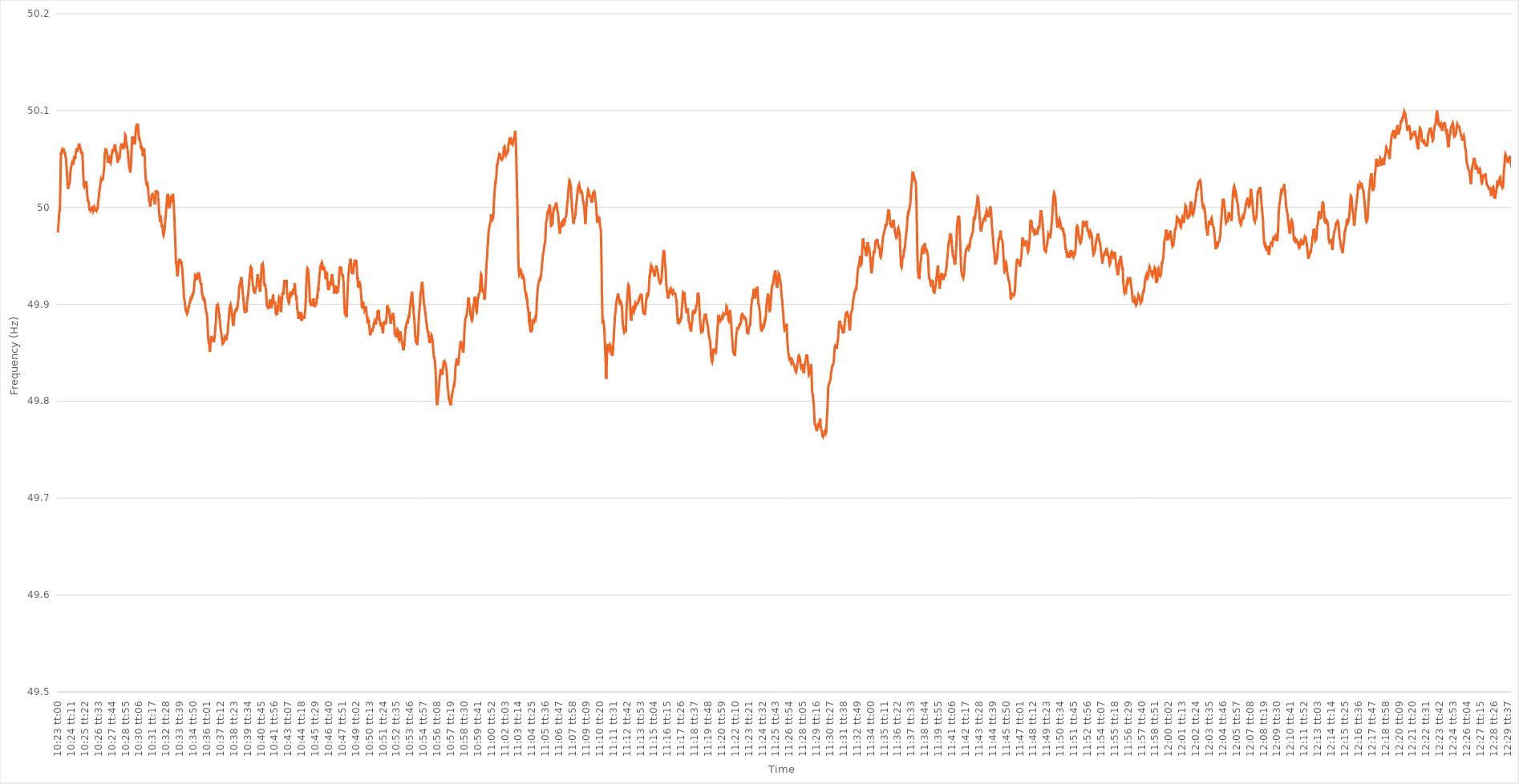
| Category | Series 0 |
|---|---|
| 0.43263888888888885 | 49.974 |
| 0.432650462962963 | 49.976 |
| 0.43266203703703704 | 49.979 |
| 0.43267361111111113 | 49.982 |
| 0.4326851851851852 | 49.984 |
| 0.43269675925925927 | 49.987 |
| 0.4327083333333333 | 49.99 |
| 0.43271990740740746 | 49.994 |
| 0.4327314814814815 | 49.995 |
| 0.4327430555555556 | 49.997 |
| 0.43275462962962963 | 49.996 |
| 0.43276620370370367 | 49.998 |
| 0.43277777777777776 | 50.008 |
| 0.4327893518518518 | 50.021 |
| 0.43280092592592595 | 50.033 |
| 0.4328125 | 50.045 |
| 0.4328240740740741 | 50.054 |
| 0.4328356481481481 | 50.057 |
| 0.4328472222222222 | 50.055 |
| 0.43285879629629626 | 50.056 |
| 0.4328703703703704 | 50.058 |
| 0.43288194444444444 | 50.058 |
| 0.43289351851851854 | 50.059 |
| 0.4329050925925926 | 50.058 |
| 0.43291666666666667 | 50.057 |
| 0.4329282407407407 | 50.058 |
| 0.43293981481481486 | 50.06 |
| 0.4329513888888889 | 50.059 |
| 0.432962962962963 | 50.06 |
| 0.43297453703703703 | 50.061 |
| 0.4329861111111111 | 50.061 |
| 0.43299768518518517 | 50.061 |
| 0.4330092592592593 | 50.058 |
| 0.43302083333333335 | 50.057 |
| 0.4330324074074074 | 50.058 |
| 0.4330439814814815 | 50.056 |
| 0.4330555555555555 | 50.055 |
| 0.4330671296296296 | 50.056 |
| 0.43307870370370366 | 50.055 |
| 0.4330902777777778 | 50.055 |
| 0.43310185185185185 | 50.053 |
| 0.43311342592592594 | 50.052 |
| 0.433125 | 50.051 |
| 0.4331365740740741 | 50.05 |
| 0.4331481481481481 | 50.047 |
| 0.43315972222222227 | 50.044 |
| 0.4331712962962963 | 50.041 |
| 0.4331828703703704 | 50.037 |
| 0.43319444444444444 | 50.034 |
| 0.43320601851851853 | 50.031 |
| 0.43321759259259257 | 50.028 |
| 0.4332291666666667 | 50.025 |
| 0.43324074074074076 | 50.022 |
| 0.4332523148148148 | 50.021 |
| 0.4332638888888889 | 50.019 |
| 0.43327546296296293 | 50.02 |
| 0.433287037037037 | 50.021 |
| 0.43329861111111106 | 50.022 |
| 0.4333101851851852 | 50.023 |
| 0.43332175925925925 | 50.024 |
| 0.43333333333333335 | 50.024 |
| 0.4333449074074074 | 50.025 |
| 0.4333564814814815 | 50.026 |
| 0.4333680555555555 | 50.028 |
| 0.43337962962962967 | 50.031 |
| 0.4333912037037037 | 50.035 |
| 0.4334027777777778 | 50.037 |
| 0.43341435185185184 | 50.037 |
| 0.43342592592592594 | 50.039 |
| 0.4334375 | 50.041 |
| 0.4334490740740741 | 50.041 |
| 0.43346064814814816 | 50.042 |
| 0.4334722222222222 | 50.043 |
| 0.4334837962962963 | 50.045 |
| 0.43349537037037034 | 50.045 |
| 0.43350694444444443 | 50.045 |
| 0.43351851851851847 | 50.047 |
| 0.4335300925925926 | 50.047 |
| 0.43354166666666666 | 50.046 |
| 0.43355324074074075 | 50.044 |
| 0.4335648148148148 | 50.045 |
| 0.4335763888888889 | 50.045 |
| 0.4335879629629629 | 50.045 |
| 0.4335995370370371 | 50.045 |
| 0.4336111111111111 | 50.048 |
| 0.4336226851851852 | 50.051 |
| 0.43363425925925925 | 50.053 |
| 0.43364583333333334 | 50.051 |
| 0.4336574074074074 | 50.052 |
| 0.43366898148148153 | 50.051 |
| 0.43368055555555557 | 50.051 |
| 0.43369212962962966 | 50.05 |
| 0.4337037037037037 | 50.052 |
| 0.4337152777777778 | 50.055 |
| 0.43372685185185184 | 50.056 |
| 0.4337384259259259 | 50.057 |
| 0.43375 | 50.059 |
| 0.43376157407407406 | 50.059 |
| 0.43377314814814816 | 50.061 |
| 0.4337847222222222 | 50.059 |
| 0.4337962962962963 | 50.057 |
| 0.43380787037037033 | 50.058 |
| 0.4338194444444445 | 50.059 |
| 0.4338310185185185 | 50.059 |
| 0.4338425925925926 | 50.06 |
| 0.43385416666666665 | 50.061 |
| 0.43386574074074075 | 50.06 |
| 0.4338773148148148 | 50.06 |
| 0.43388888888888894 | 50.062 |
| 0.433900462962963 | 50.064 |
| 0.43391203703703707 | 50.064 |
| 0.4339236111111111 | 50.065 |
| 0.4339351851851852 | 50.066 |
| 0.43394675925925924 | 50.065 |
| 0.4339583333333333 | 50.063 |
| 0.43396990740740743 | 50.063 |
| 0.43398148148148147 | 50.063 |
| 0.43399305555555556 | 50.062 |
| 0.4340046296296296 | 50.061 |
| 0.4340162037037037 | 50.061 |
| 0.43402777777777773 | 50.061 |
| 0.4340393518518519 | 50.059 |
| 0.4340509259259259 | 50.056 |
| 0.4340625 | 50.057 |
| 0.43407407407407406 | 50.058 |
| 0.43408564814814815 | 50.058 |
| 0.4340972222222222 | 50.055 |
| 0.43410879629629634 | 50.056 |
| 0.4341203703703704 | 50.057 |
| 0.4341319444444445 | 50.055 |
| 0.4341435185185185 | 50.05 |
| 0.4341550925925926 | 50.045 |
| 0.43416666666666665 | 50.04 |
| 0.4341782407407407 | 50.035 |
| 0.43418981481481483 | 50.031 |
| 0.4342013888888889 | 50.029 |
| 0.43421296296296297 | 50.025 |
| 0.434224537037037 | 50.022 |
| 0.4342361111111111 | 50.022 |
| 0.43424768518518514 | 50.021 |
| 0.4342592592592593 | 50.021 |
| 0.43427083333333333 | 50.022 |
| 0.4342824074074074 | 50.022 |
| 0.43429398148148146 | 50.022 |
| 0.43430555555555556 | 50.022 |
| 0.4343171296296296 | 50.023 |
| 0.43432870370370374 | 50.022 |
| 0.4343402777777778 | 50.024 |
| 0.4343518518518519 | 50.027 |
| 0.4343634259259259 | 50.026 |
| 0.434375 | 50.025 |
| 0.43438657407407405 | 50.025 |
| 0.4343981481481482 | 50.021 |
| 0.43440972222222224 | 50.017 |
| 0.43442129629629633 | 50.013 |
| 0.43443287037037037 | 50.011 |
| 0.4344444444444444 | 50.01 |
| 0.4344560185185185 | 50.006 |
| 0.43446759259259254 | 50.006 |
| 0.4344791666666667 | 50.007 |
| 0.43449074074074073 | 50.007 |
| 0.4345023148148148 | 50.006 |
| 0.43451388888888887 | 50.006 |
| 0.43452546296296296 | 50.004 |
| 0.434537037037037 | 50 |
| 0.43454861111111115 | 49.999 |
| 0.4345601851851852 | 49.997 |
| 0.4345717592592593 | 49.998 |
| 0.4345833333333333 | 49.997 |
| 0.4345949074074074 | 49.998 |
| 0.43460648148148145 | 49.998 |
| 0.4346180555555556 | 49.999 |
| 0.43462962962962964 | 49.997 |
| 0.43464120370370374 | 49.997 |
| 0.4346527777777778 | 49.997 |
| 0.4346643518518518 | 49.998 |
| 0.4346759259259259 | 49.998 |
| 0.43468749999999995 | 49.997 |
| 0.4346990740740741 | 49.999 |
| 0.43471064814814814 | 50 |
| 0.43472222222222223 | 50.001 |
| 0.43473379629629627 | 50.001 |
| 0.43474537037037037 | 49.999 |
| 0.4347569444444444 | 49.998 |
| 0.43476851851851855 | 49.997 |
| 0.4347800925925926 | 49.996 |
| 0.4347916666666667 | 49.996 |
| 0.4348032407407407 | 49.997 |
| 0.4348148148148148 | 49.999 |
| 0.43482638888888886 | 50 |
| 0.434837962962963 | 50 |
| 0.43484953703703705 | 50.001 |
| 0.43486111111111114 | 50.001 |
| 0.4348726851851852 | 50.001 |
| 0.4348842592592593 | 50 |
| 0.4348958333333333 | 49.997 |
| 0.43490740740740735 | 49.996 |
| 0.4349189814814815 | 49.998 |
| 0.43493055555555554 | 49.999 |
| 0.43494212962962964 | 49.998 |
| 0.4349537037037037 | 49.998 |
| 0.43496527777777777 | 49.998 |
| 0.4349768518518518 | 49.997 |
| 0.43498842592592596 | 49.999 |
| 0.435 | 49.997 |
| 0.4350115740740741 | 49.998 |
| 0.43502314814814813 | 49.998 |
| 0.4350347222222222 | 49.998 |
| 0.43504629629629626 | 49.999 |
| 0.4350578703703704 | 49.999 |
| 0.43506944444444445 | 50.001 |
| 0.43508101851851855 | 50.005 |
| 0.4350925925925926 | 50.007 |
| 0.4351041666666667 | 50.008 |
| 0.4351157407407407 | 50.008 |
| 0.43512731481481487 | 50.011 |
| 0.4351388888888889 | 50.014 |
| 0.43515046296296295 | 50.015 |
| 0.43516203703703704 | 50.017 |
| 0.4351736111111111 | 50.018 |
| 0.4351851851851852 | 50.019 |
| 0.4351967592592592 | 50.021 |
| 0.43520833333333336 | 50.023 |
| 0.4352199074074074 | 50.024 |
| 0.4352314814814815 | 50.026 |
| 0.43524305555555554 | 50.028 |
| 0.43525462962962963 | 50.029 |
| 0.43526620370370367 | 50.029 |
| 0.4352777777777778 | 50.028 |
| 0.43528935185185186 | 50.027 |
| 0.43530092592592595 | 50.028 |
| 0.4353125 | 50.028 |
| 0.4353240740740741 | 50.03 |
| 0.4353356481481481 | 50.028 |
| 0.4353472222222223 | 50.028 |
| 0.4353587962962963 | 50.029 |
| 0.43537037037037035 | 50.029 |
| 0.43538194444444445 | 50.03 |
| 0.4353935185185185 | 50.032 |
| 0.4354050925925926 | 50.034 |
| 0.4354166666666666 | 50.036 |
| 0.43542824074074077 | 50.038 |
| 0.4354398148148148 | 50.039 |
| 0.4354513888888889 | 50.041 |
| 0.43546296296296294 | 50.047 |
| 0.43547453703703703 | 50.051 |
| 0.4354861111111111 | 50.055 |
| 0.4354976851851852 | 50.056 |
| 0.43550925925925926 | 50.058 |
| 0.43552083333333336 | 50.059 |
| 0.4355324074074074 | 50.059 |
| 0.4355439814814815 | 50.059 |
| 0.43555555555555553 | 50.058 |
| 0.4355671296296297 | 50.059 |
| 0.4355787037037037 | 50.057 |
| 0.4355902777777778 | 50.057 |
| 0.43560185185185185 | 50.058 |
| 0.43561342592592595 | 50.057 |
| 0.435625 | 50.057 |
| 0.435636574074074 | 50.055 |
| 0.4356481481481482 | 50.055 |
| 0.4356597222222222 | 50.052 |
| 0.4356712962962963 | 50.051 |
| 0.43568287037037035 | 50.048 |
| 0.43569444444444444 | 50.046 |
| 0.4357060185185185 | 50.047 |
| 0.43571759259259263 | 50.047 |
| 0.43572916666666667 | 50.049 |
| 0.43574074074074076 | 50.049 |
| 0.4357523148148148 | 50.05 |
| 0.4357638888888889 | 50.049 |
| 0.43577546296296293 | 50.051 |
| 0.4357870370370371 | 50.053 |
| 0.4357986111111111 | 50.052 |
| 0.4358101851851852 | 50.05 |
| 0.43582175925925926 | 50.047 |
| 0.43583333333333335 | 50.047 |
| 0.4358449074074074 | 50.046 |
| 0.43585648148148143 | 50.046 |
| 0.4358680555555556 | 50.048 |
| 0.4358796296296296 | 50.05 |
| 0.4358912037037037 | 50.051 |
| 0.43590277777777775 | 50.051 |
| 0.43591435185185184 | 50.055 |
| 0.4359259259259259 | 50.056 |
| 0.43593750000000003 | 50.057 |
| 0.43594907407407407 | 50.059 |
| 0.43596064814814817 | 50.06 |
| 0.4359722222222222 | 50.059 |
| 0.4359837962962963 | 50.059 |
| 0.43599537037037034 | 50.058 |
| 0.4360069444444445 | 50.058 |
| 0.4360185185185185 | 50.058 |
| 0.4360300925925926 | 50.059 |
| 0.43604166666666666 | 50.061 |
| 0.43605324074074076 | 50.062 |
| 0.4360648148148148 | 50.061 |
| 0.43607638888888883 | 50.063 |
| 0.436087962962963 | 50.065 |
| 0.436099537037037 | 50.065 |
| 0.4361111111111111 | 50.065 |
| 0.43612268518518515 | 50.065 |
| 0.43613425925925925 | 50.063 |
| 0.4361458333333333 | 50.06 |
| 0.43615740740740744 | 50.059 |
| 0.4361689814814815 | 50.058 |
| 0.43618055555555557 | 50.057 |
| 0.4361921296296296 | 50.056 |
| 0.4362037037037037 | 50.057 |
| 0.43621527777777774 | 50.053 |
| 0.4362268518518519 | 50.052 |
| 0.43623842592592593 | 50.051 |
| 0.43625 | 50.048 |
| 0.43626157407407407 | 50.046 |
| 0.43627314814814816 | 50.047 |
| 0.4362847222222222 | 50.047 |
| 0.43629629629629635 | 50.049 |
| 0.4363078703703704 | 50.05 |
| 0.4363194444444445 | 50.049 |
| 0.4363310185185185 | 50.05 |
| 0.43634259259259256 | 50.051 |
| 0.43635416666666665 | 50.051 |
| 0.4363657407407407 | 50.05 |
| 0.43637731481481484 | 50.05 |
| 0.4363888888888889 | 50.053 |
| 0.436400462962963 | 50.054 |
| 0.436412037037037 | 50.056 |
| 0.4364236111111111 | 50.058 |
| 0.43643518518518515 | 50.061 |
| 0.4364467592592593 | 50.063 |
| 0.43645833333333334 | 50.062 |
| 0.43646990740740743 | 50.063 |
| 0.43648148148148147 | 50.065 |
| 0.43649305555555556 | 50.066 |
| 0.4365046296296296 | 50.066 |
| 0.43651620370370375 | 50.066 |
| 0.4365277777777778 | 50.064 |
| 0.4365393518518519 | 50.065 |
| 0.4365509259259259 | 50.064 |
| 0.43656249999999996 | 50.064 |
| 0.43657407407407406 | 50.063 |
| 0.4365856481481481 | 50.061 |
| 0.43659722222222225 | 50.06 |
| 0.4366087962962963 | 50.062 |
| 0.4366203703703704 | 50.061 |
| 0.4366319444444444 | 50.062 |
| 0.4366435185185185 | 50.063 |
| 0.43665509259259255 | 50.064 |
| 0.4366666666666667 | 50.064 |
| 0.43667824074074074 | 50.067 |
| 0.43668981481481484 | 50.068 |
| 0.4367013888888889 | 50.069 |
| 0.43671296296296297 | 50.071 |
| 0.436724537037037 | 50.075 |
| 0.43673611111111116 | 50.075 |
| 0.4367476851851852 | 50.075 |
| 0.4367592592592593 | 50.074 |
| 0.43677083333333333 | 50.069 |
| 0.43678240740740737 | 50.068 |
| 0.43679398148148146 | 50.068 |
| 0.4368055555555555 | 50.064 |
| 0.43681712962962965 | 50.061 |
| 0.4368287037037037 | 50.061 |
| 0.4368402777777778 | 50.062 |
| 0.4368518518518518 | 50.062 |
| 0.4368634259259259 | 50.06 |
| 0.43687499999999996 | 50.06 |
| 0.4368865740740741 | 50.057 |
| 0.43689814814814815 | 50.055 |
| 0.43690972222222224 | 50.052 |
| 0.4369212962962963 | 50.049 |
| 0.4369328703703704 | 50.047 |
| 0.4369444444444444 | 50.046 |
| 0.43695601851851856 | 50.044 |
| 0.4369675925925926 | 50.041 |
| 0.4369791666666667 | 50.041 |
| 0.43699074074074074 | 50.04 |
| 0.43700231481481483 | 50.039 |
| 0.43701388888888887 | 50.038 |
| 0.437025462962963 | 50.037 |
| 0.43703703703703706 | 50.036 |
| 0.4370486111111111 | 50.038 |
| 0.4370601851851852 | 50.04 |
| 0.43707175925925923 | 50.043 |
| 0.4370833333333333 | 50.049 |
| 0.43709490740740736 | 50.052 |
| 0.4371064814814815 | 50.056 |
| 0.43711805555555555 | 50.061 |
| 0.43712962962962965 | 50.065 |
| 0.4371412037037037 | 50.069 |
| 0.4371527777777778 | 50.072 |
| 0.4371643518518518 | 50.073 |
| 0.43717592592592597 | 50.071 |
| 0.4371875 | 50.07 |
| 0.4371990740740741 | 50.069 |
| 0.43721064814814814 | 50.069 |
| 0.43722222222222223 | 50.071 |
| 0.4372337962962963 | 50.073 |
| 0.4372453703703704 | 50.072 |
| 0.43725694444444446 | 50.07 |
| 0.4372685185185185 | 50.069 |
| 0.4372800925925926 | 50.066 |
| 0.43729166666666663 | 50.065 |
| 0.43730324074074073 | 50.065 |
| 0.43731481481481477 | 50.067 |
| 0.4373263888888889 | 50.068 |
| 0.43733796296296296 | 50.071 |
| 0.43734953703703705 | 50.074 |
| 0.4373611111111111 | 50.078 |
| 0.4373726851851852 | 50.08 |
| 0.4373842592592592 | 50.082 |
| 0.4373958333333334 | 50.084 |
| 0.4374074074074074 | 50.084 |
| 0.4374189814814815 | 50.083 |
| 0.43743055555555554 | 50.086 |
| 0.43744212962962964 | 50.085 |
| 0.4374537037037037 | 50.084 |
| 0.43746527777777783 | 50.084 |
| 0.43747685185185187 | 50.085 |
| 0.43748842592592596 | 50.086 |
| 0.4375 | 50.085 |
| 0.43751157407407404 | 50.082 |
| 0.43752314814814813 | 50.078 |
| 0.43753472222222217 | 50.076 |
| 0.4375462962962963 | 50.074 |
| 0.43755787037037036 | 50.073 |
| 0.43756944444444446 | 50.071 |
| 0.4375810185185185 | 50.069 |
| 0.4375925925925926 | 50.069 |
| 0.4376041666666666 | 50.07 |
| 0.4376157407407408 | 50.07 |
| 0.4376273148148148 | 50.069 |
| 0.4376388888888889 | 50.068 |
| 0.43765046296296295 | 50.066 |
| 0.43766203703703704 | 50.064 |
| 0.4376736111111111 | 50.062 |
| 0.43768518518518523 | 50.062 |
| 0.43769675925925927 | 50.061 |
| 0.43770833333333337 | 50.061 |
| 0.4377199074074074 | 50.061 |
| 0.4377314814814815 | 50.062 |
| 0.43774305555555554 | 50.062 |
| 0.4377546296296296 | 50.061 |
| 0.4377662037037037 | 50.06 |
| 0.43777777777777777 | 50.057 |
| 0.43778935185185186 | 50.054 |
| 0.4378009259259259 | 50.055 |
| 0.4378125 | 50.053 |
| 0.43782407407407403 | 50.053 |
| 0.4378356481481482 | 50.054 |
| 0.4378472222222222 | 50.058 |
| 0.4378587962962963 | 50.06 |
| 0.43787037037037035 | 50.061 |
| 0.43788194444444445 | 50.058 |
| 0.4378935185185185 | 50.058 |
| 0.43790509259259264 | 50.058 |
| 0.4379166666666667 | 50.051 |
| 0.43792824074074077 | 50.043 |
| 0.4379398148148148 | 50.039 |
| 0.4379513888888889 | 50.034 |
| 0.43796296296296294 | 50.031 |
| 0.437974537037037 | 50.029 |
| 0.43798611111111113 | 50.028 |
| 0.43799768518518517 | 50.026 |
| 0.43800925925925926 | 50.025 |
| 0.4380208333333333 | 50.025 |
| 0.4380324074074074 | 50.026 |
| 0.43804398148148144 | 50.026 |
| 0.4380555555555556 | 50.025 |
| 0.4380671296296296 | 50.026 |
| 0.4380787037037037 | 50.024 |
| 0.43809027777777776 | 50.022 |
| 0.43810185185185185 | 50.021 |
| 0.4381134259259259 | 50.02 |
| 0.43812500000000004 | 50.017 |
| 0.4381365740740741 | 50.014 |
| 0.4381481481481482 | 50.012 |
| 0.4381597222222222 | 50.011 |
| 0.4381712962962963 | 50.008 |
| 0.43818287037037035 | 50.006 |
| 0.4381944444444445 | 50.007 |
| 0.43820601851851854 | 50.006 |
| 0.43821759259259263 | 50.005 |
| 0.43822916666666667 | 50.002 |
| 0.4382407407407407 | 50.001 |
| 0.4382523148148148 | 50.001 |
| 0.43826388888888884 | 50.004 |
| 0.438275462962963 | 50.005 |
| 0.43828703703703703 | 50.007 |
| 0.4382986111111111 | 50.008 |
| 0.43831018518518516 | 50.008 |
| 0.43832175925925926 | 50.009 |
| 0.4383333333333333 | 50.012 |
| 0.43834490740740745 | 50.013 |
| 0.4383564814814815 | 50.014 |
| 0.4383680555555556 | 50.013 |
| 0.4383796296296296 | 50.014 |
| 0.4383912037037037 | 50.012 |
| 0.43840277777777775 | 50.011 |
| 0.4384143518518519 | 50.012 |
| 0.43842592592592594 | 50.012 |
| 0.43843750000000004 | 50.011 |
| 0.4384490740740741 | 50.012 |
| 0.4384606481481481 | 50.01 |
| 0.4384722222222222 | 50.01 |
| 0.43848379629629625 | 50.009 |
| 0.4384953703703704 | 50.007 |
| 0.43850694444444444 | 50.004 |
| 0.43851851851851853 | 50.003 |
| 0.43853009259259257 | 50.004 |
| 0.43854166666666666 | 50.006 |
| 0.4385532407407407 | 50.01 |
| 0.43856481481481485 | 50.014 |
| 0.4385763888888889 | 50.017 |
| 0.438587962962963 | 50.018 |
| 0.438599537037037 | 50.017 |
| 0.4386111111111111 | 50.017 |
| 0.43862268518518516 | 50.017 |
| 0.4386342592592593 | 50.016 |
| 0.43864583333333335 | 50.015 |
| 0.43865740740740744 | 50.013 |
| 0.4386689814814815 | 50.015 |
| 0.4386805555555555 | 50.016 |
| 0.4386921296296296 | 50.017 |
| 0.43870370370370365 | 50.013 |
| 0.4387152777777778 | 50.011 |
| 0.43872685185185184 | 50.01 |
| 0.43873842592592593 | 50.008 |
| 0.43875 | 50.005 |
| 0.43876157407407407 | 50.001 |
| 0.4387731481481481 | 49.998 |
| 0.43878472222222226 | 49.995 |
| 0.4387962962962963 | 49.992 |
| 0.4388078703703704 | 49.991 |
| 0.43881944444444443 | 49.989 |
| 0.4388310185185185 | 49.985 |
| 0.43884259259259256 | 49.987 |
| 0.4388541666666667 | 49.987 |
| 0.43886574074074075 | 49.988 |
| 0.43887731481481485 | 49.988 |
| 0.4388888888888889 | 49.989 |
| 0.438900462962963 | 49.988 |
| 0.438912037037037 | 49.986 |
| 0.43892361111111106 | 49.983 |
| 0.4389351851851852 | 49.982 |
| 0.43894675925925924 | 49.98 |
| 0.43895833333333334 | 49.981 |
| 0.4389699074074074 | 49.98 |
| 0.4389814814814815 | 49.98 |
| 0.4389930555555555 | 49.979 |
| 0.43900462962962966 | 49.978 |
| 0.4390162037037037 | 49.974 |
| 0.4390277777777778 | 49.972 |
| 0.43903935185185183 | 49.972 |
| 0.43905092592592593 | 49.971 |
| 0.43906249999999997 | 49.972 |
| 0.4390740740740741 | 49.973 |
| 0.43908564814814816 | 49.973 |
| 0.43909722222222225 | 49.973 |
| 0.4391087962962963 | 49.977 |
| 0.4391203703703704 | 49.979 |
| 0.4391319444444444 | 49.982 |
| 0.43914351851851857 | 49.983 |
| 0.4391550925925926 | 49.987 |
| 0.43916666666666665 | 49.989 |
| 0.43917824074074074 | 49.991 |
| 0.4391898148148148 | 49.992 |
| 0.4392013888888889 | 49.994 |
| 0.4392129629629629 | 49.999 |
| 0.43922453703703707 | 50.001 |
| 0.4392361111111111 | 50.003 |
| 0.4392476851851852 | 50.005 |
| 0.43925925925925924 | 50.007 |
| 0.43927083333333333 | 50.011 |
| 0.43928240740740737 | 50.012 |
| 0.4392939814814815 | 50.014 |
| 0.43930555555555556 | 50.014 |
| 0.43931712962962965 | 50.014 |
| 0.4393287037037037 | 50.012 |
| 0.4393402777777778 | 50.011 |
| 0.4393518518518518 | 50.007 |
| 0.439363425925926 | 50.003 |
| 0.439375 | 50.002 |
| 0.4393865740740741 | 50 |
| 0.43939814814814815 | 50 |
| 0.4394097222222222 | 49.999 |
| 0.4394212962962963 | 50.001 |
| 0.4394328703703703 | 50.001 |
| 0.43944444444444447 | 50.003 |
| 0.4394560185185185 | 50.004 |
| 0.4394675925925926 | 50.006 |
| 0.43947916666666664 | 50.009 |
| 0.43949074074074074 | 50.01 |
| 0.4395023148148148 | 50.012 |
| 0.4395138888888889 | 50.012 |
| 0.43952546296296297 | 50.01 |
| 0.43953703703703706 | 50.01 |
| 0.4395486111111111 | 50.009 |
| 0.4395601851851852 | 50.01 |
| 0.43957175925925923 | 50.01 |
| 0.4395833333333334 | 50.011 |
| 0.4395949074074074 | 50.011 |
| 0.4396064814814815 | 50.014 |
| 0.43961805555555555 | 50.014 |
| 0.43962962962962965 | 50.012 |
| 0.4396412037037037 | 50.01 |
| 0.4396527777777777 | 50.009 |
| 0.4396643518518519 | 50.005 |
| 0.4396759259259259 | 50.001 |
| 0.4396875 | 49.996 |
| 0.43969907407407405 | 49.992 |
| 0.43971064814814814 | 49.988 |
| 0.4397222222222222 | 49.983 |
| 0.43973379629629633 | 49.976 |
| 0.43974537037037037 | 49.972 |
| 0.43975694444444446 | 49.967 |
| 0.4397685185185185 | 49.962 |
| 0.4397800925925926 | 49.956 |
| 0.43979166666666664 | 49.949 |
| 0.4398032407407408 | 49.944 |
| 0.4398148148148148 | 49.942 |
| 0.4398263888888889 | 49.941 |
| 0.43983796296296296 | 49.941 |
| 0.43984953703703705 | 49.938 |
| 0.4398611111111111 | 49.935 |
| 0.43987268518518513 | 49.934 |
| 0.4398842592592593 | 49.929 |
| 0.4398958333333333 | 49.93 |
| 0.4399074074074074 | 49.931 |
| 0.43991898148148145 | 49.932 |
| 0.43993055555555555 | 49.933 |
| 0.4399421296296296 | 49.935 |
| 0.43995370370370374 | 49.94 |
| 0.4399652777777778 | 49.943 |
| 0.43997685185185187 | 49.945 |
| 0.4399884259259259 | 49.944 |
| 0.44 | 49.945 |
| 0.44001157407407404 | 49.946 |
| 0.4400231481481482 | 49.947 |
| 0.44003472222222223 | 49.947 |
| 0.4400462962962963 | 49.945 |
| 0.44005787037037036 | 49.945 |
| 0.44006944444444446 | 49.945 |
| 0.4400810185185185 | 49.944 |
| 0.44009259259259265 | 49.945 |
| 0.4401041666666667 | 49.943 |
| 0.4401157407407407 | 49.942 |
| 0.4401273148148148 | 49.944 |
| 0.44013888888888886 | 49.943 |
| 0.44015046296296295 | 49.943 |
| 0.440162037037037 | 49.94 |
| 0.44017361111111114 | 49.938 |
| 0.4401851851851852 | 49.937 |
| 0.4401967592592593 | 49.934 |
| 0.4402083333333333 | 49.931 |
| 0.4402199074074074 | 49.927 |
| 0.44023148148148145 | 49.925 |
| 0.4402430555555556 | 49.921 |
| 0.44025462962962963 | 49.919 |
| 0.44026620370370373 | 49.916 |
| 0.44027777777777777 | 49.911 |
| 0.44028935185185186 | 49.907 |
| 0.4403009259259259 | 49.906 |
| 0.44031250000000005 | 49.905 |
| 0.4403240740740741 | 49.904 |
| 0.4403356481481482 | 49.903 |
| 0.4403472222222222 | 49.9 |
| 0.44035879629629626 | 49.899 |
| 0.44037037037037036 | 49.897 |
| 0.4403819444444444 | 49.896 |
| 0.44039351851851855 | 49.895 |
| 0.4404050925925926 | 49.893 |
| 0.4404166666666667 | 49.893 |
| 0.4404282407407407 | 49.893 |
| 0.4404398148148148 | 49.893 |
| 0.44045138888888885 | 49.892 |
| 0.440462962962963 | 49.891 |
| 0.44047453703703704 | 49.89 |
| 0.44048611111111113 | 49.89 |
| 0.4404976851851852 | 49.89 |
| 0.44050925925925927 | 49.891 |
| 0.4405208333333333 | 49.892 |
| 0.44053240740740746 | 49.893 |
| 0.4405439814814815 | 49.893 |
| 0.4405555555555556 | 49.895 |
| 0.44056712962962963 | 49.897 |
| 0.44057870370370367 | 49.898 |
| 0.44059027777777776 | 49.897 |
| 0.4406018518518518 | 49.898 |
| 0.44061342592592595 | 49.898 |
| 0.440625 | 49.901 |
| 0.4406365740740741 | 49.901 |
| 0.4406481481481481 | 49.901 |
| 0.4406597222222222 | 49.903 |
| 0.44067129629629626 | 49.904 |
| 0.4406828703703704 | 49.905 |
| 0.44069444444444444 | 49.905 |
| 0.44070601851851854 | 49.904 |
| 0.4407175925925926 | 49.904 |
| 0.44072916666666667 | 49.904 |
| 0.4407407407407407 | 49.905 |
| 0.44075231481481486 | 49.906 |
| 0.4407638888888889 | 49.906 |
| 0.440775462962963 | 49.907 |
| 0.44078703703703703 | 49.908 |
| 0.4407986111111111 | 49.91 |
| 0.44081018518518517 | 49.909 |
| 0.4408217592592592 | 49.911 |
| 0.44083333333333335 | 49.912 |
| 0.4408449074074074 | 49.911 |
| 0.4408564814814815 | 49.911 |
| 0.4408680555555555 | 49.912 |
| 0.4408796296296296 | 49.913 |
| 0.44089120370370366 | 49.915 |
| 0.4409027777777778 | 49.917 |
| 0.44091435185185185 | 49.92 |
| 0.44092592592592594 | 49.923 |
| 0.4409375 | 49.925 |
| 0.4409490740740741 | 49.926 |
| 0.4409606481481481 | 49.928 |
| 0.44097222222222227 | 49.93 |
| 0.4409837962962963 | 49.93 |
| 0.4409953703703704 | 49.93 |
| 0.44100694444444444 | 49.93 |
| 0.44101851851851853 | 49.929 |
| 0.44103009259259257 | 49.927 |
| 0.4410416666666667 | 49.925 |
| 0.44105324074074076 | 49.925 |
| 0.4410648148148148 | 49.925 |
| 0.4410763888888889 | 49.927 |
| 0.44108796296296293 | 49.928 |
| 0.441099537037037 | 49.929 |
| 0.44111111111111106 | 49.93 |
| 0.4411226851851852 | 49.93 |
| 0.44113425925925925 | 49.93 |
| 0.44114583333333335 | 49.929 |
| 0.4411574074074074 | 49.931 |
| 0.4411689814814815 | 49.932 |
| 0.4411805555555555 | 49.933 |
| 0.44119212962962967 | 49.932 |
| 0.4412037037037037 | 49.932 |
| 0.4412152777777778 | 49.93 |
| 0.44122685185185184 | 49.93 |
| 0.44123842592592594 | 49.929 |
| 0.44125 | 49.928 |
| 0.4412615740740741 | 49.926 |
| 0.44127314814814816 | 49.923 |
| 0.44128472222222226 | 49.923 |
| 0.4412962962962963 | 49.923 |
| 0.44130787037037034 | 49.922 |
| 0.44131944444444443 | 49.921 |
| 0.44133101851851847 | 49.922 |
| 0.4413425925925926 | 49.92 |
| 0.44135416666666666 | 49.918 |
| 0.44136574074074075 | 49.914 |
| 0.4413773148148148 | 49.912 |
| 0.4413888888888889 | 49.912 |
| 0.4414004629629629 | 49.911 |
| 0.4414120370370371 | 49.909 |
| 0.4414236111111111 | 49.908 |
| 0.4414351851851852 | 49.907 |
| 0.44144675925925925 | 49.905 |
| 0.44145833333333334 | 49.906 |
| 0.4414699074074074 | 49.906 |
| 0.44148148148148153 | 49.905 |
| 0.44149305555555557 | 49.905 |
| 0.44150462962962966 | 49.905 |
| 0.4415162037037037 | 49.906 |
| 0.44152777777777774 | 49.906 |
| 0.44153935185185184 | 49.905 |
| 0.4415509259259259 | 49.904 |
| 0.4415625 | 49.902 |
| 0.44157407407407406 | 49.9 |
| 0.44158564814814816 | 49.898 |
| 0.4415972222222222 | 49.898 |
| 0.4416087962962963 | 49.895 |
| 0.44162037037037033 | 49.894 |
| 0.4416319444444445 | 49.894 |
| 0.4416435185185185 | 49.892 |
| 0.4416550925925926 | 49.892 |
| 0.44166666666666665 | 49.892 |
| 0.44167824074074075 | 49.89 |
| 0.4416898148148148 | 49.888 |
| 0.44170138888888894 | 49.885 |
| 0.441712962962963 | 49.882 |
| 0.44172453703703707 | 49.877 |
| 0.4417361111111111 | 49.872 |
| 0.4417476851851852 | 49.868 |
| 0.44175925925925924 | 49.865 |
| 0.4417708333333333 | 49.863 |
| 0.44178240740740743 | 49.862 |
| 0.44179398148148147 | 49.86 |
| 0.44180555555555556 | 49.861 |
| 0.4418171296296296 | 49.859 |
| 0.4418287037037037 | 49.858 |
| 0.44184027777777773 | 49.853 |
| 0.4418518518518519 | 49.852 |
| 0.4418634259259259 | 49.851 |
| 0.441875 | 49.854 |
| 0.44188657407407406 | 49.856 |
| 0.44189814814814815 | 49.859 |
| 0.4419097222222222 | 49.863 |
| 0.44192129629629634 | 49.865 |
| 0.4419328703703704 | 49.867 |
| 0.4419444444444445 | 49.867 |
| 0.4419560185185185 | 49.866 |
| 0.4419675925925926 | 49.865 |
| 0.44197916666666665 | 49.866 |
| 0.4419907407407408 | 49.865 |
| 0.44200231481481483 | 49.865 |
| 0.4420138888888889 | 49.864 |
| 0.44202546296296297 | 49.865 |
| 0.442037037037037 | 49.864 |
| 0.4420486111111111 | 49.865 |
| 0.44206018518518514 | 49.864 |
| 0.4420717592592593 | 49.863 |
| 0.44208333333333333 | 49.862 |
| 0.4420949074074074 | 49.862 |
| 0.44210648148148146 | 49.861 |
| 0.44211805555555556 | 49.863 |
| 0.4421296296296296 | 49.864 |
| 0.44214120370370374 | 49.865 |
| 0.4421527777777778 | 49.867 |
| 0.4421643518518519 | 49.869 |
| 0.4421759259259259 | 49.872 |
| 0.4421875 | 49.873 |
| 0.44219907407407405 | 49.877 |
| 0.4422106481481482 | 49.879 |
| 0.44222222222222224 | 49.882 |
| 0.44223379629629633 | 49.886 |
| 0.44224537037037037 | 49.89 |
| 0.4422569444444444 | 49.894 |
| 0.4422685185185185 | 49.896 |
| 0.44228009259259254 | 49.898 |
| 0.4422916666666667 | 49.9 |
| 0.44230324074074073 | 49.899 |
| 0.4423148148148148 | 49.897 |
| 0.44232638888888887 | 49.898 |
| 0.44233796296296296 | 49.898 |
| 0.442349537037037 | 49.899 |
| 0.44236111111111115 | 49.899 |
| 0.4423726851851852 | 49.897 |
| 0.4423842592592593 | 49.896 |
| 0.4423958333333333 | 49.893 |
| 0.4424074074074074 | 49.892 |
| 0.44241898148148145 | 49.89 |
| 0.4424305555555556 | 49.889 |
| 0.44244212962962964 | 49.886 |
| 0.44245370370370374 | 49.885 |
| 0.4424652777777778 | 49.884 |
| 0.4424768518518518 | 49.881 |
| 0.4424884259259259 | 49.88 |
| 0.44249999999999995 | 49.877 |
| 0.4425115740740741 | 49.875 |
| 0.44252314814814814 | 49.873 |
| 0.44253472222222223 | 49.873 |
| 0.44254629629629627 | 49.871 |
| 0.44255787037037037 | 49.87 |
| 0.4425694444444444 | 49.868 |
| 0.44258101851851855 | 49.868 |
| 0.4425925925925926 | 49.865 |
| 0.4426041666666667 | 49.864 |
| 0.4426157407407407 | 49.862 |
| 0.4426273148148148 | 49.86 |
| 0.44263888888888886 | 49.859 |
| 0.442650462962963 | 49.859 |
| 0.44266203703703705 | 49.859 |
| 0.44267361111111114 | 49.859 |
| 0.4426851851851852 | 49.86 |
| 0.4426967592592593 | 49.86 |
| 0.4427083333333333 | 49.861 |
| 0.44271990740740735 | 49.862 |
| 0.4427314814814815 | 49.864 |
| 0.44274305555555554 | 49.864 |
| 0.44275462962962964 | 49.866 |
| 0.4427662037037037 | 49.865 |
| 0.44277777777777777 | 49.866 |
| 0.4427893518518518 | 49.866 |
| 0.44280092592592596 | 49.866 |
| 0.4428125 | 49.866 |
| 0.4428240740740741 | 49.864 |
| 0.44283564814814813 | 49.864 |
| 0.4428472222222222 | 49.863 |
| 0.44285879629629626 | 49.865 |
| 0.4428703703703704 | 49.864 |
| 0.44288194444444445 | 49.865 |
| 0.44289351851851855 | 49.867 |
| 0.4429050925925926 | 49.868 |
| 0.4429166666666667 | 49.869 |
| 0.4429282407407407 | 49.869 |
| 0.44293981481481487 | 49.871 |
| 0.4429513888888889 | 49.874 |
| 0.44296296296296295 | 49.877 |
| 0.44297453703703704 | 49.879 |
| 0.4429861111111111 | 49.882 |
| 0.4429976851851852 | 49.883 |
| 0.4430092592592592 | 49.885 |
| 0.44302083333333336 | 49.887 |
| 0.4430324074074074 | 49.891 |
| 0.4430439814814815 | 49.894 |
| 0.44305555555555554 | 49.896 |
| 0.44306712962962963 | 49.897 |
| 0.44307870370370367 | 49.898 |
| 0.4430902777777778 | 49.899 |
| 0.44310185185185186 | 49.899 |
| 0.44311342592592595 | 49.9 |
| 0.443125 | 49.899 |
| 0.4431365740740741 | 49.898 |
| 0.4431481481481481 | 49.898 |
| 0.4431597222222223 | 49.896 |
| 0.4431712962962963 | 49.894 |
| 0.44318287037037035 | 49.893 |
| 0.44319444444444445 | 49.89 |
| 0.4432060185185185 | 49.889 |
| 0.4432175925925926 | 49.888 |
| 0.4432291666666666 | 49.886 |
| 0.44324074074074077 | 49.884 |
| 0.4432523148148148 | 49.881 |
| 0.4432638888888889 | 49.878 |
| 0.44327546296296294 | 49.879 |
| 0.44328703703703703 | 49.878 |
| 0.4432986111111111 | 49.88 |
| 0.4433101851851852 | 49.881 |
| 0.44332175925925926 | 49.883 |
| 0.44333333333333336 | 49.885 |
| 0.4433449074074074 | 49.887 |
| 0.4433564814814815 | 49.889 |
| 0.44336805555555553 | 49.891 |
| 0.4433796296296297 | 49.892 |
| 0.4433912037037037 | 49.892 |
| 0.4434027777777778 | 49.893 |
| 0.44341435185185185 | 49.893 |
| 0.4434259259259259 | 49.894 |
| 0.4434375 | 49.893 |
| 0.443449074074074 | 49.894 |
| 0.4434606481481482 | 49.894 |
| 0.4434722222222222 | 49.894 |
| 0.4434837962962963 | 49.894 |
| 0.44349537037037035 | 49.896 |
| 0.44350694444444444 | 49.895 |
| 0.4435185185185185 | 49.895 |
| 0.44353009259259263 | 49.896 |
| 0.44354166666666667 | 49.896 |
| 0.44355324074074076 | 49.899 |
| 0.4435648148148148 | 49.902 |
| 0.4435763888888889 | 49.904 |
| 0.44358796296296293 | 49.905 |
| 0.4435995370370371 | 49.907 |
| 0.4436111111111111 | 49.909 |
| 0.4436226851851852 | 49.912 |
| 0.44363425925925926 | 49.917 |
| 0.44364583333333335 | 49.919 |
| 0.4436574074074074 | 49.92 |
| 0.44366898148148143 | 49.919 |
| 0.4436805555555556 | 49.92 |
| 0.4436921296296296 | 49.92 |
| 0.4437037037037037 | 49.919 |
| 0.44371527777777775 | 49.919 |
| 0.44372685185185184 | 49.92 |
| 0.4437384259259259 | 49.924 |
| 0.44375000000000003 | 49.924 |
| 0.44376157407407407 | 49.928 |
| 0.44377314814814817 | 49.925 |
| 0.4437847222222222 | 49.926 |
| 0.4437962962962963 | 49.924 |
| 0.44380787037037034 | 49.921 |
| 0.4438194444444445 | 49.92 |
| 0.4438310185185185 | 49.918 |
| 0.4438425925925926 | 49.915 |
| 0.44385416666666666 | 49.913 |
| 0.44386574074074076 | 49.91 |
| 0.4438773148148148 | 49.909 |
| 0.44388888888888894 | 49.907 |
| 0.443900462962963 | 49.904 |
| 0.443912037037037 | 49.903 |
| 0.4439236111111111 | 49.899 |
| 0.44393518518518515 | 49.898 |
| 0.44394675925925925 | 49.895 |
| 0.4439583333333333 | 49.894 |
| 0.44396990740740744 | 49.893 |
| 0.4439814814814815 | 49.891 |
| 0.44399305555555557 | 49.893 |
| 0.4440046296296296 | 49.893 |
| 0.4440162037037037 | 49.893 |
| 0.44402777777777774 | 49.894 |
| 0.4440393518518519 | 49.893 |
| 0.44405092592592593 | 49.892 |
| 0.4440625 | 49.893 |
| 0.44407407407407407 | 49.892 |
| 0.44408564814814816 | 49.894 |
| 0.4440972222222222 | 49.897 |
| 0.44410879629629635 | 49.9 |
| 0.4441203703703704 | 49.9 |
| 0.4441319444444444 | 49.904 |
| 0.4441435185185185 | 49.906 |
| 0.44415509259259256 | 49.908 |
| 0.44416666666666665 | 49.909 |
| 0.4441782407407407 | 49.908 |
| 0.44418981481481484 | 49.913 |
| 0.4442013888888889 | 49.914 |
| 0.444212962962963 | 49.916 |
| 0.444224537037037 | 49.918 |
| 0.4442361111111111 | 49.92 |
| 0.44424768518518515 | 49.923 |
| 0.4442592592592593 | 49.927 |
| 0.44427083333333334 | 49.928 |
| 0.44428240740740743 | 49.929 |
| 0.44429398148148147 | 49.931 |
| 0.44430555555555556 | 49.932 |
| 0.4443171296296296 | 49.935 |
| 0.44432870370370375 | 49.939 |
| 0.4443402777777778 | 49.937 |
| 0.4443518518518519 | 49.938 |
| 0.4443634259259259 | 49.938 |
| 0.44437499999999996 | 49.937 |
| 0.44438657407407406 | 49.938 |
| 0.4443981481481481 | 49.935 |
| 0.44440972222222225 | 49.934 |
| 0.4444212962962963 | 49.929 |
| 0.4444328703703704 | 49.927 |
| 0.4444444444444444 | 49.927 |
| 0.4444560185185185 | 49.921 |
| 0.44446759259259255 | 49.92 |
| 0.4444791666666667 | 49.92 |
| 0.44449074074074074 | 49.918 |
| 0.44450231481481484 | 49.916 |
| 0.4445138888888889 | 49.916 |
| 0.44452546296296297 | 49.913 |
| 0.444537037037037 | 49.915 |
| 0.44454861111111116 | 49.913 |
| 0.4445601851851852 | 49.914 |
| 0.4445717592592593 | 49.912 |
| 0.44458333333333333 | 49.912 |
| 0.4445949074074074 | 49.911 |
| 0.44460648148148146 | 49.913 |
| 0.4446180555555555 | 49.914 |
| 0.44462962962962965 | 49.916 |
| 0.4446412037037037 | 49.917 |
| 0.4446527777777778 | 49.917 |
| 0.4446643518518518 | 49.917 |
| 0.4446759259259259 | 49.917 |
| 0.44468749999999996 | 49.917 |
| 0.4446990740740741 | 49.918 |
| 0.44471064814814815 | 49.92 |
| 0.44472222222222224 | 49.926 |
| 0.4447337962962963 | 49.926 |
| 0.4447453703703704 | 49.93 |
| 0.4447569444444444 | 49.931 |
| 0.44476851851851856 | 49.929 |
| 0.4447800925925926 | 49.929 |
| 0.4447916666666667 | 49.926 |
| 0.44480324074074074 | 49.926 |
| 0.44481481481481483 | 49.925 |
| 0.44482638888888887 | 49.925 |
| 0.444837962962963 | 49.924 |
| 0.44484953703703706 | 49.924 |
| 0.4448611111111111 | 49.922 |
| 0.4448726851851852 | 49.919 |
| 0.44488425925925923 | 49.915 |
| 0.4448958333333333 | 49.914 |
| 0.44490740740740736 | 49.913 |
| 0.4449189814814815 | 49.915 |
| 0.44493055555555555 | 49.915 |
| 0.44494212962962965 | 49.919 |
| 0.4449537037037037 | 49.925 |
| 0.4449652777777778 | 49.929 |
| 0.4449768518518518 | 49.932 |
| 0.44498842592592597 | 49.936 |
| 0.445 | 49.936 |
| 0.4450115740740741 | 49.94 |
| 0.44502314814814814 | 49.942 |
| 0.44503472222222223 | 49.941 |
| 0.4450462962962963 | 49.941 |
| 0.4450578703703704 | 49.941 |
| 0.44506944444444446 | 49.942 |
| 0.4450810185185185 | 49.941 |
| 0.4450925925925926 | 49.941 |
| 0.44510416666666663 | 49.937 |
| 0.44511574074074073 | 49.935 |
| 0.44512731481481477 | 49.931 |
| 0.4451388888888889 | 49.926 |
| 0.44515046296296296 | 49.923 |
| 0.44516203703703705 | 49.922 |
| 0.4451736111111111 | 49.92 |
| 0.4451851851851852 | 49.919 |
| 0.4451967592592592 | 49.92 |
| 0.4452083333333334 | 49.921 |
| 0.4452199074074074 | 49.919 |
| 0.4452314814814815 | 49.918 |
| 0.44524305555555554 | 49.917 |
| 0.44525462962962964 | 49.916 |
| 0.4452662037037037 | 49.913 |
| 0.44527777777777783 | 49.911 |
| 0.44528935185185187 | 49.907 |
| 0.44530092592592596 | 49.904 |
| 0.4453125 | 49.899 |
| 0.44532407407407404 | 49.898 |
| 0.44533564814814813 | 49.899 |
| 0.44534722222222217 | 49.898 |
| 0.4453587962962963 | 49.899 |
| 0.44537037037037036 | 49.899 |
| 0.44538194444444446 | 49.897 |
| 0.4453935185185185 | 49.896 |
| 0.4454050925925926 | 49.895 |
| 0.4454166666666666 | 49.896 |
| 0.4454282407407408 | 49.898 |
| 0.4454398148148148 | 49.897 |
| 0.4454513888888889 | 49.898 |
| 0.44546296296296295 | 49.897 |
| 0.44547453703703704 | 49.898 |
| 0.4454861111111111 | 49.903 |
| 0.44549768518518523 | 49.903 |
| 0.44550925925925927 | 49.904 |
| 0.44552083333333337 | 49.905 |
| 0.4455324074074074 | 49.902 |
| 0.4455439814814815 | 49.902 |
| 0.44555555555555554 | 49.898 |
| 0.4455671296296296 | 49.899 |
| 0.4455787037037037 | 49.898 |
| 0.44559027777777777 | 49.897 |
| 0.44560185185185186 | 49.896 |
| 0.4456134259259259 | 49.897 |
| 0.445625 | 49.899 |
| 0.44563657407407403 | 49.9 |
| 0.4456481481481482 | 49.903 |
| 0.4456597222222222 | 49.906 |
| 0.4456712962962963 | 49.907 |
| 0.44568287037037035 | 49.908 |
| 0.44569444444444445 | 49.91 |
| 0.4457060185185185 | 49.907 |
| 0.44571759259259264 | 49.907 |
| 0.4457291666666667 | 49.904 |
| 0.44574074074074077 | 49.904 |
| 0.4457523148148148 | 49.901 |
| 0.4457638888888889 | 49.903 |
| 0.44577546296296294 | 49.902 |
| 0.445787037037037 | 49.901 |
| 0.44579861111111113 | 49.903 |
| 0.44581018518518517 | 49.901 |
| 0.44582175925925926 | 49.9 |
| 0.4458333333333333 | 49.899 |
| 0.4458449074074074 | 49.894 |
| 0.44585648148148144 | 49.891 |
| 0.4458680555555556 | 49.892 |
| 0.4458796296296296 | 49.891 |
| 0.4458912037037037 | 49.891 |
| 0.44590277777777776 | 49.892 |
| 0.44591435185185185 | 49.889 |
| 0.4459259259259259 | 49.889 |
| 0.44593750000000004 | 49.889 |
| 0.4459490740740741 | 49.889 |
| 0.4459606481481482 | 49.889 |
| 0.4459722222222222 | 49.894 |
| 0.4459837962962963 | 49.895 |
| 0.44599537037037035 | 49.897 |
| 0.4460069444444445 | 49.897 |
| 0.44601851851851854 | 49.9 |
| 0.4460300925925926 | 49.903 |
| 0.44604166666666667 | 49.906 |
| 0.4460532407407407 | 49.907 |
| 0.4460648148148148 | 49.907 |
| 0.44607638888888884 | 49.906 |
| 0.446087962962963 | 49.906 |
| 0.44609953703703703 | 49.907 |
| 0.4461111111111111 | 49.908 |
| 0.44612268518518516 | 49.905 |
| 0.44613425925925926 | 49.904 |
| 0.4461458333333333 | 49.897 |
| 0.44615740740740745 | 49.894 |
| 0.4461689814814815 | 49.892 |
| 0.4461805555555556 | 49.892 |
| 0.4461921296296296 | 49.893 |
| 0.4462037037037037 | 49.899 |
| 0.44621527777777775 | 49.902 |
| 0.4462268518518519 | 49.905 |
| 0.44623842592592594 | 49.906 |
| 0.44625000000000004 | 49.907 |
| 0.4462615740740741 | 49.911 |
| 0.4462731481481481 | 49.912 |
| 0.4462847222222222 | 49.913 |
| 0.44629629629629625 | 49.913 |
| 0.4463078703703704 | 49.91 |
| 0.44631944444444444 | 49.911 |
| 0.44633101851851853 | 49.915 |
| 0.44634259259259257 | 49.915 |
| 0.44635416666666666 | 49.919 |
| 0.4463657407407407 | 49.921 |
| 0.44637731481481485 | 49.925 |
| 0.4463888888888889 | 49.924 |
| 0.446400462962963 | 49.924 |
| 0.446412037037037 | 49.923 |
| 0.4464236111111111 | 49.924 |
| 0.44643518518518516 | 49.925 |
| 0.4464467592592593 | 49.924 |
| 0.44645833333333335 | 49.923 |
| 0.44646990740740744 | 49.922 |
| 0.4464814814814815 | 49.925 |
| 0.4464930555555556 | 49.924 |
| 0.4465046296296296 | 49.925 |
| 0.44651620370370365 | 49.921 |
| 0.4465277777777778 | 49.916 |
| 0.44653935185185184 | 49.912 |
| 0.44655092592592593 | 49.911 |
| 0.4465625 | 49.908 |
| 0.44657407407407407 | 49.907 |
| 0.4465856481481481 | 49.906 |
| 0.44659722222222226 | 49.907 |
| 0.4466087962962963 | 49.907 |
| 0.4466203703703704 | 49.903 |
| 0.44663194444444443 | 49.903 |
| 0.4466435185185185 | 49.902 |
| 0.44665509259259256 | 49.903 |
| 0.4466666666666667 | 49.901 |
| 0.44667824074074075 | 49.904 |
| 0.44668981481481485 | 49.905 |
| 0.4467013888888889 | 49.906 |
| 0.446712962962963 | 49.908 |
| 0.446724537037037 | 49.911 |
| 0.44673611111111106 | 49.913 |
| 0.4467476851851852 | 49.913 |
| 0.44675925925925924 | 49.913 |
| 0.44677083333333334 | 49.911 |
| 0.4467824074074074 | 49.91 |
| 0.4467939814814815 | 49.912 |
| 0.4468055555555555 | 49.909 |
| 0.44681712962962966 | 49.912 |
| 0.4468287037037037 | 49.91 |
| 0.4468402777777778 | 49.91 |
| 0.44685185185185183 | 49.91 |
| 0.44686342592592593 | 49.911 |
| 0.44687499999999997 | 49.91 |
| 0.4468865740740741 | 49.912 |
| 0.44689814814814816 | 49.912 |
| 0.44690972222222225 | 49.915 |
| 0.4469212962962963 | 49.914 |
| 0.4469328703703704 | 49.916 |
| 0.4469444444444444 | 49.916 |
| 0.44695601851851857 | 49.915 |
| 0.4469675925925926 | 49.914 |
| 0.44697916666666665 | 49.916 |
| 0.44699074074074074 | 49.919 |
| 0.4470023148148148 | 49.922 |
| 0.4470138888888889 | 49.922 |
| 0.4470254629629629 | 49.918 |
| 0.44703703703703707 | 49.916 |
| 0.4470486111111111 | 49.913 |
| 0.4470601851851852 | 49.91 |
| 0.44707175925925924 | 49.91 |
| 0.44708333333333333 | 49.908 |
| 0.44709490740740737 | 49.908 |
| 0.4471064814814815 | 49.909 |
| 0.44711805555555556 | 49.906 |
| 0.44712962962962965 | 49.904 |
| 0.4471412037037037 | 49.9 |
| 0.4471527777777778 | 49.897 |
| 0.4471643518518518 | 49.895 |
| 0.447175925925926 | 49.894 |
| 0.4471875 | 49.893 |
| 0.4471990740740741 | 49.892 |
| 0.44721064814814815 | 49.89 |
| 0.4472222222222222 | 49.888 |
| 0.4472337962962963 | 49.885 |
| 0.4472453703703703 | 49.885 |
| 0.44725694444444447 | 49.887 |
| 0.4472685185185185 | 49.885 |
| 0.4472800925925926 | 49.888 |
| 0.44729166666666664 | 49.889 |
| 0.44730324074074074 | 49.887 |
| 0.4473148148148148 | 49.887 |
| 0.4473263888888889 | 49.888 |
| 0.44733796296296297 | 49.889 |
| 0.44734953703703706 | 49.891 |
| 0.4473611111111111 | 49.892 |
| 0.4473726851851852 | 49.891 |
| 0.44738425925925923 | 49.89 |
| 0.4473958333333334 | 49.888 |
| 0.4474074074074074 | 49.883 |
| 0.4474189814814815 | 49.887 |
| 0.44743055555555555 | 49.883 |
| 0.44744212962962965 | 49.885 |
| 0.4474537037037037 | 49.885 |
| 0.4474652777777777 | 49.887 |
| 0.4474768518518519 | 49.888 |
| 0.4474884259259259 | 49.888 |
| 0.4475 | 49.888 |
| 0.44751157407407405 | 49.887 |
| 0.44752314814814814 | 49.887 |
| 0.4475347222222222 | 49.886 |
| 0.44754629629629633 | 49.885 |
| 0.44755787037037037 | 49.886 |
| 0.44756944444444446 | 49.885 |
| 0.4475810185185185 | 49.885 |
| 0.4475925925925926 | 49.887 |
| 0.44760416666666664 | 49.887 |
| 0.4476157407407408 | 49.889 |
| 0.4476273148148148 | 49.891 |
| 0.4476388888888889 | 49.893 |
| 0.44765046296296296 | 49.896 |
| 0.44766203703703705 | 49.899 |
| 0.4476736111111111 | 49.903 |
| 0.44768518518518513 | 49.907 |
| 0.4476967592592593 | 49.914 |
| 0.4477083333333333 | 49.919 |
| 0.4477199074074074 | 49.923 |
| 0.44773148148148145 | 49.929 |
| 0.44774305555555555 | 49.93 |
| 0.4477546296296296 | 49.934 |
| 0.44776620370370374 | 49.936 |
| 0.4477777777777778 | 49.937 |
| 0.44778935185185187 | 49.937 |
| 0.4478009259259259 | 49.937 |
| 0.4478125 | 49.936 |
| 0.44782407407407404 | 49.934 |
| 0.4478356481481482 | 49.933 |
| 0.44784722222222223 | 49.93 |
| 0.4478587962962963 | 49.927 |
| 0.44787037037037036 | 49.923 |
| 0.44788194444444446 | 49.921 |
| 0.4478935185185185 | 49.918 |
| 0.44790509259259265 | 49.912 |
| 0.4479166666666667 | 49.907 |
| 0.4479282407407407 | 49.902 |
| 0.4479398148148148 | 49.905 |
| 0.44795138888888886 | 49.902 |
| 0.44796296296296295 | 49.902 |
| 0.447974537037037 | 49.899 |
| 0.44798611111111114 | 49.9 |
| 0.4479976851851852 | 49.902 |
| 0.4480092592592593 | 49.9 |
| 0.4480208333333333 | 49.898 |
| 0.4480324074074074 | 49.899 |
| 0.44804398148148145 | 49.9 |
| 0.4480555555555556 | 49.899 |
| 0.44806712962962963 | 49.898 |
| 0.44807870370370373 | 49.9 |
| 0.44809027777777777 | 49.898 |
| 0.44810185185185186 | 49.901 |
| 0.4481134259259259 | 49.904 |
| 0.44812500000000005 | 49.904 |
| 0.4481365740740741 | 49.904 |
| 0.4481481481481482 | 49.906 |
| 0.4481597222222222 | 49.904 |
| 0.44817129629629626 | 49.9 |
| 0.44818287037037036 | 49.902 |
| 0.4481944444444444 | 49.902 |
| 0.44820601851851855 | 49.899 |
| 0.4482175925925926 | 49.899 |
| 0.4482291666666667 | 49.897 |
| 0.4482407407407407 | 49.897 |
| 0.4482523148148148 | 49.9 |
| 0.44826388888888885 | 49.901 |
| 0.448275462962963 | 49.899 |
| 0.44828703703703704 | 49.9 |
| 0.44829861111111113 | 49.901 |
| 0.4483101851851852 | 49.9 |
| 0.44832175925925927 | 49.9 |
| 0.4483333333333333 | 49.902 |
| 0.44834490740740746 | 49.905 |
| 0.4483564814814815 | 49.907 |
| 0.4483680555555556 | 49.906 |
| 0.44837962962962963 | 49.906 |
| 0.44839120370370367 | 49.91 |
| 0.44840277777777776 | 49.913 |
| 0.4484143518518518 | 49.914 |
| 0.44842592592592595 | 49.915 |
| 0.4484375 | 49.914 |
| 0.4484490740740741 | 49.918 |
| 0.4484606481481481 | 49.922 |
| 0.4484722222222222 | 49.923 |
| 0.44848379629629626 | 49.924 |
| 0.4484953703703704 | 49.927 |
| 0.44850694444444444 | 49.93 |
| 0.44851851851851854 | 49.93 |
| 0.4485300925925926 | 49.933 |
| 0.44854166666666667 | 49.937 |
| 0.4485532407407407 | 49.936 |
| 0.44856481481481486 | 49.937 |
| 0.4485763888888889 | 49.94 |
| 0.448587962962963 | 49.939 |
| 0.44859953703703703 | 49.938 |
| 0.4486111111111111 | 49.942 |
| 0.44862268518518517 | 49.938 |
| 0.4486342592592592 | 49.942 |
| 0.44864583333333335 | 49.942 |
| 0.4486574074074074 | 49.943 |
| 0.4486689814814815 | 49.943 |
| 0.4486805555555555 | 49.943 |
| 0.4486921296296296 | 49.94 |
| 0.44870370370370366 | 49.939 |
| 0.4487152777777778 | 49.936 |
| 0.44872685185185185 | 49.937 |
| 0.44873842592592594 | 49.935 |
| 0.44875 | 49.936 |
| 0.4487615740740741 | 49.937 |
| 0.4487731481481481 | 49.939 |
| 0.44878472222222227 | 49.935 |
| 0.4487962962962963 | 49.936 |
| 0.4488078703703704 | 49.936 |
| 0.44881944444444444 | 49.935 |
| 0.44883101851851853 | 49.934 |
| 0.44884259259259257 | 49.934 |
| 0.4488541666666667 | 49.932 |
| 0.44886574074074076 | 49.928 |
| 0.4488773148148148 | 49.926 |
| 0.4488888888888889 | 49.926 |
| 0.44890046296296293 | 49.927 |
| 0.448912037037037 | 49.93 |
| 0.44892361111111106 | 49.93 |
| 0.4489351851851852 | 49.931 |
| 0.44894675925925925 | 49.93 |
| 0.44895833333333335 | 49.933 |
| 0.4489699074074074 | 49.929 |
| 0.4489814814814815 | 49.925 |
| 0.4489930555555555 | 49.924 |
| 0.44900462962962967 | 49.921 |
| 0.4490162037037037 | 49.918 |
| 0.4490277777777778 | 49.918 |
| 0.44903935185185184 | 49.915 |
| 0.44905092592592594 | 49.917 |
| 0.4490625 | 49.916 |
| 0.4490740740740741 | 49.915 |
| 0.44908564814814816 | 49.92 |
| 0.44909722222222226 | 49.917 |
| 0.4491087962962963 | 49.918 |
| 0.44912037037037034 | 49.918 |
| 0.44913194444444443 | 49.921 |
| 0.44914351851851847 | 49.923 |
| 0.4491550925925926 | 49.92 |
| 0.44916666666666666 | 49.921 |
| 0.44917824074074075 | 49.92 |
| 0.4491898148148148 | 49.921 |
| 0.4492013888888889 | 49.92 |
| 0.4492129629629629 | 49.924 |
| 0.4492245370370371 | 49.927 |
| 0.4492361111111111 | 49.928 |
| 0.4492476851851852 | 49.929 |
| 0.44925925925925925 | 49.93 |
| 0.44927083333333334 | 49.931 |
| 0.4492824074074074 | 49.929 |
| 0.44929398148148153 | 49.929 |
| 0.44930555555555557 | 49.924 |
| 0.44931712962962966 | 49.925 |
| 0.4493287037037037 | 49.92 |
| 0.44934027777777774 | 49.921 |
| 0.44935185185185184 | 49.921 |
| 0.4493634259259259 | 49.919 |
| 0.449375 | 49.918 |
| 0.44938657407407406 | 49.916 |
| 0.44939814814814816 | 49.914 |
| 0.4494097222222222 | 49.911 |
| 0.4494212962962963 | 49.916 |
| 0.44943287037037033 | 49.915 |
| 0.4494444444444445 | 49.914 |
| 0.4494560185185185 | 49.916 |
| 0.4494675925925926 | 49.915 |
| 0.44947916666666665 | 49.918 |
| 0.44949074074074075 | 49.919 |
| 0.4495023148148148 | 49.918 |
| 0.44951388888888894 | 49.917 |
| 0.449525462962963 | 49.918 |
| 0.44953703703703707 | 49.911 |
| 0.4495486111111111 | 49.911 |
| 0.4495601851851852 | 49.912 |
| 0.44957175925925924 | 49.914 |
| 0.4495833333333333 | 49.913 |
| 0.44959490740740743 | 49.913 |
| 0.44960648148148147 | 49.912 |
| 0.44961805555555556 | 49.915 |
| 0.4496296296296296 | 49.914 |
| 0.4496412037037037 | 49.914 |
| 0.44965277777777773 | 49.917 |
| 0.4496643518518519 | 49.917 |
| 0.4496759259259259 | 49.921 |
| 0.4496875 | 49.925 |
| 0.44969907407407406 | 49.927 |
| 0.44971064814814815 | 49.932 |
| 0.4497222222222222 | 49.935 |
| 0.44973379629629634 | 49.935 |
| 0.4497453703703704 | 49.936 |
| 0.4497569444444445 | 49.939 |
| 0.4497685185185185 | 49.936 |
| 0.4497800925925926 | 49.935 |
| 0.44979166666666665 | 49.938 |
| 0.4498032407407408 | 49.936 |
| 0.44981481481481483 | 49.937 |
| 0.4498263888888889 | 49.938 |
| 0.44983796296296297 | 49.935 |
| 0.449849537037037 | 49.932 |
| 0.4498611111111111 | 49.932 |
| 0.44987268518518514 | 49.931 |
| 0.4498842592592593 | 49.931 |
| 0.44989583333333333 | 49.93 |
| 0.4499074074074074 | 49.929 |
| 0.44991898148148146 | 49.931 |
| 0.44993055555555556 | 49.93 |
| 0.4499421296296296 | 49.926 |
| 0.44995370370370374 | 49.925 |
| 0.4499652777777778 | 49.923 |
| 0.4499768518518519 | 49.92 |
| 0.4499884259259259 | 49.913 |
| 0.45 | 49.909 |
| 0.45001157407407405 | 49.904 |
| 0.4500231481481482 | 49.898 |
| 0.45003472222222224 | 49.895 |
| 0.45004629629629633 | 49.891 |
| 0.45005787037037037 | 49.889 |
| 0.4500694444444444 | 49.889 |
| 0.4500810185185185 | 49.889 |
| 0.45009259259259254 | 49.891 |
| 0.4501041666666667 | 49.889 |
| 0.45011574074074073 | 49.888 |
| 0.4501273148148148 | 49.887 |
| 0.45013888888888887 | 49.889 |
| 0.45015046296296296 | 49.887 |
| 0.450162037037037 | 49.891 |
| 0.45017361111111115 | 49.895 |
| 0.4501851851851852 | 49.901 |
| 0.4501967592592593 | 49.904 |
| 0.4502083333333333 | 49.911 |
| 0.4502199074074074 | 49.916 |
| 0.45023148148148145 | 49.922 |
| 0.4502430555555556 | 49.924 |
| 0.45025462962962964 | 49.927 |
| 0.45026620370370374 | 49.931 |
| 0.4502777777777778 | 49.932 |
| 0.4502893518518518 | 49.935 |
| 0.4503009259259259 | 49.935 |
| 0.45031249999999995 | 49.939 |
| 0.4503240740740741 | 49.941 |
| 0.45033564814814814 | 49.941 |
| 0.45034722222222223 | 49.942 |
| 0.45035879629629627 | 49.944 |
| 0.45037037037037037 | 49.943 |
| 0.4503819444444444 | 49.946 |
| 0.45039351851851855 | 49.947 |
| 0.4504050925925926 | 49.944 |
| 0.4504166666666667 | 49.943 |
| 0.4504282407407407 | 49.943 |
| 0.4504398148148148 | 49.94 |
| 0.45045138888888886 | 49.938 |
| 0.450462962962963 | 49.935 |
| 0.45047453703703705 | 49.932 |
| 0.45048611111111114 | 49.936 |
| 0.4504976851851852 | 49.935 |
| 0.4505092592592593 | 49.933 |
| 0.4505208333333333 | 49.931 |
| 0.45053240740740735 | 49.931 |
| 0.4505439814814815 | 49.932 |
| 0.45055555555555554 | 49.934 |
| 0.45056712962962964 | 49.935 |
| 0.4505787037037037 | 49.938 |
| 0.45059027777777777 | 49.939 |
| 0.4506018518518518 | 49.94 |
| 0.45061342592592596 | 49.942 |
| 0.450625 | 49.943 |
| 0.4506365740740741 | 49.944 |
| 0.45064814814814813 | 49.945 |
| 0.4506597222222222 | 49.946 |
| 0.45067129629629626 | 49.945 |
| 0.4506828703703704 | 49.946 |
| 0.45069444444444445 | 49.946 |
| 0.45070601851851855 | 49.942 |
| 0.4507175925925926 | 49.943 |
| 0.4507291666666667 | 49.942 |
| 0.4507407407407407 | 49.945 |
| 0.45075231481481487 | 49.943 |
| 0.4507638888888889 | 49.94 |
| 0.45077546296296295 | 49.937 |
| 0.45078703703703704 | 49.933 |
| 0.4507986111111111 | 49.929 |
| 0.4508101851851852 | 49.926 |
| 0.4508217592592592 | 49.928 |
| 0.45083333333333336 | 49.924 |
| 0.4508449074074074 | 49.921 |
| 0.4508564814814815 | 49.917 |
| 0.45086805555555554 | 49.918 |
| 0.45087962962962963 | 49.919 |
| 0.45089120370370367 | 49.919 |
| 0.4509027777777778 | 49.921 |
| 0.45091435185185186 | 49.924 |
| 0.45092592592592595 | 49.923 |
| 0.4509375 | 49.922 |
| 0.4509490740740741 | 49.923 |
| 0.4509606481481481 | 49.919 |
| 0.4509722222222223 | 49.921 |
| 0.4509837962962963 | 49.92 |
| 0.45099537037037035 | 49.918 |
| 0.45100694444444445 | 49.917 |
| 0.4510185185185185 | 49.913 |
| 0.4510300925925926 | 49.91 |
| 0.4510416666666666 | 49.909 |
| 0.45105324074074077 | 49.906 |
| 0.4510648148148148 | 49.903 |
| 0.4510763888888889 | 49.898 |
| 0.45108796296296294 | 49.897 |
| 0.45109953703703703 | 49.897 |
| 0.4511111111111111 | 49.896 |
| 0.4511226851851852 | 49.896 |
| 0.45113425925925926 | 49.901 |
| 0.45114583333333336 | 49.902 |
| 0.4511574074074074 | 49.903 |
| 0.4511689814814815 | 49.901 |
| 0.45118055555555553 | 49.899 |
| 0.4511921296296297 | 49.898 |
| 0.4512037037037037 | 49.898 |
| 0.4512152777777778 | 49.895 |
| 0.45122685185185185 | 49.898 |
| 0.4512384259259259 | 49.897 |
| 0.45125 | 49.893 |
| 0.451261574074074 | 49.893 |
| 0.4512731481481482 | 49.893 |
| 0.4512847222222222 | 49.894 |
| 0.4512962962962963 | 49.894 |
| 0.45130787037037035 | 49.897 |
| 0.45131944444444444 | 49.898 |
| 0.4513310185185185 | 49.895 |
| 0.45134259259259263 | 49.894 |
| 0.45135416666666667 | 49.893 |
| 0.45136574074074076 | 49.89 |
| 0.4513773148148148 | 49.89 |
| 0.4513888888888889 | 49.886 |
| 0.45140046296296293 | 49.885 |
| 0.4514120370370371 | 49.883 |
| 0.4514236111111111 | 49.883 |
| 0.4514351851851852 | 49.883 |
| 0.45144675925925926 | 49.884 |
| 0.45145833333333335 | 49.882 |
| 0.4514699074074074 | 49.882 |
| 0.45148148148148143 | 49.881 |
| 0.4514930555555556 | 49.884 |
| 0.4515046296296296 | 49.882 |
| 0.4515162037037037 | 49.879 |
| 0.45152777777777775 | 49.878 |
| 0.45153935185185184 | 49.875 |
| 0.4515509259259259 | 49.874 |
| 0.45156250000000003 | 49.871 |
| 0.45157407407407407 | 49.869 |
| 0.45158564814814817 | 49.868 |
| 0.4515972222222222 | 49.87 |
| 0.4516087962962963 | 49.87 |
| 0.45162037037037034 | 49.87 |
| 0.4516319444444445 | 49.87 |
| 0.4516435185185185 | 49.87 |
| 0.4516550925925926 | 49.871 |
| 0.45166666666666666 | 49.872 |
| 0.45167824074074076 | 49.873 |
| 0.4516898148148148 | 49.873 |
| 0.45170138888888894 | 49.873 |
| 0.451712962962963 | 49.874 |
| 0.451724537037037 | 49.872 |
| 0.4517361111111111 | 49.875 |
| 0.45174768518518515 | 49.875 |
| 0.45175925925925925 | 49.875 |
| 0.4517708333333333 | 49.875 |
| 0.45178240740740744 | 49.876 |
| 0.4517939814814815 | 49.879 |
| 0.45180555555555557 | 49.88 |
| 0.4518171296296296 | 49.881 |
| 0.4518287037037037 | 49.88 |
| 0.45184027777777774 | 49.88 |
| 0.4518518518518519 | 49.882 |
| 0.45186342592592593 | 49.882 |
| 0.451875 | 49.881 |
| 0.45188657407407407 | 49.879 |
| 0.45189814814814816 | 49.881 |
| 0.4519097222222222 | 49.879 |
| 0.45192129629629635 | 49.882 |
| 0.4519328703703704 | 49.88 |
| 0.4519444444444444 | 49.881 |
| 0.4519560185185185 | 49.883 |
| 0.45196759259259256 | 49.884 |
| 0.45197916666666665 | 49.885 |
| 0.4519907407407407 | 49.884 |
| 0.45200231481481484 | 49.884 |
| 0.4520138888888889 | 49.888 |
| 0.452025462962963 | 49.889 |
| 0.452037037037037 | 49.893 |
| 0.4520486111111111 | 49.891 |
| 0.45206018518518515 | 49.893 |
| 0.4520717592592593 | 49.892 |
| 0.45208333333333334 | 49.894 |
| 0.45209490740740743 | 49.894 |
| 0.45210648148148147 | 49.893 |
| 0.45211805555555556 | 49.891 |
| 0.4521296296296296 | 49.888 |
| 0.45214120370370375 | 49.886 |
| 0.4521527777777778 | 49.884 |
| 0.4521643518518519 | 49.883 |
| 0.4521759259259259 | 49.882 |
| 0.45218749999999996 | 49.881 |
| 0.45219907407407406 | 49.88 |
| 0.4522106481481481 | 49.879 |
| 0.45222222222222225 | 49.878 |
| 0.4522337962962963 | 49.877 |
| 0.4522453703703704 | 49.88 |
| 0.4522569444444444 | 49.881 |
| 0.4522685185185185 | 49.881 |
| 0.45228009259259255 | 49.881 |
| 0.4522916666666667 | 49.879 |
| 0.45230324074074074 | 49.876 |
| 0.45231481481481484 | 49.874 |
| 0.4523263888888889 | 49.874 |
| 0.45233796296296297 | 49.873 |
| 0.452349537037037 | 49.87 |
| 0.45236111111111116 | 49.87 |
| 0.4523726851851852 | 49.872 |
| 0.4523842592592593 | 49.876 |
| 0.45239583333333333 | 49.878 |
| 0.4524074074074074 | 49.878 |
| 0.45241898148148146 | 49.881 |
| 0.4524305555555555 | 49.881 |
| 0.45244212962962965 | 49.881 |
| 0.4524537037037037 | 49.881 |
| 0.4524652777777778 | 49.883 |
| 0.4524768518518518 | 49.881 |
| 0.4524884259259259 | 49.88 |
| 0.45249999999999996 | 49.881 |
| 0.4525115740740741 | 49.879 |
| 0.45252314814814815 | 49.879 |
| 0.45253472222222224 | 49.879 |
| 0.4525462962962963 | 49.881 |
| 0.4525578703703704 | 49.884 |
| 0.4525694444444444 | 49.885 |
| 0.45258101851851856 | 49.889 |
| 0.4525925925925926 | 49.89 |
| 0.4526041666666667 | 49.894 |
| 0.45261574074074074 | 49.897 |
| 0.45262731481481483 | 49.896 |
| 0.45263888888888887 | 49.899 |
| 0.452650462962963 | 49.896 |
| 0.45266203703703706 | 49.897 |
| 0.4526736111111111 | 49.894 |
| 0.4526851851851852 | 49.895 |
| 0.45269675925925923 | 49.895 |
| 0.4527083333333333 | 49.892 |
| 0.45271990740740736 | 49.895 |
| 0.4527314814814815 | 49.894 |
| 0.45274305555555555 | 49.892 |
| 0.45275462962962965 | 49.89 |
| 0.4527662037037037 | 49.89 |
| 0.4527777777777778 | 49.888 |
| 0.4527893518518518 | 49.887 |
| 0.45280092592592597 | 49.884 |
| 0.4528125 | 49.881 |
| 0.4528240740740741 | 49.88 |
| 0.45283564814814814 | 49.88 |
| 0.45284722222222223 | 49.882 |
| 0.4528587962962963 | 49.885 |
| 0.4528703703703704 | 49.887 |
| 0.45288194444444446 | 49.889 |
| 0.4528935185185185 | 49.888 |
| 0.4529050925925926 | 49.887 |
| 0.45291666666666663 | 49.887 |
| 0.45292824074074073 | 49.884 |
| 0.45293981481481477 | 49.887 |
| 0.4529513888888889 | 49.888 |
| 0.45296296296296296 | 49.891 |
| 0.45297453703703705 | 49.89 |
| 0.4529861111111111 | 49.887 |
| 0.4529976851851852 | 49.888 |
| 0.4530092592592592 | 49.885 |
| 0.4530208333333334 | 49.884 |
| 0.4530324074074074 | 49.883 |
| 0.4530439814814815 | 49.879 |
| 0.45305555555555554 | 49.878 |
| 0.45306712962962964 | 49.872 |
| 0.4530787037037037 | 49.87 |
| 0.45309027777777783 | 49.87 |
| 0.45310185185185187 | 49.87 |
| 0.45311342592592596 | 49.868 |
| 0.453125 | 49.87 |
| 0.45313657407407404 | 49.867 |
| 0.45314814814814813 | 49.869 |
| 0.45315972222222217 | 49.867 |
| 0.4531712962962963 | 49.866 |
| 0.45318287037037036 | 49.872 |
| 0.45319444444444446 | 49.871 |
| 0.4532060185185185 | 49.872 |
| 0.4532175925925926 | 49.873 |
| 0.4532291666666666 | 49.873 |
| 0.4532407407407408 | 49.874 |
| 0.4532523148148148 | 49.874 |
| 0.4532638888888889 | 49.873 |
| 0.45327546296296295 | 49.872 |
| 0.45328703703703704 | 49.87 |
| 0.4532986111111111 | 49.868 |
| 0.45331018518518523 | 49.864 |
| 0.45332175925925927 | 49.864 |
| 0.45333333333333337 | 49.863 |
| 0.4533449074074074 | 49.863 |
| 0.4533564814814815 | 49.863 |
| 0.45336805555555554 | 49.865 |
| 0.4533796296296296 | 49.87 |
| 0.4533912037037037 | 49.871 |
| 0.45340277777777777 | 49.872 |
| 0.45341435185185186 | 49.871 |
| 0.4534259259259259 | 49.869 |
| 0.4534375 | 49.87 |
| 0.45344907407407403 | 49.867 |
| 0.4534606481481482 | 49.866 |
| 0.4534722222222222 | 49.866 |
| 0.4534837962962963 | 49.863 |
| 0.45349537037037035 | 49.861 |
| 0.45350694444444445 | 49.861 |
| 0.4535185185185185 | 49.86 |
| 0.45353009259259264 | 49.859 |
| 0.4535416666666667 | 49.859 |
| 0.45355324074074077 | 49.857 |
| 0.4535648148148148 | 49.856 |
| 0.4535763888888889 | 49.853 |
| 0.45358796296296294 | 49.853 |
| 0.453599537037037 | 49.855 |
| 0.45361111111111113 | 49.853 |
| 0.45362268518518517 | 49.855 |
| 0.45363425925925926 | 49.858 |
| 0.4536458333333333 | 49.857 |
| 0.4536574074074074 | 49.859 |
| 0.45366898148148144 | 49.862 |
| 0.4536805555555556 | 49.863 |
| 0.4536921296296296 | 49.867 |
| 0.4537037037037037 | 49.87 |
| 0.45371527777777776 | 49.873 |
| 0.45372685185185185 | 49.876 |
| 0.4537384259259259 | 49.875 |
| 0.45375000000000004 | 49.875 |
| 0.4537615740740741 | 49.877 |
| 0.4537731481481482 | 49.878 |
| 0.4537847222222222 | 49.88 |
| 0.4537962962962963 | 49.88 |
| 0.45380787037037035 | 49.881 |
| 0.4538194444444445 | 49.88 |
| 0.45383101851851854 | 49.881 |
| 0.4538425925925926 | 49.881 |
| 0.45385416666666667 | 49.88 |
| 0.4538657407407407 | 49.882 |
| 0.4538773148148148 | 49.882 |
| 0.45388888888888884 | 49.884 |
| 0.453900462962963 | 49.886 |
| 0.45391203703703703 | 49.887 |
| 0.4539236111111111 | 49.889 |
| 0.45393518518518516 | 49.886 |
| 0.45394675925925926 | 49.887 |
| 0.4539583333333333 | 49.889 |
| 0.45396990740740745 | 49.889 |
| 0.4539814814814815 | 49.893 |
| 0.4539930555555556 | 49.895 |
| 0.4540046296296296 | 49.898 |
| 0.4540162037037037 | 49.898 |
| 0.45402777777777775 | 49.901 |
| 0.4540393518518519 | 49.901 |
| 0.45405092592592594 | 49.904 |
| 0.45406250000000004 | 49.905 |
| 0.4540740740740741 | 49.907 |
| 0.4540856481481481 | 49.906 |
| 0.4540972222222222 | 49.91 |
| 0.45410879629629625 | 49.912 |
| 0.4541203703703704 | 49.913 |
| 0.45413194444444444 | 49.912 |
| 0.45414351851851853 | 49.91 |
| 0.45415509259259257 | 49.907 |
| 0.45416666666666666 | 49.903 |
| 0.4541782407407407 | 49.898 |
| 0.45418981481481485 | 49.899 |
| 0.4542013888888889 | 49.897 |
| 0.454212962962963 | 49.895 |
| 0.454224537037037 | 49.891 |
| 0.4542361111111111 | 49.891 |
| 0.45424768518518516 | 49.887 |
| 0.4542592592592593 | 49.885 |
| 0.45427083333333335 | 49.882 |
| 0.45428240740740744 | 49.88 |
| 0.4542939814814815 | 49.875 |
| 0.4543055555555556 | 49.871 |
| 0.4543171296296296 | 49.869 |
| 0.45432870370370365 | 49.866 |
| 0.4543402777777778 | 49.867 |
| 0.45435185185185184 | 49.862 |
| 0.45436342592592593 | 49.862 |
| 0.454375 | 49.86 |
| 0.45438657407407407 | 49.861 |
| 0.4543981481481481 | 49.863 |
| 0.45440972222222226 | 49.861 |
| 0.4544212962962963 | 49.861 |
| 0.4544328703703704 | 49.861 |
| 0.45444444444444443 | 49.858 |
| 0.4544560185185185 | 49.86 |
| 0.45446759259259256 | 49.864 |
| 0.4544791666666667 | 49.864 |
| 0.45449074074074075 | 49.868 |
| 0.45450231481481485 | 49.874 |
| 0.4545138888888889 | 49.878 |
| 0.454525462962963 | 49.882 |
| 0.454537037037037 | 49.886 |
| 0.45454861111111106 | 49.89 |
| 0.4545601851851852 | 49.892 |
| 0.45457175925925924 | 49.894 |
| 0.45458333333333334 | 49.897 |
| 0.4545949074074074 | 49.898 |
| 0.4546064814814815 | 49.901 |
| 0.4546180555555555 | 49.906 |
| 0.45462962962962966 | 49.907 |
| 0.4546412037037037 | 49.911 |
| 0.4546527777777778 | 49.912 |
| 0.45466435185185183 | 49.913 |
| 0.45467592592592593 | 49.915 |
| 0.45468749999999997 | 49.917 |
| 0.4546990740740741 | 49.919 |
| 0.45471064814814816 | 49.921 |
| 0.45472222222222225 | 49.923 |
| 0.4547337962962963 | 49.923 |
| 0.4547453703703704 | 49.922 |
| 0.4547569444444444 | 49.92 |
| 0.45476851851851857 | 49.919 |
| 0.4547800925925926 | 49.915 |
| 0.45479166666666665 | 49.913 |
| 0.45480324074074074 | 49.91 |
| 0.4548148148148148 | 49.908 |
| 0.4548263888888889 | 49.905 |
| 0.4548379629629629 | 49.903 |
| 0.45484953703703707 | 49.901 |
| 0.4548611111111111 | 49.9 |
| 0.4548726851851852 | 49.899 |
| 0.45488425925925924 | 49.897 |
| 0.45489583333333333 | 49.895 |
| 0.45490740740740737 | 49.894 |
| 0.4549189814814815 | 49.893 |
| 0.45493055555555556 | 49.892 |
| 0.45494212962962965 | 49.89 |
| 0.4549537037037037 | 49.888 |
| 0.4549652777777778 | 49.886 |
| 0.4549768518518518 | 49.883 |
| 0.454988425925926 | 49.882 |
| 0.455 | 49.88 |
| 0.4550115740740741 | 49.88 |
| 0.45502314814814815 | 49.878 |
| 0.4550347222222222 | 49.877 |
| 0.4550462962962963 | 49.874 |
| 0.4550578703703703 | 49.874 |
| 0.45506944444444447 | 49.874 |
| 0.4550810185185185 | 49.872 |
| 0.4550925925925926 | 49.871 |
| 0.45510416666666664 | 49.872 |
| 0.45511574074074074 | 49.87 |
| 0.4551273148148148 | 49.867 |
| 0.4551388888888889 | 49.866 |
| 0.45515046296296297 | 49.865 |
| 0.45516203703703706 | 49.863 |
| 0.4551736111111111 | 49.861 |
| 0.4551851851851852 | 49.862 |
| 0.45519675925925923 | 49.86 |
| 0.4552083333333334 | 49.86 |
| 0.4552199074074074 | 49.861 |
| 0.4552314814814815 | 49.862 |
| 0.45524305555555555 | 49.863 |
| 0.45525462962962965 | 49.866 |
| 0.4552662037037037 | 49.867 |
| 0.4552777777777777 | 49.868 |
| 0.4552893518518519 | 49.867 |
| 0.4553009259259259 | 49.868 |
| 0.4553125 | 49.868 |
| 0.45532407407407405 | 49.867 |
| 0.45533564814814814 | 49.865 |
| 0.4553472222222222 | 49.865 |
| 0.45535879629629633 | 49.864 |
| 0.45537037037037037 | 49.863 |
| 0.45538194444444446 | 49.861 |
| 0.4553935185185185 | 49.857 |
| 0.4554050925925926 | 49.854 |
| 0.45541666666666664 | 49.852 |
| 0.4554282407407408 | 49.849 |
| 0.4554398148148148 | 49.848 |
| 0.4554513888888889 | 49.845 |
| 0.45546296296296296 | 49.846 |
| 0.45547453703703705 | 49.845 |
| 0.4554861111111111 | 49.844 |
| 0.45549768518518513 | 49.844 |
| 0.4555092592592593 | 49.841 |
| 0.4555208333333333 | 49.84 |
| 0.4555324074074074 | 49.836 |
| 0.45554398148148145 | 49.833 |
| 0.45555555555555555 | 49.829 |
| 0.4555671296296296 | 49.824 |
| 0.45557870370370374 | 49.819 |
| 0.4555902777777778 | 49.813 |
| 0.45560185185185187 | 49.807 |
| 0.4556134259259259 | 49.803 |
| 0.455625 | 49.798 |
| 0.45563657407407404 | 49.797 |
| 0.4556481481481482 | 49.796 |
| 0.45565972222222223 | 49.797 |
| 0.4556712962962963 | 49.797 |
| 0.45568287037037036 | 49.802 |
| 0.45569444444444446 | 49.803 |
| 0.4557060185185185 | 49.805 |
| 0.45571759259259265 | 49.806 |
| 0.4557291666666667 | 49.808 |
| 0.4557407407407407 | 49.812 |
| 0.4557523148148148 | 49.815 |
| 0.45576388888888886 | 49.818 |
| 0.45577546296296295 | 49.819 |
| 0.455787037037037 | 49.822 |
| 0.45579861111111114 | 49.824 |
| 0.4558101851851852 | 49.824 |
| 0.4558217592592593 | 49.827 |
| 0.4558333333333333 | 49.829 |
| 0.4558449074074074 | 49.832 |
| 0.45585648148148145 | 49.833 |
| 0.4558680555555556 | 49.832 |
| 0.45587962962962963 | 49.832 |
| 0.45589120370370373 | 49.832 |
| 0.45590277777777777 | 49.831 |
| 0.45591435185185186 | 49.829 |
| 0.4559259259259259 | 49.827 |
| 0.45593750000000005 | 49.828 |
| 0.4559490740740741 | 49.829 |
| 0.4559606481481482 | 49.828 |
| 0.4559722222222222 | 49.83 |
| 0.45598379629629626 | 49.832 |
| 0.45599537037037036 | 49.833 |
| 0.4560069444444444 | 49.835 |
| 0.45601851851851855 | 49.837 |
| 0.4560300925925926 | 49.838 |
| 0.4560416666666667 | 49.841 |
| 0.4560532407407407 | 49.842 |
| 0.4560648148148148 | 49.841 |
| 0.45607638888888885 | 49.841 |
| 0.456087962962963 | 49.84 |
| 0.45609953703703704 | 49.84 |
| 0.45611111111111113 | 49.839 |
| 0.4561226851851852 | 49.84 |
| 0.45613425925925927 | 49.84 |
| 0.4561458333333333 | 49.839 |
| 0.45615740740740746 | 49.839 |
| 0.4561689814814815 | 49.837 |
| 0.4561805555555556 | 49.835 |
| 0.45619212962962963 | 49.835 |
| 0.45620370370370367 | 49.834 |
| 0.45621527777777776 | 49.832 |
| 0.4562268518518518 | 49.83 |
| 0.45623842592592595 | 49.827 |
| 0.45625 | 49.825 |
| 0.4562615740740741 | 49.821 |
| 0.4562731481481481 | 49.817 |
| 0.4562847222222222 | 49.814 |
| 0.45629629629629626 | 49.813 |
| 0.4563078703703704 | 49.813 |
| 0.45631944444444444 | 49.81 |
| 0.45633101851851854 | 49.808 |
| 0.4563425925925926 | 49.805 |
| 0.45635416666666667 | 49.804 |
| 0.4563657407407407 | 49.802 |
| 0.45637731481481486 | 49.801 |
| 0.4563888888888889 | 49.801 |
| 0.456400462962963 | 49.8 |
| 0.45641203703703703 | 49.8 |
| 0.4564236111111111 | 49.798 |
| 0.45643518518518517 | 49.797 |
| 0.4564467592592592 | 49.796 |
| 0.45645833333333335 | 49.797 |
| 0.4564699074074074 | 49.796 |
| 0.4564814814814815 | 49.796 |
| 0.4564930555555555 | 49.798 |
| 0.4565046296296296 | 49.801 |
| 0.45651620370370366 | 49.802 |
| 0.4565277777777778 | 49.804 |
| 0.45653935185185185 | 49.805 |
| 0.45655092592592594 | 49.807 |
| 0.4565625 | 49.808 |
| 0.4565740740740741 | 49.808 |
| 0.4565856481481481 | 49.809 |
| 0.45659722222222227 | 49.809 |
| 0.4566087962962963 | 49.812 |
| 0.4566203703703704 | 49.812 |
| 0.45663194444444444 | 49.814 |
| 0.45664351851851853 | 49.814 |
| 0.45665509259259257 | 49.816 |
| 0.4566666666666667 | 49.816 |
| 0.45667824074074076 | 49.815 |
| 0.4566898148148148 | 49.815 |
| 0.4567013888888889 | 49.819 |
| 0.45671296296296293 | 49.821 |
| 0.456724537037037 | 49.824 |
| 0.45673611111111106 | 49.828 |
| 0.4567476851851852 | 49.832 |
| 0.45675925925925925 | 49.835 |
| 0.45677083333333335 | 49.836 |
| 0.4567824074074074 | 49.838 |
| 0.4567939814814815 | 49.839 |
| 0.4568055555555555 | 49.841 |
| 0.45681712962962967 | 49.842 |
| 0.4568287037037037 | 49.844 |
| 0.4568402777777778 | 49.844 |
| 0.45685185185185184 | 49.842 |
| 0.45686342592592594 | 49.841 |
| 0.456875 | 49.84 |
| 0.4568865740740741 | 49.838 |
| 0.45689814814814816 | 49.837 |
| 0.45690972222222226 | 49.837 |
| 0.4569212962962963 | 49.837 |
| 0.45693287037037034 | 49.839 |
| 0.45694444444444443 | 49.84 |
| 0.45695601851851847 | 49.843 |
| 0.4569675925925926 | 49.845 |
| 0.45697916666666666 | 49.847 |
| 0.45699074074074075 | 49.849 |
| 0.4570023148148148 | 49.851 |
| 0.4570138888888889 | 49.855 |
| 0.4570254629629629 | 49.855 |
| 0.4570370370370371 | 49.857 |
| 0.4570486111111111 | 49.858 |
| 0.4570601851851852 | 49.86 |
| 0.45707175925925925 | 49.861 |
| 0.45708333333333334 | 49.862 |
| 0.4570949074074074 | 49.86 |
| 0.45710648148148153 | 49.86 |
| 0.45711805555555557 | 49.859 |
| 0.45712962962962966 | 49.86 |
| 0.4571412037037037 | 49.858 |
| 0.45715277777777774 | 49.857 |
| 0.45716435185185184 | 49.854 |
| 0.4571759259259259 | 49.854 |
| 0.4571875 | 49.854 |
| 0.45719907407407406 | 49.853 |
| 0.45721064814814816 | 49.852 |
| 0.4572222222222222 | 49.85 |
| 0.4572337962962963 | 49.85 |
| 0.45724537037037033 | 49.852 |
| 0.4572569444444445 | 49.856 |
| 0.4572685185185185 | 49.859 |
| 0.4572800925925926 | 49.864 |
| 0.45729166666666665 | 49.869 |
| 0.45730324074074075 | 49.873 |
| 0.4573148148148148 | 49.876 |
| 0.45732638888888894 | 49.878 |
| 0.457337962962963 | 49.881 |
| 0.45734953703703707 | 49.884 |
| 0.4573611111111111 | 49.885 |
| 0.4573726851851852 | 49.886 |
| 0.45738425925925924 | 49.886 |
| 0.4573958333333333 | 49.886 |
| 0.45740740740740743 | 49.886 |
| 0.45741898148148147 | 49.887 |
| 0.45743055555555556 | 49.889 |
| 0.4574421296296296 | 49.89 |
| 0.4574537037037037 | 49.891 |
| 0.45746527777777773 | 49.892 |
| 0.4574768518518519 | 49.894 |
| 0.4574884259259259 | 49.895 |
| 0.4575 | 49.898 |
| 0.45751157407407406 | 49.901 |
| 0.45752314814814815 | 49.904 |
| 0.4575347222222222 | 49.906 |
| 0.45754629629629634 | 49.906 |
| 0.4575578703703704 | 49.907 |
| 0.4575694444444445 | 49.905 |
| 0.4575810185185185 | 49.903 |
| 0.4575925925925926 | 49.9 |
| 0.45760416666666665 | 49.899 |
| 0.4576157407407408 | 49.898 |
| 0.45762731481481483 | 49.897 |
| 0.4576388888888889 | 49.896 |
| 0.45765046296296297 | 49.894 |
| 0.457662037037037 | 49.892 |
| 0.4576736111111111 | 49.889 |
| 0.45768518518518514 | 49.89 |
| 0.4576967592592593 | 49.888 |
| 0.45770833333333333 | 49.886 |
| 0.4577199074074074 | 49.885 |
| 0.45773148148148146 | 49.884 |
| 0.45774305555555556 | 49.884 |
| 0.4577546296296296 | 49.883 |
| 0.45776620370370374 | 49.883 |
| 0.4577777777777778 | 49.884 |
| 0.4577893518518519 | 49.885 |
| 0.4578009259259259 | 49.887 |
| 0.4578125 | 49.891 |
| 0.45782407407407405 | 49.895 |
| 0.4578356481481482 | 49.898 |
| 0.45784722222222224 | 49.9 |
| 0.45785879629629633 | 49.899 |
| 0.45787037037037037 | 49.899 |
| 0.4578819444444444 | 49.898 |
| 0.4578935185185185 | 49.9 |
| 0.45790509259259254 | 49.907 |
| 0.4579166666666667 | 49.904 |
| 0.45792824074074073 | 49.906 |
| 0.4579398148148148 | 49.908 |
| 0.45795138888888887 | 49.908 |
| 0.45796296296296296 | 49.907 |
| 0.457974537037037 | 49.905 |
| 0.45798611111111115 | 49.902 |
| 0.4579976851851852 | 49.899 |
| 0.4580092592592593 | 49.895 |
| 0.4580208333333333 | 49.893 |
| 0.4580324074074074 | 49.893 |
| 0.45804398148148145 | 49.892 |
| 0.4580555555555556 | 49.893 |
| 0.45806712962962964 | 49.896 |
| 0.45807870370370374 | 49.898 |
| 0.4580902777777778 | 49.901 |
| 0.4581018518518518 | 49.904 |
| 0.4581134259259259 | 49.905 |
| 0.45812499999999995 | 49.905 |
| 0.4581365740740741 | 49.906 |
| 0.45814814814814814 | 49.909 |
| 0.45815972222222223 | 49.909 |
| 0.45817129629629627 | 49.911 |
| 0.45818287037037037 | 49.91 |
| 0.4581944444444444 | 49.91 |
| 0.45820601851851855 | 49.911 |
| 0.4582175925925926 | 49.911 |
| 0.4582291666666667 | 49.913 |
| 0.4582407407407407 | 49.914 |
| 0.4582523148148148 | 49.918 |
| 0.45826388888888886 | 49.922 |
| 0.458275462962963 | 49.925 |
| 0.45828703703703705 | 49.927 |
| 0.45829861111111114 | 49.93 |
| 0.4583101851851852 | 49.931 |
| 0.4583217592592593 | 49.931 |
| 0.4583333333333333 | 49.93 |
| 0.45834490740740735 | 49.927 |
| 0.4583564814814815 | 49.923 |
| 0.45836805555555554 | 49.919 |
| 0.45837962962962964 | 49.917 |
| 0.4583912037037037 | 49.915 |
| 0.45840277777777777 | 49.913 |
| 0.4584143518518518 | 49.913 |
| 0.45842592592592596 | 49.914 |
| 0.4584375 | 49.914 |
| 0.4584490740740741 | 49.913 |
| 0.45846064814814813 | 49.914 |
| 0.4584722222222222 | 49.914 |
| 0.45848379629629626 | 49.911 |
| 0.4584953703703704 | 49.909 |
| 0.45850694444444445 | 49.906 |
| 0.45851851851851855 | 49.905 |
| 0.4585300925925926 | 49.905 |
| 0.4585416666666667 | 49.908 |
| 0.4585532407407407 | 49.91 |
| 0.45856481481481487 | 49.914 |
| 0.4585763888888889 | 49.917 |
| 0.45858796296296295 | 49.92 |
| 0.45859953703703704 | 49.925 |
| 0.4586111111111111 | 49.929 |
| 0.4586226851851852 | 49.934 |
| 0.4586342592592592 | 49.94 |
| 0.45864583333333336 | 49.943 |
| 0.4586574074074074 | 49.946 |
| 0.4586689814814815 | 49.948 |
| 0.45868055555555554 | 49.95 |
| 0.45869212962962963 | 49.956 |
| 0.45870370370370367 | 49.96 |
| 0.4587152777777778 | 49.961 |
| 0.45872685185185186 | 49.963 |
| 0.45873842592592595 | 49.967 |
| 0.45875 | 49.971 |
| 0.4587615740740741 | 49.974 |
| 0.4587731481481481 | 49.975 |
| 0.4587847222222223 | 49.977 |
| 0.4587962962962963 | 49.978 |
| 0.45880787037037035 | 49.979 |
| 0.45881944444444445 | 49.98 |
| 0.4588310185185185 | 49.982 |
| 0.4588425925925926 | 49.982 |
| 0.4588541666666666 | 49.983 |
| 0.45886574074074077 | 49.983 |
| 0.4588773148148148 | 49.983 |
| 0.4588888888888889 | 49.986 |
| 0.45890046296296294 | 49.988 |
| 0.45891203703703703 | 49.991 |
| 0.4589236111111111 | 49.993 |
| 0.4589351851851852 | 49.992 |
| 0.45894675925925926 | 49.993 |
| 0.45895833333333336 | 49.993 |
| 0.4589699074074074 | 49.993 |
| 0.4589814814814815 | 49.991 |
| 0.45899305555555553 | 49.99 |
| 0.4590046296296297 | 49.989 |
| 0.4590162037037037 | 49.988 |
| 0.4590277777777778 | 49.988 |
| 0.45903935185185185 | 49.989 |
| 0.4590509259259259 | 49.989 |
| 0.4590625 | 49.993 |
| 0.459074074074074 | 49.998 |
| 0.4590856481481482 | 50.004 |
| 0.4590972222222222 | 50.008 |
| 0.4591087962962963 | 50.01 |
| 0.45912037037037035 | 50.013 |
| 0.45913194444444444 | 50.016 |
| 0.4591435185185185 | 50.019 |
| 0.45915509259259263 | 50.022 |
| 0.45916666666666667 | 50.025 |
| 0.45917824074074076 | 50.026 |
| 0.4591898148148148 | 50.025 |
| 0.4592013888888889 | 50.028 |
| 0.45921296296296293 | 50.029 |
| 0.4592245370370371 | 50.03 |
| 0.4592361111111111 | 50.032 |
| 0.4592476851851852 | 50.035 |
| 0.45925925925925926 | 50.04 |
| 0.45927083333333335 | 50.043 |
| 0.4592824074074074 | 50.045 |
| 0.45929398148148143 | 50.044 |
| 0.4593055555555556 | 50.044 |
| 0.4593171296296296 | 50.045 |
| 0.4593287037037037 | 50.047 |
| 0.45934027777777775 | 50.048 |
| 0.45935185185185184 | 50.05 |
| 0.4593634259259259 | 50.051 |
| 0.45937500000000003 | 50.051 |
| 0.45938657407407407 | 50.053 |
| 0.45939814814814817 | 50.054 |
| 0.4594097222222222 | 50.054 |
| 0.4594212962962963 | 50.053 |
| 0.45943287037037034 | 50.056 |
| 0.4594444444444445 | 50.054 |
| 0.4594560185185185 | 50.053 |
| 0.4594675925925926 | 50.052 |
| 0.45947916666666666 | 50.053 |
| 0.45949074074074076 | 50.051 |
| 0.4595023148148148 | 50.051 |
| 0.45951388888888894 | 50.051 |
| 0.459525462962963 | 50.051 |
| 0.459537037037037 | 50.05 |
| 0.4595486111111111 | 50.05 |
| 0.45956018518518515 | 50.049 |
| 0.45957175925925925 | 50.049 |
| 0.4595833333333333 | 50.049 |
| 0.45959490740740744 | 50.049 |
| 0.4596064814814815 | 50.049 |
| 0.45961805555555557 | 50.05 |
| 0.4596296296296296 | 50.051 |
| 0.4596412037037037 | 50.051 |
| 0.45965277777777774 | 50.053 |
| 0.4596643518518519 | 50.055 |
| 0.45967592592592593 | 50.058 |
| 0.4596875 | 50.06 |
| 0.45969907407407407 | 50.062 |
| 0.45971064814814816 | 50.062 |
| 0.4597222222222222 | 50.062 |
| 0.45973379629629635 | 50.063 |
| 0.4597453703703704 | 50.063 |
| 0.4597569444444444 | 50.062 |
| 0.4597685185185185 | 50.059 |
| 0.45978009259259256 | 50.057 |
| 0.45979166666666665 | 50.056 |
| 0.4598032407407407 | 50.055 |
| 0.45981481481481484 | 50.054 |
| 0.4598263888888889 | 50.054 |
| 0.459837962962963 | 50.055 |
| 0.459849537037037 | 50.055 |
| 0.4598611111111111 | 50.056 |
| 0.45987268518518515 | 50.055 |
| 0.4598842592592593 | 50.055 |
| 0.45989583333333334 | 50.055 |
| 0.45990740740740743 | 50.057 |
| 0.45991898148148147 | 50.057 |
| 0.45993055555555556 | 50.057 |
| 0.4599421296296296 | 50.058 |
| 0.45995370370370375 | 50.06 |
| 0.4599652777777778 | 50.063 |
| 0.4599768518518519 | 50.065 |
| 0.4599884259259259 | 50.066 |
| 0.45999999999999996 | 50.066 |
| 0.46001157407407406 | 50.068 |
| 0.4600231481481481 | 50.07 |
| 0.46003472222222225 | 50.071 |
| 0.4600462962962963 | 50.072 |
| 0.4600578703703704 | 50.071 |
| 0.4600694444444444 | 50.07 |
| 0.4600810185185185 | 50.07 |
| 0.46009259259259255 | 50.069 |
| 0.4601041666666667 | 50.069 |
| 0.46011574074074074 | 50.069 |
| 0.46012731481481484 | 50.07 |
| 0.4601388888888889 | 50.068 |
| 0.46015046296296297 | 50.065 |
| 0.460162037037037 | 50.066 |
| 0.46017361111111116 | 50.065 |
| 0.4601851851851852 | 50.066 |
| 0.4601967592592593 | 50.066 |
| 0.46020833333333333 | 50.066 |
| 0.4602199074074074 | 50.065 |
| 0.46023148148148146 | 50.066 |
| 0.4602430555555555 | 50.068 |
| 0.46025462962962965 | 50.069 |
| 0.4602662037037037 | 50.07 |
| 0.4602777777777778 | 50.071 |
| 0.4602893518518518 | 50.07 |
| 0.4603009259259259 | 50.07 |
| 0.46031249999999996 | 50.07 |
| 0.4603240740740741 | 50.07 |
| 0.46033564814814815 | 50.072 |
| 0.46034722222222224 | 50.074 |
| 0.4603587962962963 | 50.076 |
| 0.4603703703703704 | 50.079 |
| 0.4603819444444444 | 50.078 |
| 0.46039351851851856 | 50.076 |
| 0.4604050925925926 | 50.072 |
| 0.4604166666666667 | 50.067 |
| 0.46042824074074074 | 50.062 |
| 0.46043981481481483 | 50.054 |
| 0.46045138888888887 | 50.045 |
| 0.460462962962963 | 50.038 |
| 0.46047453703703706 | 50.03 |
| 0.4604861111111111 | 50.021 |
| 0.4604976851851852 | 50.012 |
| 0.46050925925925923 | 50.005 |
| 0.4605208333333333 | 49.995 |
| 0.46053240740740736 | 49.985 |
| 0.4605439814814815 | 49.971 |
| 0.46055555555555555 | 49.959 |
| 0.46056712962962965 | 49.951 |
| 0.4605787037037037 | 49.942 |
| 0.4605902777777778 | 49.938 |
| 0.4606018518518518 | 49.934 |
| 0.46061342592592597 | 49.932 |
| 0.460625 | 49.93 |
| 0.4606365740740741 | 49.93 |
| 0.46064814814814814 | 49.93 |
| 0.46065972222222223 | 49.931 |
| 0.4606712962962963 | 49.932 |
| 0.4606828703703704 | 49.933 |
| 0.46069444444444446 | 49.934 |
| 0.4607060185185185 | 49.934 |
| 0.4607175925925926 | 49.935 |
| 0.46072916666666663 | 49.935 |
| 0.46074074074074073 | 49.934 |
| 0.46075231481481477 | 49.933 |
| 0.4607638888888889 | 49.933 |
| 0.46077546296296296 | 49.931 |
| 0.46078703703703705 | 49.93 |
| 0.4607986111111111 | 49.928 |
| 0.4608101851851852 | 49.926 |
| 0.4608217592592592 | 49.927 |
| 0.4608333333333334 | 49.927 |
| 0.4608449074074074 | 49.927 |
| 0.4608564814814815 | 49.929 |
| 0.46086805555555554 | 49.929 |
| 0.46087962962962964 | 49.928 |
| 0.4608912037037037 | 49.928 |
| 0.46090277777777783 | 49.927 |
| 0.46091435185185187 | 49.926 |
| 0.46092592592592596 | 49.924 |
| 0.4609375 | 49.922 |
| 0.46094907407407404 | 49.92 |
| 0.46096064814814813 | 49.918 |
| 0.46097222222222217 | 49.915 |
| 0.4609837962962963 | 49.915 |
| 0.46099537037037036 | 49.913 |
| 0.46100694444444446 | 49.913 |
| 0.4610185185185185 | 49.911 |
| 0.4610300925925926 | 49.909 |
| 0.4610416666666666 | 49.908 |
| 0.4610532407407408 | 49.908 |
| 0.4610648148148148 | 49.909 |
| 0.4610763888888889 | 49.908 |
| 0.46108796296296295 | 49.908 |
| 0.46109953703703704 | 49.906 |
| 0.4611111111111111 | 49.904 |
| 0.46112268518518523 | 49.9 |
| 0.46113425925925927 | 49.9 |
| 0.46114583333333337 | 49.897 |
| 0.4611574074074074 | 49.897 |
| 0.4611689814814815 | 49.895 |
| 0.46118055555555554 | 49.893 |
| 0.4611921296296296 | 49.89 |
| 0.4612037037037037 | 49.887 |
| 0.46121527777777777 | 49.883 |
| 0.46122685185185186 | 49.883 |
| 0.4612384259259259 | 49.883 |
| 0.46125 | 49.88 |
| 0.46126157407407403 | 49.892 |
| 0.4612731481481482 | 49.877 |
| 0.4612847222222222 | 49.876 |
| 0.4612962962962963 | 49.873 |
| 0.46130787037037035 | 49.872 |
| 0.46131944444444445 | 49.873 |
| 0.4613310185185185 | 49.872 |
| 0.46134259259259264 | 49.871 |
| 0.4613541666666667 | 49.872 |
| 0.46136574074074077 | 49.872 |
| 0.4613773148148148 | 49.872 |
| 0.4613888888888889 | 49.873 |
| 0.46140046296296294 | 49.874 |
| 0.461412037037037 | 49.875 |
| 0.46142361111111113 | 49.879 |
| 0.46143518518518517 | 49.882 |
| 0.46144675925925926 | 49.883 |
| 0.4614583333333333 | 49.884 |
| 0.4614699074074074 | 49.883 |
| 0.46148148148148144 | 49.882 |
| 0.4614930555555556 | 49.883 |
| 0.4615046296296296 | 49.883 |
| 0.4615162037037037 | 49.883 |
| 0.46152777777777776 | 49.882 |
| 0.46153935185185185 | 49.882 |
| 0.4615509259259259 | 49.884 |
| 0.46156250000000004 | 49.883 |
| 0.4615740740740741 | 49.884 |
| 0.4615856481481482 | 49.884 |
| 0.4615972222222222 | 49.886 |
| 0.4616087962962963 | 49.886 |
| 0.46162037037037035 | 49.885 |
| 0.4616319444444445 | 49.886 |
| 0.46164351851851854 | 49.886 |
| 0.4616550925925926 | 49.888 |
| 0.46166666666666667 | 49.892 |
| 0.4616782407407407 | 49.897 |
| 0.4616898148148148 | 49.902 |
| 0.46170138888888884 | 49.906 |
| 0.461712962962963 | 49.91 |
| 0.46172453703703703 | 49.911 |
| 0.4617361111111111 | 49.914 |
| 0.46174768518518516 | 49.916 |
| 0.46175925925925926 | 49.918 |
| 0.4617708333333333 | 49.92 |
| 0.46178240740740745 | 49.921 |
| 0.4617939814814815 | 49.921 |
| 0.4618055555555556 | 49.922 |
| 0.4618171296296296 | 49.924 |
| 0.4618287037037037 | 49.924 |
| 0.46184027777777775 | 49.925 |
| 0.4618518518518519 | 49.924 |
| 0.46186342592592594 | 49.924 |
| 0.46187500000000004 | 49.924 |
| 0.4618865740740741 | 49.924 |
| 0.4618981481481481 | 49.925 |
| 0.4619097222222222 | 49.926 |
| 0.46192129629629625 | 49.927 |
| 0.4619328703703704 | 49.928 |
| 0.46194444444444444 | 49.929 |
| 0.46195601851851853 | 49.931 |
| 0.46196759259259257 | 49.934 |
| 0.46197916666666666 | 49.936 |
| 0.4619907407407407 | 49.937 |
| 0.46200231481481485 | 49.94 |
| 0.4620138888888889 | 49.943 |
| 0.462025462962963 | 49.943 |
| 0.462037037037037 | 49.946 |
| 0.4620486111111111 | 49.949 |
| 0.46206018518518516 | 49.951 |
| 0.4620717592592593 | 49.952 |
| 0.46208333333333335 | 49.952 |
| 0.46209490740740744 | 49.953 |
| 0.4621064814814815 | 49.955 |
| 0.4621180555555556 | 49.956 |
| 0.4621296296296296 | 49.958 |
| 0.46214120370370365 | 49.959 |
| 0.4621527777777778 | 49.961 |
| 0.46216435185185184 | 49.961 |
| 0.46217592592592593 | 49.962 |
| 0.4621875 | 49.964 |
| 0.46219907407407407 | 49.966 |
| 0.4622106481481481 | 49.968 |
| 0.46222222222222226 | 49.972 |
| 0.4622337962962963 | 49.976 |
| 0.4622453703703704 | 49.981 |
| 0.46225694444444443 | 49.984 |
| 0.4622685185185185 | 49.986 |
| 0.46228009259259256 | 49.987 |
| 0.4622916666666667 | 49.987 |
| 0.46230324074074075 | 49.988 |
| 0.46231481481481485 | 49.99 |
| 0.4623263888888889 | 49.993 |
| 0.462337962962963 | 49.992 |
| 0.462349537037037 | 49.995 |
| 0.46236111111111106 | 49.994 |
| 0.4623726851851852 | 49.996 |
| 0.46238425925925924 | 49.996 |
| 0.46239583333333334 | 49.996 |
| 0.4624074074074074 | 49.997 |
| 0.4624189814814815 | 49.996 |
| 0.4624305555555555 | 49.998 |
| 0.46244212962962966 | 49.999 |
| 0.4624537037037037 | 50.001 |
| 0.4624652777777778 | 50.002 |
| 0.46247685185185183 | 50.003 |
| 0.46248842592592593 | 50.001 |
| 0.46249999999999997 | 49.999 |
| 0.4625115740740741 | 49.996 |
| 0.46252314814814816 | 49.992 |
| 0.46253472222222225 | 49.988 |
| 0.4625462962962963 | 49.983 |
| 0.4625578703703704 | 49.981 |
| 0.4625694444444444 | 49.981 |
| 0.46258101851851857 | 49.981 |
| 0.4625925925925926 | 49.981 |
| 0.46260416666666665 | 49.981 |
| 0.46261574074074074 | 49.982 |
| 0.4626273148148148 | 49.984 |
| 0.4626388888888889 | 49.983 |
| 0.4626504629629629 | 49.985 |
| 0.46266203703703707 | 49.989 |
| 0.4626736111111111 | 49.993 |
| 0.4626851851851852 | 49.994 |
| 0.46269675925925924 | 49.996 |
| 0.46270833333333333 | 49.997 |
| 0.46271990740740737 | 49.999 |
| 0.4627314814814815 | 49.999 |
| 0.46274305555555556 | 49.999 |
| 0.46275462962962965 | 50 |
| 0.4627662037037037 | 50.001 |
| 0.4627777777777778 | 50 |
| 0.4627893518518518 | 50 |
| 0.462800925925926 | 50.001 |
| 0.4628125 | 50.001 |
| 0.4628240740740741 | 50.002 |
| 0.46283564814814815 | 50.002 |
| 0.4628472222222222 | 50.004 |
| 0.4628587962962963 | 50.005 |
| 0.4628703703703703 | 50.004 |
| 0.46288194444444447 | 50.004 |
| 0.4628935185185185 | 50.004 |
| 0.4629050925925926 | 50.002 |
| 0.46291666666666664 | 50 |
| 0.46292824074074074 | 49.997 |
| 0.4629398148148148 | 49.997 |
| 0.4629513888888889 | 49.996 |
| 0.46296296296296297 | 49.996 |
| 0.46297453703703706 | 49.993 |
| 0.4629861111111111 | 49.992 |
| 0.4629976851851852 | 49.991 |
| 0.46300925925925923 | 49.988 |
| 0.4630208333333334 | 49.984 |
| 0.4630324074074074 | 49.982 |
| 0.4630439814814815 | 49.98 |
| 0.46305555555555555 | 49.977 |
| 0.46306712962962965 | 49.976 |
| 0.4630787037037037 | 49.973 |
| 0.4630902777777777 | 49.974 |
| 0.4631018518518519 | 49.974 |
| 0.4631134259259259 | 49.977 |
| 0.463125 | 49.978 |
| 0.46313657407407405 | 49.979 |
| 0.46314814814814814 | 49.979 |
| 0.4631597222222222 | 49.981 |
| 0.46317129629629633 | 49.981 |
| 0.46318287037037037 | 49.983 |
| 0.46319444444444446 | 49.983 |
| 0.4632060185185185 | 49.983 |
| 0.4632175925925926 | 49.983 |
| 0.46322916666666664 | 49.982 |
| 0.4632407407407408 | 49.985 |
| 0.4632523148148148 | 49.985 |
| 0.4632638888888889 | 49.985 |
| 0.46327546296296296 | 49.986 |
| 0.46328703703703705 | 49.985 |
| 0.4632986111111111 | 49.984 |
| 0.46331018518518513 | 49.982 |
| 0.4633217592592593 | 49.981 |
| 0.4633333333333333 | 49.983 |
| 0.4633449074074074 | 49.984 |
| 0.46335648148148145 | 49.985 |
| 0.46336805555555555 | 49.986 |
| 0.4633796296296296 | 49.986 |
| 0.46339120370370374 | 49.989 |
| 0.4634027777777778 | 49.989 |
| 0.46341435185185187 | 49.988 |
| 0.4634259259259259 | 49.989 |
| 0.4634375 | 49.99 |
| 0.46344907407407404 | 49.99 |
| 0.4634606481481482 | 49.99 |
| 0.46347222222222223 | 49.991 |
| 0.4634837962962963 | 49.993 |
| 0.46349537037037036 | 49.995 |
| 0.46350694444444446 | 49.998 |
| 0.4635185185185185 | 50 |
| 0.46353009259259265 | 50.003 |
| 0.4635416666666667 | 50.005 |
| 0.4635532407407407 | 50.006 |
| 0.4635648148148148 | 50.008 |
| 0.46357638888888886 | 50.01 |
| 0.46358796296296295 | 50.013 |
| 0.463599537037037 | 50.017 |
| 0.46361111111111114 | 50.019 |
| 0.4636226851851852 | 50.022 |
| 0.4636342592592593 | 50.023 |
| 0.4636458333333333 | 50.024 |
| 0.4636574074074074 | 50.027 |
| 0.46366898148148145 | 50.028 |
| 0.4636805555555556 | 50.028 |
| 0.46369212962962963 | 50.028 |
| 0.46370370370370373 | 50.027 |
| 0.46371527777777777 | 50.026 |
| 0.46372685185185186 | 50.024 |
| 0.4637384259259259 | 50.024 |
| 0.46375000000000005 | 50.021 |
| 0.4637615740740741 | 50.02 |
| 0.4637731481481482 | 50.016 |
| 0.4637847222222222 | 50.012 |
| 0.46379629629629626 | 50.008 |
| 0.46380787037037036 | 50.006 |
| 0.4638194444444444 | 50.001 |
| 0.46383101851851855 | 49.999 |
| 0.4638425925925926 | 49.997 |
| 0.4638541666666667 | 49.994 |
| 0.4638657407407407 | 49.991 |
| 0.4638773148148148 | 49.99 |
| 0.46388888888888885 | 49.987 |
| 0.463900462962963 | 49.985 |
| 0.46391203703703704 | 49.985 |
| 0.46392361111111113 | 49.983 |
| 0.4639351851851852 | 49.985 |
| 0.46394675925925927 | 49.986 |
| 0.4639583333333333 | 49.988 |
| 0.46396990740740746 | 49.988 |
| 0.4639814814814815 | 49.988 |
| 0.4639930555555556 | 49.989 |
| 0.46400462962962963 | 49.989 |
| 0.46401620370370367 | 49.991 |
| 0.46402777777777776 | 49.992 |
| 0.4640393518518518 | 49.994 |
| 0.46405092592592595 | 49.996 |
| 0.4640625 | 49.999 |
| 0.4640740740740741 | 50.002 |
| 0.4640856481481481 | 50.004 |
| 0.4640972222222222 | 50.005 |
| 0.46410879629629626 | 50.006 |
| 0.4641203703703704 | 50.009 |
| 0.46413194444444444 | 50.01 |
| 0.46414351851851854 | 50.013 |
| 0.4641550925925926 | 50.014 |
| 0.46416666666666667 | 50.017 |
| 0.4641782407407407 | 50.018 |
| 0.46418981481481486 | 50.019 |
| 0.4642013888888889 | 50.021 |
| 0.464212962962963 | 50.021 |
| 0.46422453703703703 | 50.02 |
| 0.4642361111111111 | 50.023 |
| 0.46424768518518517 | 50.023 |
| 0.4642592592592592 | 50.024 |
| 0.46427083333333335 | 50.023 |
| 0.4642824074074074 | 50.022 |
| 0.4642939814814815 | 50.02 |
| 0.4643055555555555 | 50.02 |
| 0.4643171296296296 | 50.02 |
| 0.46432870370370366 | 50.017 |
| 0.4643402777777778 | 50.017 |
| 0.46435185185185185 | 50.015 |
| 0.46436342592592594 | 50.014 |
| 0.464375 | 50.014 |
| 0.4643865740740741 | 50.016 |
| 0.4643981481481481 | 50.015 |
| 0.46440972222222227 | 50.016 |
| 0.4644212962962963 | 50.016 |
| 0.4644328703703704 | 50.015 |
| 0.46444444444444444 | 50.014 |
| 0.46445601851851853 | 50.013 |
| 0.46446759259259257 | 50.01 |
| 0.4644791666666667 | 50.009 |
| 0.46449074074074076 | 50.007 |
| 0.4645023148148148 | 50.007 |
| 0.4645138888888889 | 50.006 |
| 0.46452546296296293 | 50.004 |
| 0.464537037037037 | 50.003 |
| 0.46454861111111106 | 50.003 |
| 0.4645601851851852 | 50.001 |
| 0.46457175925925925 | 49.999 |
| 0.46458333333333335 | 49.996 |
| 0.4645949074074074 | 49.993 |
| 0.4646064814814815 | 49.99 |
| 0.4646180555555555 | 49.987 |
| 0.46462962962962967 | 49.983 |
| 0.4646412037037037 | 49.985 |
| 0.4646527777777778 | 49.986 |
| 0.46466435185185184 | 49.99 |
| 0.46467592592592594 | 49.994 |
| 0.4646875 | 49.997 |
| 0.4646990740740741 | 50.001 |
| 0.46471064814814816 | 50.003 |
| 0.4647222222222222 | 50.007 |
| 0.4647337962962963 | 50.009 |
| 0.46474537037037034 | 50.01 |
| 0.46475694444444443 | 50.011 |
| 0.46476851851851847 | 50.013 |
| 0.4647800925925926 | 50.015 |
| 0.46479166666666666 | 50.017 |
| 0.46480324074074075 | 50.018 |
| 0.4648148148148148 | 50.018 |
| 0.4648263888888889 | 50.017 |
| 0.4648379629629629 | 50.016 |
| 0.4648495370370371 | 50.015 |
| 0.4648611111111111 | 50.013 |
| 0.4648726851851852 | 50.011 |
| 0.46488425925925925 | 50.012 |
| 0.46489583333333334 | 50.012 |
| 0.4649074074074074 | 50.012 |
| 0.46491898148148153 | 50.012 |
| 0.46493055555555557 | 50.012 |
| 0.46494212962962966 | 50.012 |
| 0.4649537037037037 | 50.012 |
| 0.4649652777777778 | 50.011 |
| 0.46497685185185184 | 50.01 |
| 0.4649884259259259 | 50.008 |
| 0.465 | 50.006 |
| 0.46501157407407406 | 50.006 |
| 0.46502314814814816 | 50.007 |
| 0.4650347222222222 | 50.005 |
| 0.4650462962962963 | 50.007 |
| 0.46505787037037033 | 50.008 |
| 0.4650694444444445 | 50.01 |
| 0.4650810185185185 | 50.012 |
| 0.4650925925925926 | 50.014 |
| 0.46510416666666665 | 50.016 |
| 0.46511574074074075 | 50.015 |
| 0.4651273148148148 | 50.015 |
| 0.46513888888888894 | 50.014 |
| 0.465150462962963 | 50.014 |
| 0.46516203703703707 | 50.014 |
| 0.4651736111111111 | 50.014 |
| 0.4651851851851852 | 50.016 |
| 0.46519675925925924 | 50.016 |
| 0.4652083333333333 | 50.015 |
| 0.46521990740740743 | 50.012 |
| 0.46523148148148147 | 50.011 |
| 0.46524305555555556 | 50.007 |
| 0.4652546296296296 | 50.007 |
| 0.4652662037037037 | 50.006 |
| 0.46527777777777773 | 50.006 |
| 0.4652893518518519 | 50.002 |
| 0.4653009259259259 | 50 |
| 0.4653125 | 49.994 |
| 0.46532407407407406 | 49.994 |
| 0.46533564814814815 | 49.989 |
| 0.4653472222222222 | 49.987 |
| 0.46535879629629634 | 49.985 |
| 0.4653703703703704 | 49.984 |
| 0.4653819444444445 | 49.986 |
| 0.4653935185185185 | 49.986 |
| 0.4654050925925926 | 49.989 |
| 0.46541666666666665 | 49.989 |
| 0.4654282407407408 | 49.99 |
| 0.46543981481481483 | 49.99 |
| 0.4654513888888889 | 49.99 |
| 0.46546296296296297 | 49.99 |
| 0.465474537037037 | 49.99 |
| 0.4654861111111111 | 49.989 |
| 0.46549768518518514 | 49.987 |
| 0.4655092592592593 | 49.985 |
| 0.46552083333333333 | 49.981 |
| 0.4655324074074074 | 49.98 |
| 0.46554398148148146 | 49.98 |
| 0.46555555555555556 | 49.98 |
| 0.4655671296296296 | 49.978 |
| 0.46557870370370374 | 49.974 |
| 0.4655902777777778 | 49.967 |
| 0.4656018518518519 | 49.956 |
| 0.4656134259259259 | 49.942 |
| 0.465625 | 49.93 |
| 0.46563657407407405 | 49.917 |
| 0.4656481481481482 | 49.908 |
| 0.46565972222222224 | 49.896 |
| 0.46567129629629633 | 49.889 |
| 0.46568287037037037 | 49.88 |
| 0.4656944444444444 | 49.88 |
| 0.4657060185185185 | 49.883 |
| 0.46571759259259254 | 49.883 |
| 0.4657291666666667 | 49.884 |
| 0.46574074074074073 | 49.882 |
| 0.4657523148148148 | 49.88 |
| 0.46576388888888887 | 49.878 |
| 0.46577546296296296 | 49.876 |
| 0.465787037037037 | 49.872 |
| 0.46579861111111115 | 49.869 |
| 0.4658101851851852 | 49.865 |
| 0.4658217592592593 | 49.859 |
| 0.4658333333333333 | 49.854 |
| 0.4658449074074074 | 49.85 |
| 0.46585648148148145 | 49.845 |
| 0.4658680555555556 | 49.839 |
| 0.46587962962962964 | 49.831 |
| 0.46589120370370374 | 49.825 |
| 0.4659027777777778 | 49.823 |
| 0.4659143518518518 | 49.83 |
| 0.4659259259259259 | 49.836 |
| 0.46593749999999995 | 49.843 |
| 0.4659490740740741 | 49.851 |
| 0.46596064814814814 | 49.855 |
| 0.46597222222222223 | 49.858 |
| 0.46598379629629627 | 49.859 |
| 0.46599537037037037 | 49.859 |
| 0.4660069444444444 | 49.859 |
| 0.46601851851851855 | 49.856 |
| 0.4660300925925926 | 49.856 |
| 0.4660416666666667 | 49.855 |
| 0.4660532407407407 | 49.854 |
| 0.4660648148148148 | 49.853 |
| 0.46607638888888886 | 49.853 |
| 0.466087962962963 | 49.854 |
| 0.46609953703703705 | 49.855 |
| 0.46611111111111114 | 49.856 |
| 0.4661226851851852 | 49.857 |
| 0.4661342592592593 | 49.858 |
| 0.4661458333333333 | 49.858 |
| 0.46615740740740735 | 49.857 |
| 0.4661689814814815 | 49.856 |
| 0.46618055555555554 | 49.855 |
| 0.46619212962962964 | 49.852 |
| 0.4662037037037037 | 49.851 |
| 0.46621527777777777 | 49.848 |
| 0.4662268518518518 | 49.849 |
| 0.46623842592592596 | 49.848 |
| 0.46625 | 49.849 |
| 0.4662615740740741 | 49.848 |
| 0.46627314814814813 | 49.847 |
| 0.4662847222222222 | 49.848 |
| 0.46629629629629626 | 49.848 |
| 0.4663078703703704 | 49.851 |
| 0.46631944444444445 | 49.854 |
| 0.46633101851851855 | 49.859 |
| 0.4663425925925926 | 49.861 |
| 0.4663541666666667 | 49.865 |
| 0.4663657407407407 | 49.871 |
| 0.46637731481481487 | 49.872 |
| 0.4663888888888889 | 49.877 |
| 0.46640046296296295 | 49.878 |
| 0.46641203703703704 | 49.882 |
| 0.4664236111111111 | 49.885 |
| 0.4664351851851852 | 49.888 |
| 0.4664467592592592 | 49.89 |
| 0.46645833333333336 | 49.891 |
| 0.4664699074074074 | 49.893 |
| 0.4664814814814815 | 49.896 |
| 0.46649305555555554 | 49.897 |
| 0.46650462962962963 | 49.9 |
| 0.46651620370370367 | 49.902 |
| 0.4665277777777778 | 49.903 |
| 0.46653935185185186 | 49.904 |
| 0.46655092592592595 | 49.904 |
| 0.4665625 | 49.906 |
| 0.4665740740740741 | 49.908 |
| 0.4665856481481481 | 49.908 |
| 0.4665972222222223 | 49.909 |
| 0.4666087962962963 | 49.909 |
| 0.46662037037037035 | 49.911 |
| 0.46663194444444445 | 49.91 |
| 0.4666435185185185 | 49.909 |
| 0.4666550925925926 | 49.908 |
| 0.4666666666666666 | 49.908 |
| 0.46667824074074077 | 49.906 |
| 0.4666898148148148 | 49.905 |
| 0.4667013888888889 | 49.903 |
| 0.46671296296296294 | 49.902 |
| 0.46672453703703703 | 49.901 |
| 0.4667361111111111 | 49.901 |
| 0.4667476851851852 | 49.901 |
| 0.46675925925925926 | 49.901 |
| 0.46677083333333336 | 49.902 |
| 0.4667824074074074 | 49.901 |
| 0.4667939814814815 | 49.902 |
| 0.46680555555555553 | 49.902 |
| 0.4668171296296297 | 49.901 |
| 0.4668287037037037 | 49.9 |
| 0.4668402777777778 | 49.899 |
| 0.46685185185185185 | 49.897 |
| 0.4668634259259259 | 49.894 |
| 0.466875 | 49.891 |
| 0.466886574074074 | 49.887 |
| 0.4668981481481482 | 49.883 |
| 0.4669097222222222 | 49.88 |
| 0.4669212962962963 | 49.878 |
| 0.46693287037037035 | 49.876 |
| 0.46694444444444444 | 49.875 |
| 0.4669560185185185 | 49.874 |
| 0.46696759259259263 | 49.873 |
| 0.46697916666666667 | 49.872 |
| 0.46699074074074076 | 49.871 |
| 0.4670023148148148 | 49.871 |
| 0.4670138888888889 | 49.871 |
| 0.46702546296296293 | 49.872 |
| 0.4670370370370371 | 49.871 |
| 0.4670486111111111 | 49.872 |
| 0.4670601851851852 | 49.871 |
| 0.46707175925925926 | 49.871 |
| 0.46708333333333335 | 49.871 |
| 0.4670949074074074 | 49.874 |
| 0.46710648148148143 | 49.88 |
| 0.4671180555555556 | 49.887 |
| 0.4671296296296296 | 49.893 |
| 0.4671412037037037 | 49.897 |
| 0.46715277777777775 | 49.901 |
| 0.46716435185185184 | 49.903 |
| 0.4671759259259259 | 49.905 |
| 0.46718750000000003 | 49.908 |
| 0.46719907407407407 | 49.911 |
| 0.46721064814814817 | 49.914 |
| 0.4672222222222222 | 49.917 |
| 0.4672337962962963 | 49.919 |
| 0.46724537037037034 | 49.92 |
| 0.4672569444444445 | 49.92 |
| 0.4672685185185185 | 49.919 |
| 0.4672800925925926 | 49.918 |
| 0.46729166666666666 | 49.917 |
| 0.46730324074074076 | 49.915 |
| 0.4673148148148148 | 49.912 |
| 0.46732638888888883 | 49.909 |
| 0.467337962962963 | 49.905 |
| 0.467349537037037 | 49.901 |
| 0.4673611111111111 | 49.897 |
| 0.46737268518518515 | 49.891 |
| 0.46738425925925925 | 49.888 |
| 0.4673958333333333 | 49.885 |
| 0.46740740740740744 | 49.884 |
| 0.4674189814814815 | 49.883 |
| 0.46743055555555557 | 49.886 |
| 0.4674421296296296 | 49.886 |
| 0.4674537037037037 | 49.891 |
| 0.46746527777777774 | 49.893 |
| 0.4674768518518519 | 49.895 |
| 0.46748842592592593 | 49.895 |
| 0.4675 | 49.895 |
| 0.46751157407407407 | 49.896 |
| 0.46752314814814816 | 49.895 |
| 0.4675347222222222 | 49.894 |
| 0.46754629629629635 | 49.892 |
| 0.4675578703703704 | 49.893 |
| 0.4675694444444445 | 49.893 |
| 0.4675810185185185 | 49.892 |
| 0.46759259259259256 | 49.893 |
| 0.46760416666666665 | 49.894 |
| 0.4676157407407407 | 49.896 |
| 0.46762731481481484 | 49.898 |
| 0.4676388888888889 | 49.899 |
| 0.467650462962963 | 49.9 |
| 0.467662037037037 | 49.901 |
| 0.4676736111111111 | 49.901 |
| 0.46768518518518515 | 49.9 |
| 0.4676967592592593 | 49.899 |
| 0.46770833333333334 | 49.898 |
| 0.46771990740740743 | 49.898 |
| 0.46773148148148147 | 49.899 |
| 0.46774305555555556 | 49.9 |
| 0.4677546296296296 | 49.9 |
| 0.46776620370370375 | 49.9 |
| 0.4677777777777778 | 49.9 |
| 0.4677893518518519 | 49.901 |
| 0.4678009259259259 | 49.9 |
| 0.46781249999999996 | 49.901 |
| 0.46782407407407406 | 49.901 |
| 0.4678356481481481 | 49.902 |
| 0.46784722222222225 | 49.902 |
| 0.4678587962962963 | 49.903 |
| 0.4678703703703704 | 49.905 |
| 0.4678819444444444 | 49.905 |
| 0.4678935185185185 | 49.906 |
| 0.46790509259259255 | 49.906 |
| 0.4679166666666667 | 49.907 |
| 0.46792824074074074 | 49.906 |
| 0.46793981481481484 | 49.906 |
| 0.4679513888888889 | 49.907 |
| 0.46796296296296297 | 49.906 |
| 0.467974537037037 | 49.907 |
| 0.46798611111111116 | 49.907 |
| 0.4679976851851852 | 49.908 |
| 0.4680092592592593 | 49.907 |
| 0.46802083333333333 | 49.908 |
| 0.4680324074074074 | 49.909 |
| 0.46804398148148146 | 49.91 |
| 0.4680555555555555 | 49.909 |
| 0.46806712962962965 | 49.906 |
| 0.4680787037037037 | 49.903 |
| 0.4680902777777778 | 49.901 |
| 0.4681018518518518 | 49.899 |
| 0.4681134259259259 | 49.896 |
| 0.46812499999999996 | 49.894 |
| 0.4681365740740741 | 49.893 |
| 0.46814814814814815 | 49.892 |
| 0.46815972222222224 | 49.89 |
| 0.4681712962962963 | 49.89 |
| 0.4681828703703704 | 49.891 |
| 0.4681944444444444 | 49.891 |
| 0.46820601851851856 | 49.893 |
| 0.4682175925925926 | 49.89 |
| 0.4682291666666667 | 49.889 |
| 0.46824074074074074 | 49.889 |
| 0.46825231481481483 | 49.889 |
| 0.46826388888888887 | 49.891 |
| 0.468275462962963 | 49.894 |
| 0.46828703703703706 | 49.896 |
| 0.4682986111111111 | 49.898 |
| 0.4683101851851852 | 49.902 |
| 0.46832175925925923 | 49.904 |
| 0.4683333333333333 | 49.905 |
| 0.46834490740740736 | 49.907 |
| 0.4683564814814815 | 49.908 |
| 0.46836805555555555 | 49.909 |
| 0.46837962962962965 | 49.91 |
| 0.4683912037037037 | 49.912 |
| 0.4684027777777778 | 49.912 |
| 0.4684143518518518 | 49.912 |
| 0.46842592592592597 | 49.909 |
| 0.4684375 | 49.909 |
| 0.4684490740740741 | 49.91 |
| 0.46846064814814814 | 49.911 |
| 0.46847222222222223 | 49.912 |
| 0.4684837962962963 | 49.914 |
| 0.4684953703703704 | 49.919 |
| 0.46850694444444446 | 49.923 |
| 0.4685185185185185 | 49.925 |
| 0.4685300925925926 | 49.929 |
| 0.46854166666666663 | 49.928 |
| 0.46855324074074073 | 49.93 |
| 0.46856481481481477 | 49.932 |
| 0.4685763888888889 | 49.936 |
| 0.46858796296296296 | 49.937 |
| 0.46859953703703705 | 49.938 |
| 0.4686111111111111 | 49.939 |
| 0.4686226851851852 | 49.94 |
| 0.4686342592592592 | 49.94 |
| 0.4686458333333334 | 49.939 |
| 0.4686574074074074 | 49.937 |
| 0.4686689814814815 | 49.936 |
| 0.46868055555555554 | 49.936 |
| 0.46869212962962964 | 49.936 |
| 0.4687037037037037 | 49.937 |
| 0.46871527777777783 | 49.936 |
| 0.46872685185185187 | 49.936 |
| 0.46873842592592596 | 49.936 |
| 0.46875 | 49.935 |
| 0.46876157407407404 | 49.933 |
| 0.46877314814814813 | 49.933 |
| 0.46878472222222217 | 49.932 |
| 0.4687962962962963 | 49.931 |
| 0.46880787037037036 | 49.929 |
| 0.46881944444444446 | 49.929 |
| 0.4688310185185185 | 49.93 |
| 0.4688425925925926 | 49.929 |
| 0.4688541666666666 | 49.932 |
| 0.4688657407407408 | 49.933 |
| 0.4688773148148148 | 49.935 |
| 0.4688888888888889 | 49.935 |
| 0.46890046296296295 | 49.935 |
| 0.46891203703703704 | 49.936 |
| 0.4689236111111111 | 49.938 |
| 0.46893518518518523 | 49.938 |
| 0.46894675925925927 | 49.94 |
| 0.46895833333333337 | 49.938 |
| 0.4689699074074074 | 49.937 |
| 0.4689814814814815 | 49.937 |
| 0.46899305555555554 | 49.936 |
| 0.4690046296296296 | 49.935 |
| 0.4690162037037037 | 49.934 |
| 0.46902777777777777 | 49.933 |
| 0.46903935185185186 | 49.932 |
| 0.4690509259259259 | 49.931 |
| 0.4690625 | 49.929 |
| 0.46907407407407403 | 49.927 |
| 0.4690856481481482 | 49.926 |
| 0.4690972222222222 | 49.926 |
| 0.4691087962962963 | 49.925 |
| 0.46912037037037035 | 49.924 |
| 0.46913194444444445 | 49.923 |
| 0.4691435185185185 | 49.923 |
| 0.46915509259259264 | 49.921 |
| 0.4691666666666667 | 49.921 |
| 0.46917824074074077 | 49.921 |
| 0.4691898148148148 | 49.923 |
| 0.4692013888888889 | 49.924 |
| 0.46921296296296294 | 49.923 |
| 0.469224537037037 | 49.923 |
| 0.46923611111111113 | 49.924 |
| 0.46924768518518517 | 49.926 |
| 0.46925925925925926 | 49.927 |
| 0.4692708333333333 | 49.93 |
| 0.4692824074074074 | 49.933 |
| 0.46929398148148144 | 49.936 |
| 0.4693055555555556 | 49.939 |
| 0.4693171296296296 | 49.943 |
| 0.4693287037037037 | 49.946 |
| 0.46934027777777776 | 49.948 |
| 0.46935185185185185 | 49.951 |
| 0.4693634259259259 | 49.952 |
| 0.46937500000000004 | 49.954 |
| 0.4693865740740741 | 49.956 |
| 0.4693981481481482 | 49.955 |
| 0.4694097222222222 | 49.955 |
| 0.4694212962962963 | 49.954 |
| 0.46943287037037035 | 49.952 |
| 0.4694444444444445 | 49.948 |
| 0.46945601851851854 | 49.944 |
| 0.46946759259259263 | 49.942 |
| 0.46947916666666667 | 49.94 |
| 0.4694907407407407 | 49.938 |
| 0.4695023148148148 | 49.936 |
| 0.46951388888888884 | 49.933 |
| 0.469525462962963 | 49.928 |
| 0.46953703703703703 | 49.924 |
| 0.4695486111111111 | 49.92 |
| 0.46956018518518516 | 49.918 |
| 0.46957175925925926 | 49.915 |
| 0.4695833333333333 | 49.914 |
| 0.46959490740740745 | 49.913 |
| 0.4696064814814815 | 49.912 |
| 0.4696180555555556 | 49.91 |
| 0.4696296296296296 | 49.908 |
| 0.4696412037037037 | 49.907 |
| 0.46965277777777775 | 49.907 |
| 0.4696643518518519 | 49.906 |
| 0.46967592592592594 | 49.908 |
| 0.46968750000000004 | 49.908 |
| 0.4696990740740741 | 49.909 |
| 0.4697106481481481 | 49.91 |
| 0.4697222222222222 | 49.911 |
| 0.46973379629629625 | 49.913 |
| 0.4697453703703704 | 49.914 |
| 0.46975694444444444 | 49.914 |
| 0.46976851851851853 | 49.915 |
| 0.46978009259259257 | 49.915 |
| 0.46979166666666666 | 49.915 |
| 0.4698032407407407 | 49.916 |
| 0.46981481481481485 | 49.914 |
| 0.4698263888888889 | 49.913 |
| 0.469837962962963 | 49.911 |
| 0.469849537037037 | 49.912 |
| 0.4698611111111111 | 49.912 |
| 0.46987268518518516 | 49.913 |
| 0.4698842592592593 | 49.913 |
| 0.46989583333333335 | 49.912 |
| 0.46990740740740744 | 49.913 |
| 0.4699189814814815 | 49.914 |
| 0.4699305555555555 | 49.915 |
| 0.4699421296296296 | 49.915 |
| 0.46995370370370365 | 49.916 |
| 0.4699652777777778 | 49.914 |
| 0.46997685185185184 | 49.913 |
| 0.46998842592592593 | 49.912 |
| 0.47 | 49.911 |
| 0.47001157407407407 | 49.912 |
| 0.4700231481481481 | 49.91 |
| 0.47003472222222226 | 49.911 |
| 0.4700462962962963 | 49.91 |
| 0.4700578703703704 | 49.911 |
| 0.47006944444444443 | 49.912 |
| 0.4700810185185185 | 49.912 |
| 0.47009259259259256 | 49.912 |
| 0.4701041666666667 | 49.909 |
| 0.47011574074074075 | 49.909 |
| 0.47012731481481485 | 49.907 |
| 0.4701388888888889 | 49.907 |
| 0.470150462962963 | 49.905 |
| 0.470162037037037 | 49.904 |
| 0.47017361111111117 | 49.901 |
| 0.4701851851851852 | 49.897 |
| 0.47019675925925924 | 49.894 |
| 0.47020833333333334 | 49.89 |
| 0.4702199074074074 | 49.887 |
| 0.4702314814814815 | 49.883 |
| 0.4702430555555555 | 49.882 |
| 0.47025462962962966 | 49.88 |
| 0.4702662037037037 | 49.88 |
| 0.4702777777777778 | 49.881 |
| 0.47028935185185183 | 49.882 |
| 0.47030092592592593 | 49.882 |
| 0.47031249999999997 | 49.883 |
| 0.4703240740740741 | 49.882 |
| 0.47033564814814816 | 49.881 |
| 0.47034722222222225 | 49.881 |
| 0.4703587962962963 | 49.881 |
| 0.4703703703703704 | 49.881 |
| 0.4703819444444444 | 49.882 |
| 0.47039351851851857 | 49.883 |
| 0.4704050925925926 | 49.883 |
| 0.47041666666666665 | 49.883 |
| 0.47042824074074074 | 49.883 |
| 0.4704398148148148 | 49.885 |
| 0.4704513888888889 | 49.886 |
| 0.4704629629629629 | 49.889 |
| 0.47047453703703707 | 49.892 |
| 0.4704861111111111 | 49.895 |
| 0.4704976851851852 | 49.896 |
| 0.47050925925925924 | 49.9 |
| 0.47052083333333333 | 49.902 |
| 0.47053240740740737 | 49.906 |
| 0.4705439814814815 | 49.91 |
| 0.47055555555555556 | 49.912 |
| 0.47056712962962965 | 49.912 |
| 0.4705787037037037 | 49.912 |
| 0.4705902777777778 | 49.911 |
| 0.4706018518518518 | 49.91 |
| 0.470613425925926 | 49.91 |
| 0.470625 | 49.91 |
| 0.47063657407407405 | 49.91 |
| 0.47064814814814815 | 49.911 |
| 0.4706597222222222 | 49.91 |
| 0.4706712962962963 | 49.907 |
| 0.4706828703703703 | 49.903 |
| 0.47069444444444447 | 49.903 |
| 0.4707060185185185 | 49.9 |
| 0.4707175925925926 | 49.899 |
| 0.47072916666666664 | 49.897 |
| 0.47074074074074074 | 49.896 |
| 0.4707523148148148 | 49.894 |
| 0.4707638888888889 | 49.892 |
| 0.47077546296296297 | 49.891 |
| 0.47078703703703706 | 49.893 |
| 0.4707986111111111 | 49.893 |
| 0.4708101851851852 | 49.894 |
| 0.47082175925925923 | 49.894 |
| 0.4708333333333334 | 49.896 |
| 0.4708449074074074 | 49.894 |
| 0.4708564814814815 | 49.893 |
| 0.47086805555555555 | 49.89 |
| 0.47087962962962965 | 49.889 |
| 0.4708912037037037 | 49.886 |
| 0.4709027777777777 | 49.883 |
| 0.4709143518518519 | 49.882 |
| 0.4709259259259259 | 49.882 |
| 0.4709375 | 49.882 |
| 0.47094907407407405 | 49.882 |
| 0.47096064814814814 | 49.88 |
| 0.4709722222222222 | 49.877 |
| 0.47098379629629633 | 49.875 |
| 0.47099537037037037 | 49.874 |
| 0.47100694444444446 | 49.875 |
| 0.4710185185185185 | 49.874 |
| 0.4710300925925926 | 49.874 |
| 0.47104166666666664 | 49.872 |
| 0.4710532407407408 | 49.873 |
| 0.4710648148148148 | 49.875 |
| 0.4710763888888889 | 49.878 |
| 0.47108796296296296 | 49.878 |
| 0.47109953703703705 | 49.881 |
| 0.4711111111111111 | 49.882 |
| 0.47112268518518513 | 49.884 |
| 0.4711342592592593 | 49.887 |
| 0.4711458333333333 | 49.89 |
| 0.4711574074074074 | 49.892 |
| 0.47116898148148145 | 49.893 |
| 0.47118055555555555 | 49.894 |
| 0.4711921296296296 | 49.893 |
| 0.47120370370370374 | 49.892 |
| 0.4712152777777778 | 49.892 |
| 0.47122685185185187 | 49.892 |
| 0.4712384259259259 | 49.891 |
| 0.47125 | 49.891 |
| 0.47126157407407404 | 49.891 |
| 0.4712731481481482 | 49.892 |
| 0.47128472222222223 | 49.891 |
| 0.4712962962962963 | 49.892 |
| 0.47130787037037036 | 49.892 |
| 0.47131944444444446 | 49.894 |
| 0.4713310185185185 | 49.895 |
| 0.47134259259259265 | 49.897 |
| 0.4713541666666667 | 49.898 |
| 0.4713657407407407 | 49.899 |
| 0.4713773148148148 | 49.898 |
| 0.47138888888888886 | 49.899 |
| 0.47140046296296295 | 49.9 |
| 0.471412037037037 | 49.902 |
| 0.47142361111111114 | 49.903 |
| 0.4714351851851852 | 49.907 |
| 0.4714467592592593 | 49.91 |
| 0.4714583333333333 | 49.912 |
| 0.4714699074074074 | 49.911 |
| 0.47148148148148145 | 49.912 |
| 0.4714930555555556 | 49.911 |
| 0.47150462962962963 | 49.909 |
| 0.47151620370370373 | 49.908 |
| 0.47152777777777777 | 49.905 |
| 0.47153935185185186 | 49.901 |
| 0.4715509259259259 | 49.897 |
| 0.47156250000000005 | 49.894 |
| 0.4715740740740741 | 49.89 |
| 0.4715856481481482 | 49.886 |
| 0.4715972222222222 | 49.883 |
| 0.47160879629629626 | 49.881 |
| 0.47162037037037036 | 49.879 |
| 0.4716319444444444 | 49.876 |
| 0.47164351851851855 | 49.874 |
| 0.4716550925925926 | 49.872 |
| 0.4716666666666667 | 49.872 |
| 0.4716782407407407 | 49.872 |
| 0.4716898148148148 | 49.872 |
| 0.47170138888888885 | 49.873 |
| 0.471712962962963 | 49.873 |
| 0.47172453703703704 | 49.872 |
| 0.47173611111111113 | 49.872 |
| 0.4717476851851852 | 49.873 |
| 0.47175925925925927 | 49.872 |
| 0.4717708333333333 | 49.875 |
| 0.47178240740740746 | 49.876 |
| 0.4717939814814815 | 49.88 |
| 0.4718055555555556 | 49.882 |
| 0.47181712962962963 | 49.883 |
| 0.47182870370370367 | 49.884 |
| 0.47184027777777776 | 49.885 |
| 0.4718518518518518 | 49.885 |
| 0.47186342592592595 | 49.888 |
| 0.471875 | 49.888 |
| 0.4718865740740741 | 49.89 |
| 0.4718981481481481 | 49.888 |
| 0.4719097222222222 | 49.89 |
| 0.47192129629629626 | 49.889 |
| 0.4719328703703704 | 49.89 |
| 0.47194444444444444 | 49.889 |
| 0.47195601851851854 | 49.887 |
| 0.4719675925925926 | 49.886 |
| 0.47197916666666667 | 49.884 |
| 0.4719907407407407 | 49.884 |
| 0.47200231481481486 | 49.883 |
| 0.4720138888888889 | 49.882 |
| 0.472025462962963 | 49.88 |
| 0.47203703703703703 | 49.88 |
| 0.4720486111111111 | 49.879 |
| 0.47206018518518517 | 49.878 |
| 0.4720717592592593 | 49.877 |
| 0.47208333333333335 | 49.875 |
| 0.4720949074074074 | 49.872 |
| 0.4721064814814815 | 49.871 |
| 0.4721180555555555 | 49.869 |
| 0.4721296296296296 | 49.868 |
| 0.47214120370370366 | 49.866 |
| 0.4721527777777778 | 49.866 |
| 0.47216435185185185 | 49.865 |
| 0.47217592592592594 | 49.864 |
| 0.4721875 | 49.864 |
| 0.4721990740740741 | 49.862 |
| 0.4722106481481481 | 49.861 |
| 0.47222222222222227 | 49.858 |
| 0.4722337962962963 | 49.855 |
| 0.4722453703703704 | 49.851 |
| 0.47225694444444444 | 49.848 |
| 0.47226851851851853 | 49.845 |
| 0.47228009259259257 | 49.844 |
| 0.4722916666666667 | 49.843 |
| 0.47230324074074076 | 49.841 |
| 0.4723148148148148 | 49.841 |
| 0.4723263888888889 | 49.84 |
| 0.47233796296296293 | 49.84 |
| 0.472349537037037 | 49.842 |
| 0.47236111111111106 | 49.844 |
| 0.4723726851851852 | 49.846 |
| 0.47238425925925925 | 49.849 |
| 0.47239583333333335 | 49.852 |
| 0.4724074074074074 | 49.854 |
| 0.4724189814814815 | 49.852 |
| 0.4724305555555555 | 49.854 |
| 0.47244212962962967 | 49.852 |
| 0.4724537037037037 | 49.853 |
| 0.4724652777777778 | 49.854 |
| 0.47247685185185184 | 49.853 |
| 0.47248842592592594 | 49.853 |
| 0.4725 | 49.854 |
| 0.4725115740740741 | 49.855 |
| 0.47252314814814816 | 49.853 |
| 0.4725347222222222 | 49.852 |
| 0.4725462962962963 | 49.852 |
| 0.47255787037037034 | 49.851 |
| 0.47256944444444443 | 49.852 |
| 0.47258101851851847 | 49.856 |
| 0.4725925925925926 | 49.862 |
| 0.47260416666666666 | 49.864 |
| 0.47261574074074075 | 49.865 |
| 0.4726273148148148 | 49.868 |
| 0.4726388888888889 | 49.871 |
| 0.4726504629629629 | 49.874 |
| 0.4726620370370371 | 49.877 |
| 0.4726736111111111 | 49.879 |
| 0.4726851851851852 | 49.883 |
| 0.47269675925925925 | 49.887 |
| 0.47270833333333334 | 49.889 |
| 0.4727199074074074 | 49.889 |
| 0.47273148148148153 | 49.888 |
| 0.47274305555555557 | 49.886 |
| 0.47275462962962966 | 49.884 |
| 0.4727662037037037 | 49.883 |
| 0.4727777777777778 | 49.881 |
| 0.47278935185185184 | 49.881 |
| 0.4728009259259259 | 49.883 |
| 0.4728125 | 49.882 |
| 0.47282407407407406 | 49.884 |
| 0.47283564814814816 | 49.884 |
| 0.4728472222222222 | 49.884 |
| 0.4728587962962963 | 49.884 |
| 0.47287037037037033 | 49.884 |
| 0.4728819444444445 | 49.884 |
| 0.4728935185185185 | 49.885 |
| 0.4729050925925926 | 49.886 |
| 0.47291666666666665 | 49.886 |
| 0.47292824074074075 | 49.885 |
| 0.4729398148148148 | 49.884 |
| 0.47295138888888894 | 49.885 |
| 0.472962962962963 | 49.885 |
| 0.47297453703703707 | 49.886 |
| 0.4729861111111111 | 49.887 |
| 0.4729976851851852 | 49.888 |
| 0.47300925925925924 | 49.89 |
| 0.4730208333333333 | 49.89 |
| 0.47303240740740743 | 49.89 |
| 0.47304398148148147 | 49.889 |
| 0.47305555555555556 | 49.889 |
| 0.4730671296296296 | 49.889 |
| 0.4730787037037037 | 49.89 |
| 0.47309027777777773 | 49.891 |
| 0.4731018518518519 | 49.89 |
| 0.4731134259259259 | 49.891 |
| 0.473125 | 49.891 |
| 0.47313657407407406 | 49.889 |
| 0.47314814814814815 | 49.89 |
| 0.4731597222222222 | 49.89 |
| 0.47317129629629634 | 49.891 |
| 0.4731828703703704 | 49.894 |
| 0.4731944444444445 | 49.898 |
| 0.4732060185185185 | 49.898 |
| 0.4732175925925926 | 49.898 |
| 0.47322916666666665 | 49.897 |
| 0.4732407407407407 | 49.895 |
| 0.47325231481481483 | 49.893 |
| 0.4732638888888889 | 49.892 |
| 0.47327546296296297 | 49.89 |
| 0.473287037037037 | 49.888 |
| 0.4732986111111111 | 49.887 |
| 0.47331018518518514 | 49.884 |
| 0.4733217592592593 | 49.884 |
| 0.47333333333333333 | 49.883 |
| 0.4733449074074074 | 49.884 |
| 0.47335648148148146 | 49.886 |
| 0.47336805555555556 | 49.887 |
| 0.4733796296296296 | 49.889 |
| 0.47339120370370374 | 49.891 |
| 0.4734027777777778 | 49.892 |
| 0.4734143518518519 | 49.894 |
| 0.4734259259259259 | 49.892 |
| 0.4734375 | 49.889 |
| 0.47344907407407405 | 49.888 |
| 0.4734606481481482 | 49.885 |
| 0.47347222222222224 | 49.882 |
| 0.47348379629629633 | 49.879 |
| 0.47349537037037037 | 49.877 |
| 0.4735069444444444 | 49.874 |
| 0.4735185185185185 | 49.87 |
| 0.47353009259259254 | 49.867 |
| 0.4735416666666667 | 49.865 |
| 0.47355324074074073 | 49.862 |
| 0.4735648148148148 | 49.858 |
| 0.47357638888888887 | 49.856 |
| 0.47358796296296296 | 49.853 |
| 0.473599537037037 | 49.851 |
| 0.47361111111111115 | 49.851 |
| 0.4736226851851852 | 49.849 |
| 0.4736342592592593 | 49.849 |
| 0.4736458333333333 | 49.851 |
| 0.4736574074074074 | 49.85 |
| 0.47366898148148145 | 49.849 |
| 0.4736805555555556 | 49.848 |
| 0.47369212962962964 | 49.849 |
| 0.47370370370370374 | 49.847 |
| 0.4737152777777778 | 49.849 |
| 0.4737268518518518 | 49.851 |
| 0.4737384259259259 | 49.853 |
| 0.47374999999999995 | 49.857 |
| 0.4737615740740741 | 49.861 |
| 0.47377314814814814 | 49.865 |
| 0.47378472222222223 | 49.867 |
| 0.47379629629629627 | 49.869 |
| 0.47380787037037037 | 49.87 |
| 0.4738194444444444 | 49.87 |
| 0.47383101851851855 | 49.873 |
| 0.4738425925925926 | 49.875 |
| 0.4738541666666667 | 49.876 |
| 0.4738657407407407 | 49.875 |
| 0.4738773148148148 | 49.876 |
| 0.47388888888888886 | 49.876 |
| 0.473900462962963 | 49.874 |
| 0.47391203703703705 | 49.875 |
| 0.47392361111111114 | 49.875 |
| 0.4739351851851852 | 49.877 |
| 0.4739467592592593 | 49.878 |
| 0.4739583333333333 | 49.877 |
| 0.47396990740740735 | 49.877 |
| 0.4739814814814815 | 49.878 |
| 0.47399305555555554 | 49.88 |
| 0.47400462962962964 | 49.878 |
| 0.4740162037037037 | 49.878 |
| 0.47402777777777777 | 49.879 |
| 0.4740393518518518 | 49.88 |
| 0.47405092592592596 | 49.88 |
| 0.4740625 | 49.881 |
| 0.4740740740740741 | 49.883 |
| 0.47408564814814813 | 49.887 |
| 0.4740972222222222 | 49.887 |
| 0.47410879629629626 | 49.888 |
| 0.4741203703703704 | 49.889 |
| 0.47413194444444445 | 49.889 |
| 0.47414351851851855 | 49.889 |
| 0.4741550925925926 | 49.891 |
| 0.4741666666666667 | 49.89 |
| 0.4741782407407407 | 49.889 |
| 0.47418981481481487 | 49.887 |
| 0.4742013888888889 | 49.888 |
| 0.47421296296296295 | 49.887 |
| 0.47422453703703704 | 49.886 |
| 0.4742361111111111 | 49.886 |
| 0.4742476851851852 | 49.886 |
| 0.4742592592592592 | 49.886 |
| 0.47427083333333336 | 49.887 |
| 0.4742824074074074 | 49.887 |
| 0.4742939814814815 | 49.887 |
| 0.47430555555555554 | 49.887 |
| 0.47431712962962963 | 49.886 |
| 0.47432870370370367 | 49.885 |
| 0.4743402777777778 | 49.886 |
| 0.47435185185185186 | 49.886 |
| 0.47436342592592595 | 49.886 |
| 0.474375 | 49.886 |
| 0.4743865740740741 | 49.883 |
| 0.4743981481481481 | 49.882 |
| 0.4744097222222223 | 49.879 |
| 0.4744212962962963 | 49.877 |
| 0.47443287037037035 | 49.873 |
| 0.47444444444444445 | 49.872 |
| 0.4744560185185185 | 49.871 |
| 0.4744675925925926 | 49.87 |
| 0.4744791666666666 | 49.871 |
| 0.47449074074074077 | 49.869 |
| 0.4745023148148148 | 49.869 |
| 0.4745138888888889 | 49.87 |
| 0.47452546296296294 | 49.871 |
| 0.47453703703703703 | 49.873 |
| 0.4745486111111111 | 49.874 |
| 0.4745601851851852 | 49.876 |
| 0.47457175925925926 | 49.877 |
| 0.47458333333333336 | 49.877 |
| 0.4745949074074074 | 49.877 |
| 0.4746064814814815 | 49.877 |
| 0.47461805555555553 | 49.878 |
| 0.4746296296296297 | 49.879 |
| 0.4746412037037037 | 49.881 |
| 0.4746527777777778 | 49.884 |
| 0.47466435185185185 | 49.888 |
| 0.47467592592592595 | 49.891 |
| 0.4746875 | 49.894 |
| 0.474699074074074 | 49.896 |
| 0.4747106481481482 | 49.9 |
| 0.4747222222222222 | 49.901 |
| 0.4747337962962963 | 49.903 |
| 0.47474537037037035 | 49.905 |
| 0.47475694444444444 | 49.905 |
| 0.4747685185185185 | 49.907 |
| 0.47478009259259263 | 49.906 |
| 0.47479166666666667 | 49.907 |
| 0.47480324074074076 | 49.907 |
| 0.4748148148148148 | 49.91 |
| 0.4748263888888889 | 49.911 |
| 0.47483796296296293 | 49.914 |
| 0.4748495370370371 | 49.915 |
| 0.4748611111111111 | 49.916 |
| 0.4748726851851852 | 49.915 |
| 0.47488425925925926 | 49.916 |
| 0.47489583333333335 | 49.913 |
| 0.4749074074074074 | 49.911 |
| 0.47491898148148143 | 49.908 |
| 0.4749305555555556 | 49.906 |
| 0.4749421296296296 | 49.907 |
| 0.4749537037037037 | 49.907 |
| 0.47496527777777775 | 49.908 |
| 0.47497685185185184 | 49.91 |
| 0.4749884259259259 | 49.911 |
| 0.47500000000000003 | 49.913 |
| 0.47501157407407407 | 49.914 |
| 0.47502314814814817 | 49.915 |
| 0.4750347222222222 | 49.916 |
| 0.4750462962962963 | 49.918 |
| 0.47505787037037034 | 49.918 |
| 0.4750694444444445 | 49.917 |
| 0.4750810185185185 | 49.915 |
| 0.4750925925925926 | 49.91 |
| 0.47510416666666666 | 49.908 |
| 0.47511574074074076 | 49.905 |
| 0.4751273148148148 | 49.901 |
| 0.47513888888888883 | 49.901 |
| 0.475150462962963 | 49.9 |
| 0.475162037037037 | 49.9 |
| 0.4751736111111111 | 49.9 |
| 0.47518518518518515 | 49.897 |
| 0.47519675925925925 | 49.895 |
| 0.4752083333333333 | 49.893 |
| 0.47521990740740744 | 49.891 |
| 0.4752314814814815 | 49.889 |
| 0.47524305555555557 | 49.884 |
| 0.4752546296296296 | 49.881 |
| 0.4752662037037037 | 49.878 |
| 0.47527777777777774 | 49.877 |
| 0.4752893518518519 | 49.875 |
| 0.47530092592592593 | 49.875 |
| 0.4753125 | 49.872 |
| 0.47532407407407407 | 49.872 |
| 0.47533564814814816 | 49.874 |
| 0.4753472222222222 | 49.874 |
| 0.47535879629629635 | 49.877 |
| 0.4753703703703704 | 49.877 |
| 0.4753819444444445 | 49.877 |
| 0.4753935185185185 | 49.876 |
| 0.47540509259259256 | 49.877 |
| 0.47541666666666665 | 49.875 |
| 0.4754282407407407 | 49.877 |
| 0.47543981481481484 | 49.876 |
| 0.4754513888888889 | 49.877 |
| 0.475462962962963 | 49.879 |
| 0.475474537037037 | 49.879 |
| 0.4754861111111111 | 49.881 |
| 0.47549768518518515 | 49.882 |
| 0.4755092592592593 | 49.882 |
| 0.47552083333333334 | 49.881 |
| 0.47553240740740743 | 49.882 |
| 0.47554398148148147 | 49.883 |
| 0.47555555555555556 | 49.884 |
| 0.4755671296296296 | 49.885 |
| 0.47557870370370375 | 49.887 |
| 0.4755902777777778 | 49.891 |
| 0.4756018518518519 | 49.894 |
| 0.4756134259259259 | 49.897 |
| 0.47562499999999996 | 49.899 |
| 0.47563657407407406 | 49.9 |
| 0.4756481481481481 | 49.903 |
| 0.47565972222222225 | 49.905 |
| 0.4756712962962963 | 49.906 |
| 0.4756828703703704 | 49.907 |
| 0.4756944444444444 | 49.909 |
| 0.4757060185185185 | 49.911 |
| 0.47571759259259255 | 49.91 |
| 0.4757291666666667 | 49.91 |
| 0.47574074074074074 | 49.909 |
| 0.47575231481481484 | 49.907 |
| 0.4757638888888889 | 49.904 |
| 0.47577546296296297 | 49.899 |
| 0.475787037037037 | 49.897 |
| 0.47579861111111116 | 49.894 |
| 0.4758101851851852 | 49.892 |
| 0.4758217592592593 | 49.893 |
| 0.47583333333333333 | 49.893 |
| 0.47584490740740737 | 49.894 |
| 0.47585648148148146 | 49.897 |
| 0.4758680555555555 | 49.899 |
| 0.47587962962962965 | 49.903 |
| 0.4758912037037037 | 49.906 |
| 0.4759027777777778 | 49.908 |
| 0.4759143518518518 | 49.912 |
| 0.4759259259259259 | 49.914 |
| 0.47593749999999996 | 49.916 |
| 0.4759490740740741 | 49.917 |
| 0.47596064814814815 | 49.919 |
| 0.47597222222222224 | 49.919 |
| 0.4759837962962963 | 49.92 |
| 0.4759953703703704 | 49.92 |
| 0.4760069444444444 | 49.921 |
| 0.47601851851851856 | 49.92 |
| 0.4760300925925926 | 49.921 |
| 0.4760416666666667 | 49.923 |
| 0.47605324074074074 | 49.926 |
| 0.47606481481481483 | 49.928 |
| 0.47607638888888887 | 49.929 |
| 0.476087962962963 | 49.929 |
| 0.47609953703703706 | 49.931 |
| 0.4761111111111111 | 49.931 |
| 0.4761226851851852 | 49.932 |
| 0.47613425925925923 | 49.933 |
| 0.4761458333333333 | 49.933 |
| 0.47615740740740736 | 49.935 |
| 0.4761689814814815 | 49.932 |
| 0.47618055555555555 | 49.931 |
| 0.47619212962962965 | 49.928 |
| 0.4762037037037037 | 49.926 |
| 0.4762152777777778 | 49.923 |
| 0.4762268518518518 | 49.921 |
| 0.47623842592592597 | 49.919 |
| 0.47625 | 49.919 |
| 0.4762615740740741 | 49.917 |
| 0.47627314814814814 | 49.917 |
| 0.47628472222222223 | 49.919 |
| 0.4762962962962963 | 49.919 |
| 0.4763078703703704 | 49.922 |
| 0.47631944444444446 | 49.923 |
| 0.4763310185185185 | 49.925 |
| 0.4763425925925926 | 49.929 |
| 0.47635416666666663 | 49.932 |
| 0.47636574074074073 | 49.932 |
| 0.47637731481481477 | 49.932 |
| 0.4763888888888889 | 49.931 |
| 0.47640046296296296 | 49.93 |
| 0.47641203703703705 | 49.929 |
| 0.4764236111111111 | 49.926 |
| 0.4764351851851852 | 49.926 |
| 0.4764467592592592 | 49.925 |
| 0.4764583333333334 | 49.925 |
| 0.4764699074074074 | 49.923 |
| 0.4764814814814815 | 49.923 |
| 0.47649305555555554 | 49.92 |
| 0.47650462962962964 | 49.916 |
| 0.4765162037037037 | 49.914 |
| 0.47652777777777783 | 49.911 |
| 0.47653935185185187 | 49.908 |
| 0.47655092592592596 | 49.907 |
| 0.4765625 | 49.905 |
| 0.47657407407407404 | 49.904 |
| 0.47658564814814813 | 49.902 |
| 0.47659722222222217 | 49.899 |
| 0.4766087962962963 | 49.895 |
| 0.47662037037037036 | 49.894 |
| 0.47663194444444446 | 49.892 |
| 0.4766435185185185 | 49.89 |
| 0.4766550925925926 | 49.886 |
| 0.4766666666666666 | 49.882 |
| 0.4766782407407408 | 49.878 |
| 0.4766898148148148 | 49.877 |
| 0.4767013888888889 | 49.875 |
| 0.47671296296296295 | 49.874 |
| 0.47672453703703704 | 49.873 |
| 0.4767361111111111 | 49.873 |
| 0.47674768518518523 | 49.873 |
| 0.47675925925925927 | 49.873 |
| 0.47677083333333337 | 49.874 |
| 0.4767824074074074 | 49.876 |
| 0.4767939814814815 | 49.877 |
| 0.47680555555555554 | 49.877 |
| 0.4768171296296296 | 49.878 |
| 0.4768287037037037 | 49.878 |
| 0.47684027777777777 | 49.88 |
| 0.47685185185185186 | 49.877 |
| 0.4768634259259259 | 49.873 |
| 0.476875 | 49.867 |
| 0.47688657407407403 | 49.864 |
| 0.4768981481481482 | 49.86 |
| 0.4769097222222222 | 49.857 |
| 0.4769212962962963 | 49.855 |
| 0.47693287037037035 | 49.852 |
| 0.47694444444444445 | 49.85 |
| 0.4769560185185185 | 49.849 |
| 0.47696759259259264 | 49.848 |
| 0.4769791666666667 | 49.846 |
| 0.47699074074074077 | 49.846 |
| 0.4770023148148148 | 49.844 |
| 0.4770138888888889 | 49.844 |
| 0.47702546296296294 | 49.844 |
| 0.477037037037037 | 49.845 |
| 0.47704861111111113 | 49.845 |
| 0.47706018518518517 | 49.845 |
| 0.47707175925925926 | 49.845 |
| 0.4770833333333333 | 49.844 |
| 0.4770949074074074 | 49.842 |
| 0.47710648148148144 | 49.841 |
| 0.4771180555555556 | 49.841 |
| 0.4771296296296296 | 49.839 |
| 0.4771412037037037 | 49.839 |
| 0.47715277777777776 | 49.839 |
| 0.47716435185185185 | 49.84 |
| 0.4771759259259259 | 49.841 |
| 0.47718750000000004 | 49.842 |
| 0.4771990740740741 | 49.842 |
| 0.4772106481481482 | 49.841 |
| 0.4772222222222222 | 49.839 |
| 0.4772337962962963 | 49.839 |
| 0.47724537037037035 | 49.839 |
| 0.4772569444444445 | 49.839 |
| 0.47726851851851854 | 49.839 |
| 0.47728009259259263 | 49.838 |
| 0.47729166666666667 | 49.837 |
| 0.4773032407407407 | 49.836 |
| 0.4773148148148148 | 49.836 |
| 0.47732638888888884 | 49.835 |
| 0.477337962962963 | 49.835 |
| 0.47734953703703703 | 49.834 |
| 0.4773611111111111 | 49.833 |
| 0.47737268518518516 | 49.832 |
| 0.47738425925925926 | 49.831 |
| 0.4773958333333333 | 49.831 |
| 0.47740740740740745 | 49.831 |
| 0.4774189814814815 | 49.83 |
| 0.4774305555555556 | 49.831 |
| 0.4774421296296296 | 49.831 |
| 0.4774537037037037 | 49.833 |
| 0.47746527777777775 | 49.835 |
| 0.4774768518518519 | 49.835 |
| 0.47748842592592594 | 49.838 |
| 0.47750000000000004 | 49.839 |
| 0.4775115740740741 | 49.839 |
| 0.4775231481481481 | 49.84 |
| 0.4775347222222222 | 49.842 |
| 0.47754629629629625 | 49.845 |
| 0.4775578703703704 | 49.846 |
| 0.47756944444444444 | 49.846 |
| 0.47758101851851853 | 49.846 |
| 0.47759259259259257 | 49.847 |
| 0.47760416666666666 | 49.847 |
| 0.4776157407407407 | 49.846 |
| 0.47762731481481485 | 49.846 |
| 0.4776388888888889 | 49.845 |
| 0.477650462962963 | 49.844 |
| 0.477662037037037 | 49.843 |
| 0.4776736111111111 | 49.842 |
| 0.47768518518518516 | 49.839 |
| 0.4776967592592593 | 49.837 |
| 0.47770833333333335 | 49.836 |
| 0.47771990740740744 | 49.835 |
| 0.4777314814814815 | 49.835 |
| 0.4777430555555555 | 49.836 |
| 0.4777546296296296 | 49.838 |
| 0.47776620370370365 | 49.837 |
| 0.4777777777777778 | 49.838 |
| 0.47778935185185184 | 49.838 |
| 0.47780092592592593 | 49.836 |
| 0.4778125 | 49.836 |
| 0.47782407407407407 | 49.833 |
| 0.4778356481481481 | 49.833 |
| 0.47784722222222226 | 49.831 |
| 0.4778587962962963 | 49.831 |
| 0.4778703703703704 | 49.831 |
| 0.47788194444444443 | 49.829 |
| 0.4778935185185185 | 49.83 |
| 0.47790509259259256 | 49.831 |
| 0.4779166666666667 | 49.833 |
| 0.47792824074074075 | 49.836 |
| 0.47793981481481485 | 49.836 |
| 0.4779513888888889 | 49.838 |
| 0.477962962962963 | 49.839 |
| 0.477974537037037 | 49.839 |
| 0.47798611111111117 | 49.842 |
| 0.4779976851851852 | 49.842 |
| 0.47800925925925924 | 49.843 |
| 0.47802083333333334 | 49.845 |
| 0.4780324074074074 | 49.846 |
| 0.4780439814814815 | 49.847 |
| 0.4780555555555555 | 49.848 |
| 0.47806712962962966 | 49.847 |
| 0.4780787037037037 | 49.848 |
| 0.4780902777777778 | 49.846 |
| 0.47810185185185183 | 49.845 |
| 0.47811342592592593 | 49.843 |
| 0.47812499999999997 | 49.841 |
| 0.4781365740740741 | 49.84 |
| 0.47814814814814816 | 49.836 |
| 0.47815972222222225 | 49.833 |
| 0.4781712962962963 | 49.831 |
| 0.4781828703703704 | 49.829 |
| 0.4781944444444444 | 49.827 |
| 0.47820601851851857 | 49.827 |
| 0.4782175925925926 | 49.827 |
| 0.47822916666666665 | 49.828 |
| 0.47824074074074074 | 49.829 |
| 0.4782523148148148 | 49.83 |
| 0.4782638888888889 | 49.831 |
| 0.4782754629629629 | 49.831 |
| 0.47828703703703707 | 49.832 |
| 0.4782986111111111 | 49.834 |
| 0.4783101851851852 | 49.836 |
| 0.47832175925925924 | 49.838 |
| 0.47833333333333333 | 49.837 |
| 0.47834490740740737 | 49.837 |
| 0.4783564814814815 | 49.828 |
| 0.47836805555555556 | 49.822 |
| 0.47837962962962965 | 49.815 |
| 0.4783912037037037 | 49.81 |
| 0.4784027777777778 | 49.809 |
| 0.4784143518518518 | 49.808 |
| 0.478425925925926 | 49.807 |
| 0.4784375 | 49.805 |
| 0.47844907407407405 | 49.804 |
| 0.47846064814814815 | 49.801 |
| 0.4784722222222222 | 49.801 |
| 0.4784837962962963 | 49.798 |
| 0.4784953703703703 | 49.794 |
| 0.47850694444444447 | 49.79 |
| 0.4785185185185185 | 49.785 |
| 0.4785300925925926 | 49.782 |
| 0.47854166666666664 | 49.778 |
| 0.47855324074074074 | 49.777 |
| 0.4785648148148148 | 49.776 |
| 0.4785763888888889 | 49.776 |
| 0.47858796296296297 | 49.775 |
| 0.47859953703703706 | 49.775 |
| 0.4786111111111111 | 49.774 |
| 0.4786226851851852 | 49.773 |
| 0.47863425925925923 | 49.772 |
| 0.4786458333333334 | 49.771 |
| 0.4786574074074074 | 49.77 |
| 0.4786689814814815 | 49.769 |
| 0.47868055555555555 | 49.769 |
| 0.47869212962962965 | 49.772 |
| 0.4787037037037037 | 49.772 |
| 0.4787152777777777 | 49.773 |
| 0.4787268518518519 | 49.774 |
| 0.4787384259259259 | 49.774 |
| 0.47875 | 49.773 |
| 0.47876157407407405 | 49.773 |
| 0.47877314814814814 | 49.774 |
| 0.4787847222222222 | 49.773 |
| 0.47879629629629633 | 49.773 |
| 0.47880787037037037 | 49.773 |
| 0.47881944444444446 | 49.775 |
| 0.4788310185185185 | 49.776 |
| 0.4788425925925926 | 49.779 |
| 0.47885416666666664 | 49.78 |
| 0.4788657407407408 | 49.781 |
| 0.4788773148148148 | 49.782 |
| 0.4788888888888889 | 49.78 |
| 0.47890046296296296 | 49.777 |
| 0.47891203703703705 | 49.774 |
| 0.4789236111111111 | 49.773 |
| 0.47893518518518513 | 49.772 |
| 0.4789467592592593 | 49.771 |
| 0.4789583333333333 | 49.77 |
| 0.4789699074074074 | 49.77 |
| 0.47898148148148145 | 49.769 |
| 0.47899305555555555 | 49.769 |
| 0.4790046296296296 | 49.766 |
| 0.47901620370370374 | 49.764 |
| 0.4790277777777778 | 49.763 |
| 0.47903935185185187 | 49.763 |
| 0.4790509259259259 | 49.763 |
| 0.4790625 | 49.765 |
| 0.47907407407407404 | 49.764 |
| 0.4790856481481482 | 49.764 |
| 0.47909722222222223 | 49.765 |
| 0.4791087962962963 | 49.766 |
| 0.47912037037037036 | 49.767 |
| 0.47913194444444446 | 49.767 |
| 0.4791435185185185 | 49.768 |
| 0.47915509259259265 | 49.767 |
| 0.4791666666666667 | 49.769 |
| 0.4791782407407407 | 49.767 |
| 0.4791898148148148 | 49.768 |
| 0.47920138888888886 | 49.768 |
| 0.47921296296296295 | 49.767 |
| 0.479224537037037 | 49.768 |
| 0.47923611111111114 | 49.767 |
| 0.4792476851851852 | 49.77 |
| 0.4792592592592593 | 49.772 |
| 0.4792708333333333 | 49.778 |
| 0.4792824074074074 | 49.782 |
| 0.47929398148148145 | 49.786 |
| 0.4793055555555556 | 49.788 |
| 0.47931712962962963 | 49.792 |
| 0.47932870370370373 | 49.796 |
| 0.47934027777777777 | 49.802 |
| 0.47935185185185186 | 49.807 |
| 0.4793634259259259 | 49.813 |
| 0.47937500000000005 | 49.815 |
| 0.4793865740740741 | 49.816 |
| 0.4793981481481482 | 49.817 |
| 0.4794097222222222 | 49.817 |
| 0.47942129629629626 | 49.818 |
| 0.47943287037037036 | 49.818 |
| 0.4794444444444444 | 49.819 |
| 0.47945601851851855 | 49.819 |
| 0.4794675925925926 | 49.82 |
| 0.4794791666666667 | 49.821 |
| 0.4794907407407407 | 49.821 |
| 0.4795023148148148 | 49.823 |
| 0.47951388888888885 | 49.824 |
| 0.479525462962963 | 49.828 |
| 0.47953703703703704 | 49.828 |
| 0.47954861111111113 | 49.83 |
| 0.4795601851851852 | 49.831 |
| 0.47957175925925927 | 49.832 |
| 0.4795833333333333 | 49.833 |
| 0.47959490740740746 | 49.835 |
| 0.4796064814814815 | 49.835 |
| 0.4796180555555556 | 49.837 |
| 0.47962962962962963 | 49.836 |
| 0.47964120370370367 | 49.837 |
| 0.47965277777777776 | 49.837 |
| 0.4796643518518518 | 49.837 |
| 0.47967592592592595 | 49.837 |
| 0.4796875 | 49.837 |
| 0.4796990740740741 | 49.84 |
| 0.4797106481481481 | 49.842 |
| 0.4797222222222222 | 49.845 |
| 0.47973379629629626 | 49.85 |
| 0.4797453703703704 | 49.852 |
| 0.47975694444444444 | 49.855 |
| 0.47976851851851854 | 49.855 |
| 0.4797800925925926 | 49.857 |
| 0.47979166666666667 | 49.855 |
| 0.4798032407407407 | 49.857 |
| 0.47981481481481486 | 49.857 |
| 0.4798263888888889 | 49.857 |
| 0.479837962962963 | 49.857 |
| 0.47984953703703703 | 49.856 |
| 0.4798611111111111 | 49.856 |
| 0.47987268518518517 | 49.854 |
| 0.4798842592592593 | 49.855 |
| 0.47989583333333335 | 49.856 |
| 0.4799074074074074 | 49.858 |
| 0.4799189814814815 | 49.859 |
| 0.4799305555555555 | 49.861 |
| 0.4799421296296296 | 49.861 |
| 0.47995370370370366 | 49.863 |
| 0.4799652777777778 | 49.865 |
| 0.47997685185185185 | 49.869 |
| 0.47998842592592594 | 49.872 |
| 0.48 | 49.874 |
| 0.4800115740740741 | 49.877 |
| 0.4800231481481481 | 49.88 |
| 0.48003472222222227 | 49.881 |
| 0.4800462962962963 | 49.883 |
| 0.4800578703703704 | 49.882 |
| 0.48006944444444444 | 49.883 |
| 0.48008101851851853 | 49.882 |
| 0.48009259259259257 | 49.881 |
| 0.4801041666666667 | 49.879 |
| 0.48011574074074076 | 49.879 |
| 0.4801273148148148 | 49.878 |
| 0.4801388888888889 | 49.879 |
| 0.48015046296296293 | 49.878 |
| 0.480162037037037 | 49.878 |
| 0.48017361111111106 | 49.878 |
| 0.4801851851851852 | 49.876 |
| 0.48019675925925925 | 49.876 |
| 0.48020833333333335 | 49.875 |
| 0.4802199074074074 | 49.875 |
| 0.4802314814814815 | 49.874 |
| 0.4802430555555555 | 49.873 |
| 0.48025462962962967 | 49.87 |
| 0.4802662037037037 | 49.871 |
| 0.4802777777777778 | 49.872 |
| 0.48028935185185184 | 49.873 |
| 0.48030092592592594 | 49.872 |
| 0.4803125 | 49.871 |
| 0.4803240740740741 | 49.873 |
| 0.48033564814814816 | 49.874 |
| 0.4803472222222222 | 49.876 |
| 0.4803587962962963 | 49.879 |
| 0.48037037037037034 | 49.882 |
| 0.48038194444444443 | 49.883 |
| 0.48039351851851847 | 49.885 |
| 0.4804050925925926 | 49.886 |
| 0.48041666666666666 | 49.887 |
| 0.48042824074074075 | 49.89 |
| 0.4804398148148148 | 49.891 |
| 0.4804513888888889 | 49.89 |
| 0.4804629629629629 | 49.89 |
| 0.4804745370370371 | 49.891 |
| 0.4804861111111111 | 49.891 |
| 0.4804976851851852 | 49.891 |
| 0.48050925925925925 | 49.89 |
| 0.48052083333333334 | 49.89 |
| 0.4805324074074074 | 49.889 |
| 0.48054398148148153 | 49.89 |
| 0.48055555555555557 | 49.89 |
| 0.48056712962962966 | 49.889 |
| 0.4805787037037037 | 49.888 |
| 0.48059027777777774 | 49.887 |
| 0.48060185185185184 | 49.886 |
| 0.4806134259259259 | 49.883 |
| 0.480625 | 49.88 |
| 0.48063657407407406 | 49.877 |
| 0.48064814814814816 | 49.876 |
| 0.4806597222222222 | 49.874 |
| 0.4806712962962963 | 49.873 |
| 0.48068287037037033 | 49.874 |
| 0.4806944444444445 | 49.876 |
| 0.4807060185185185 | 49.879 |
| 0.4807175925925926 | 49.883 |
| 0.48072916666666665 | 49.886 |
| 0.48074074074074075 | 49.889 |
| 0.4807523148148148 | 49.89 |
| 0.48076388888888894 | 49.892 |
| 0.480775462962963 | 49.892 |
| 0.48078703703703707 | 49.893 |
| 0.4807986111111111 | 49.893 |
| 0.4808101851851852 | 49.893 |
| 0.48082175925925924 | 49.894 |
| 0.4808333333333333 | 49.895 |
| 0.48084490740740743 | 49.898 |
| 0.48085648148148147 | 49.9 |
| 0.48086805555555556 | 49.902 |
| 0.4808796296296296 | 49.904 |
| 0.4808912037037037 | 49.905 |
| 0.48090277777777773 | 49.906 |
| 0.4809143518518519 | 49.907 |
| 0.4809259259259259 | 49.908 |
| 0.4809375 | 49.909 |
| 0.48094907407407406 | 49.911 |
| 0.48096064814814815 | 49.912 |
| 0.4809722222222222 | 49.913 |
| 0.48098379629629634 | 49.913 |
| 0.4809953703703704 | 49.914 |
| 0.4810069444444445 | 49.913 |
| 0.4810185185185185 | 49.914 |
| 0.4810300925925926 | 49.914 |
| 0.48104166666666665 | 49.915 |
| 0.4810532407407408 | 49.916 |
| 0.48106481481481483 | 49.915 |
| 0.4810763888888889 | 49.918 |
| 0.48108796296296297 | 49.92 |
| 0.481099537037037 | 49.922 |
| 0.4811111111111111 | 49.924 |
| 0.48112268518518514 | 49.927 |
| 0.4811342592592593 | 49.93 |
| 0.48114583333333333 | 49.932 |
| 0.4811574074074074 | 49.934 |
| 0.48116898148148146 | 49.936 |
| 0.48118055555555556 | 49.937 |
| 0.4811921296296296 | 49.938 |
| 0.48120370370370374 | 49.938 |
| 0.4812152777777778 | 49.94 |
| 0.4812268518518519 | 49.94 |
| 0.4812384259259259 | 49.942 |
| 0.48125 | 49.942 |
| 0.48126157407407405 | 49.944 |
| 0.4812731481481482 | 49.945 |
| 0.48128472222222224 | 49.948 |
| 0.48129629629629633 | 49.95 |
| 0.48130787037037037 | 49.949 |
| 0.4813194444444444 | 49.948 |
| 0.4813310185185185 | 49.945 |
| 0.48134259259259254 | 49.944 |
| 0.4813541666666667 | 49.942 |
| 0.48136574074074073 | 49.941 |
| 0.4813773148148148 | 49.941 |
| 0.48138888888888887 | 49.942 |
| 0.48140046296296296 | 49.945 |
| 0.481412037037037 | 49.949 |
| 0.48142361111111115 | 49.954 |
| 0.4814351851851852 | 49.958 |
| 0.4814467592592593 | 49.963 |
| 0.4814583333333333 | 49.965 |
| 0.4814699074074074 | 49.967 |
| 0.48148148148148145 | 49.967 |
| 0.4814930555555556 | 49.968 |
| 0.48150462962962964 | 49.965 |
| 0.48151620370370374 | 49.964 |
| 0.4815277777777778 | 49.962 |
| 0.4815393518518518 | 49.96 |
| 0.4815509259259259 | 49.959 |
| 0.48156249999999995 | 49.958 |
| 0.4815740740740741 | 49.959 |
| 0.48158564814814814 | 49.959 |
| 0.48159722222222223 | 49.959 |
| 0.48160879629629627 | 49.959 |
| 0.48162037037037037 | 49.956 |
| 0.4816319444444444 | 49.955 |
| 0.48164351851851855 | 49.953 |
| 0.4816550925925926 | 49.951 |
| 0.4816666666666667 | 49.95 |
| 0.4816782407407407 | 49.951 |
| 0.4816898148148148 | 49.95 |
| 0.48170138888888886 | 49.951 |
| 0.481712962962963 | 49.953 |
| 0.48172453703703705 | 49.955 |
| 0.48173611111111114 | 49.959 |
| 0.4817476851851852 | 49.962 |
| 0.4817592592592593 | 49.964 |
| 0.4817708333333333 | 49.962 |
| 0.48178240740740735 | 49.961 |
| 0.4817939814814815 | 49.958 |
| 0.48180555555555554 | 49.958 |
| 0.48181712962962964 | 49.958 |
| 0.4818287037037037 | 49.959 |
| 0.48184027777777777 | 49.959 |
| 0.4818518518518518 | 49.958 |
| 0.48186342592592596 | 49.957 |
| 0.481875 | 49.954 |
| 0.4818865740740741 | 49.953 |
| 0.48189814814814813 | 49.951 |
| 0.4819097222222222 | 49.95 |
| 0.48192129629629626 | 49.948 |
| 0.4819328703703704 | 49.944 |
| 0.48194444444444445 | 49.942 |
| 0.48195601851851855 | 49.938 |
| 0.4819675925925926 | 49.936 |
| 0.4819791666666667 | 49.933 |
| 0.4819907407407407 | 49.932 |
| 0.48200231481481487 | 49.933 |
| 0.4820138888888889 | 49.934 |
| 0.48202546296296295 | 49.936 |
| 0.48203703703703704 | 49.938 |
| 0.4820486111111111 | 49.939 |
| 0.4820601851851852 | 49.943 |
| 0.4820717592592592 | 49.945 |
| 0.48208333333333336 | 49.948 |
| 0.4820949074074074 | 49.949 |
| 0.4821064814814815 | 49.951 |
| 0.48211805555555554 | 49.951 |
| 0.48212962962962963 | 49.953 |
| 0.48214120370370367 | 49.955 |
| 0.4821527777777778 | 49.953 |
| 0.48216435185185186 | 49.955 |
| 0.48217592592592595 | 49.954 |
| 0.4821875 | 49.956 |
| 0.4821990740740741 | 49.957 |
| 0.4822106481481481 | 49.959 |
| 0.4822222222222223 | 49.962 |
| 0.4822337962962963 | 49.964 |
| 0.48224537037037035 | 49.966 |
| 0.48225694444444445 | 49.964 |
| 0.4822685185185185 | 49.964 |
| 0.4822800925925926 | 49.964 |
| 0.4822916666666666 | 49.964 |
| 0.48230324074074077 | 49.966 |
| 0.4823148148148148 | 49.967 |
| 0.4823263888888889 | 49.966 |
| 0.48233796296296294 | 49.967 |
| 0.48234953703703703 | 49.967 |
| 0.4823611111111111 | 49.965 |
| 0.4823726851851852 | 49.965 |
| 0.48238425925925926 | 49.962 |
| 0.48239583333333336 | 49.961 |
| 0.4824074074074074 | 49.96 |
| 0.4824189814814815 | 49.958 |
| 0.48243055555555553 | 49.958 |
| 0.4824421296296297 | 49.959 |
| 0.4824537037037037 | 49.959 |
| 0.4824652777777778 | 49.958 |
| 0.48247685185185185 | 49.958 |
| 0.4824884259259259 | 49.957 |
| 0.4825 | 49.953 |
| 0.482511574074074 | 49.952 |
| 0.4825231481481482 | 49.951 |
| 0.4825347222222222 | 49.949 |
| 0.4825462962962963 | 49.95 |
| 0.48255787037037035 | 49.949 |
| 0.48256944444444444 | 49.949 |
| 0.4825810185185185 | 49.95 |
| 0.48259259259259263 | 49.952 |
| 0.48260416666666667 | 49.954 |
| 0.48261574074074076 | 49.957 |
| 0.4826273148148148 | 49.958 |
| 0.4826388888888889 | 49.96 |
| 0.48265046296296293 | 49.962 |
| 0.4826620370370371 | 49.965 |
| 0.4826736111111111 | 49.966 |
| 0.4826851851851852 | 49.969 |
| 0.48269675925925926 | 49.97 |
| 0.48270833333333335 | 49.971 |
| 0.4827199074074074 | 49.972 |
| 0.48273148148148143 | 49.972 |
| 0.4827430555555556 | 49.973 |
| 0.4827546296296296 | 49.973 |
| 0.4827662037037037 | 49.975 |
| 0.48277777777777775 | 49.976 |
| 0.48278935185185184 | 49.977 |
| 0.4828009259259259 | 49.977 |
| 0.48281250000000003 | 49.978 |
| 0.48282407407407407 | 49.98 |
| 0.48283564814814817 | 49.981 |
| 0.4828472222222222 | 49.983 |
| 0.4828587962962963 | 49.982 |
| 0.48287037037037034 | 49.982 |
| 0.4828819444444445 | 49.981 |
| 0.4828935185185185 | 49.981 |
| 0.4829050925925926 | 49.981 |
| 0.48291666666666666 | 49.982 |
| 0.48292824074074076 | 49.985 |
| 0.4829398148148148 | 49.987 |
| 0.48295138888888894 | 49.989 |
| 0.482962962962963 | 49.99 |
| 0.482974537037037 | 49.992 |
| 0.4829861111111111 | 49.995 |
| 0.48299768518518515 | 49.996 |
| 0.48300925925925925 | 49.998 |
| 0.4830208333333333 | 49.997 |
| 0.48303240740740744 | 49.997 |
| 0.4830439814814815 | 49.997 |
| 0.48305555555555557 | 49.997 |
| 0.4830671296296296 | 49.996 |
| 0.4830787037037037 | 49.993 |
| 0.48309027777777774 | 49.991 |
| 0.4831018518518519 | 49.988 |
| 0.48311342592592593 | 49.986 |
| 0.483125 | 49.983 |
| 0.48313657407407407 | 49.984 |
| 0.48314814814814816 | 49.984 |
| 0.4831597222222222 | 49.984 |
| 0.48317129629629635 | 49.984 |
| 0.4831828703703704 | 49.981 |
| 0.4831944444444444 | 49.98 |
| 0.4832060185185185 | 49.979 |
| 0.48321759259259256 | 49.98 |
| 0.48322916666666665 | 49.98 |
| 0.4832407407407407 | 49.981 |
| 0.48325231481481484 | 49.981 |
| 0.4832638888888889 | 49.982 |
| 0.483275462962963 | 49.983 |
| 0.483287037037037 | 49.985 |
| 0.4832986111111111 | 49.987 |
| 0.48331018518518515 | 49.986 |
| 0.4833217592592593 | 49.987 |
| 0.48333333333333334 | 49.987 |
| 0.48334490740740743 | 49.985 |
| 0.48335648148148147 | 49.983 |
| 0.48336805555555556 | 49.98 |
| 0.4833796296296296 | 49.98 |
| 0.48339120370370375 | 49.978 |
| 0.4834027777777778 | 49.977 |
| 0.4834143518518519 | 49.975 |
| 0.4834259259259259 | 49.974 |
| 0.48343749999999996 | 49.973 |
| 0.48344907407407406 | 49.972 |
| 0.4834606481481481 | 49.971 |
| 0.48347222222222225 | 49.97 |
| 0.4834837962962963 | 49.97 |
| 0.4834953703703704 | 49.97 |
| 0.4835069444444444 | 49.971 |
| 0.4835185185185185 | 49.971 |
| 0.48353009259259255 | 49.97 |
| 0.4835416666666667 | 49.971 |
| 0.48355324074074074 | 49.972 |
| 0.48356481481481484 | 49.973 |
| 0.4835763888888889 | 49.974 |
| 0.48358796296296297 | 49.976 |
| 0.483599537037037 | 49.978 |
| 0.48361111111111116 | 49.978 |
| 0.4836226851851852 | 49.979 |
| 0.4836342592592593 | 49.978 |
| 0.48364583333333333 | 49.978 |
| 0.4836574074074074 | 49.976 |
| 0.48366898148148146 | 49.976 |
| 0.4836805555555555 | 49.975 |
| 0.48369212962962965 | 49.973 |
| 0.4837037037037037 | 49.97 |
| 0.4837152777777778 | 49.968 |
| 0.4837268518518518 | 49.961 |
| 0.4837384259259259 | 49.957 |
| 0.48374999999999996 | 49.951 |
| 0.4837615740740741 | 49.947 |
| 0.48377314814814815 | 49.941 |
| 0.48378472222222224 | 49.94 |
| 0.4837962962962963 | 49.939 |
| 0.4838078703703704 | 49.939 |
| 0.4838194444444444 | 49.938 |
| 0.48383101851851856 | 49.939 |
| 0.4838425925925926 | 49.941 |
| 0.4838541666666667 | 49.943 |
| 0.48386574074074074 | 49.947 |
| 0.48387731481481483 | 49.948 |
| 0.48388888888888887 | 49.949 |
| 0.483900462962963 | 49.948 |
| 0.48391203703703706 | 49.949 |
| 0.4839236111111111 | 49.949 |
| 0.4839351851851852 | 49.95 |
| 0.48394675925925923 | 49.952 |
| 0.4839583333333333 | 49.956 |
| 0.48396990740740736 | 49.957 |
| 0.4839814814814815 | 49.956 |
| 0.48399305555555555 | 49.956 |
| 0.48400462962962965 | 49.957 |
| 0.4840162037037037 | 49.959 |
| 0.4840277777777778 | 49.96 |
| 0.4840393518518518 | 49.962 |
| 0.48405092592592597 | 49.966 |
| 0.4840625 | 49.968 |
| 0.4840740740740741 | 49.969 |
| 0.48408564814814814 | 49.97 |
| 0.48409722222222223 | 49.973 |
| 0.4841087962962963 | 49.974 |
| 0.4841203703703704 | 49.976 |
| 0.48413194444444446 | 49.978 |
| 0.4841435185185185 | 49.981 |
| 0.4841550925925926 | 49.984 |
| 0.48416666666666663 | 49.987 |
| 0.48417824074074073 | 49.99 |
| 0.48418981481481477 | 49.991 |
| 0.4842013888888889 | 49.994 |
| 0.48421296296296296 | 49.994 |
| 0.48422453703703705 | 49.995 |
| 0.4842361111111111 | 49.997 |
| 0.4842476851851852 | 49.997 |
| 0.4842592592592592 | 49.996 |
| 0.4842708333333334 | 49.997 |
| 0.4842824074074074 | 49.998 |
| 0.4842939814814815 | 49.998 |
| 0.48430555555555554 | 50 |
| 0.48431712962962964 | 50.001 |
| 0.4843287037037037 | 50.001 |
| 0.48434027777777783 | 50.004 |
| 0.48435185185185187 | 50.005 |
| 0.48436342592592596 | 50.008 |
| 0.484375 | 50.011 |
| 0.48438657407407404 | 50.016 |
| 0.48439814814814813 | 50.019 |
| 0.48440972222222217 | 50.021 |
| 0.4844212962962963 | 50.023 |
| 0.48443287037037036 | 50.025 |
| 0.48444444444444446 | 50.029 |
| 0.4844560185185185 | 50.031 |
| 0.4844675925925926 | 50.034 |
| 0.4844791666666666 | 50.036 |
| 0.4844907407407408 | 50.037 |
| 0.4845023148148148 | 50.037 |
| 0.4845138888888889 | 50.035 |
| 0.48452546296296295 | 50.034 |
| 0.48453703703703704 | 50.031 |
| 0.4845486111111111 | 50.031 |
| 0.48456018518518523 | 50.031 |
| 0.48457175925925927 | 50.032 |
| 0.48458333333333337 | 50.031 |
| 0.4845949074074074 | 50.031 |
| 0.4846064814814815 | 50.029 |
| 0.48461805555555554 | 50.028 |
| 0.4846296296296296 | 50.028 |
| 0.4846412037037037 | 50.028 |
| 0.48465277777777777 | 50.028 |
| 0.48466435185185186 | 50.027 |
| 0.4846759259259259 | 50.026 |
| 0.4846875 | 50.023 |
| 0.48469907407407403 | 50.017 |
| 0.4847106481481482 | 50.009 |
| 0.4847222222222222 | 50.001 |
| 0.4847337962962963 | 49.99 |
| 0.48474537037037035 | 49.979 |
| 0.48475694444444445 | 49.969 |
| 0.4847685185185185 | 49.956 |
| 0.48478009259259264 | 49.948 |
| 0.4847916666666667 | 49.942 |
| 0.48480324074074077 | 49.937 |
| 0.4848148148148148 | 49.933 |
| 0.4848263888888889 | 49.931 |
| 0.48483796296296294 | 49.929 |
| 0.484849537037037 | 49.927 |
| 0.48486111111111113 | 49.928 |
| 0.48487268518518517 | 49.928 |
| 0.48488425925925926 | 49.927 |
| 0.4848958333333333 | 49.926 |
| 0.4849074074074074 | 49.929 |
| 0.48491898148148144 | 49.931 |
| 0.4849305555555556 | 49.934 |
| 0.4849421296296296 | 49.937 |
| 0.4849537037037037 | 49.941 |
| 0.48496527777777776 | 49.943 |
| 0.48497685185185185 | 49.943 |
| 0.4849884259259259 | 49.943 |
| 0.48500000000000004 | 49.946 |
| 0.4850115740740741 | 49.948 |
| 0.4850231481481482 | 49.953 |
| 0.4850347222222222 | 49.954 |
| 0.4850462962962963 | 49.957 |
| 0.48505787037037035 | 49.957 |
| 0.4850694444444445 | 49.958 |
| 0.48508101851851854 | 49.958 |
| 0.4850925925925926 | 49.956 |
| 0.48510416666666667 | 49.955 |
| 0.4851157407407407 | 49.954 |
| 0.4851273148148148 | 49.952 |
| 0.48513888888888884 | 49.953 |
| 0.485150462962963 | 49.954 |
| 0.48516203703703703 | 49.956 |
| 0.4851736111111111 | 49.958 |
| 0.48518518518518516 | 49.959 |
| 0.48519675925925926 | 49.96 |
| 0.4852083333333333 | 49.961 |
| 0.48521990740740745 | 49.963 |
| 0.4852314814814815 | 49.963 |
| 0.4852430555555556 | 49.96 |
| 0.4852546296296296 | 49.958 |
| 0.4852662037037037 | 49.957 |
| 0.48527777777777775 | 49.956 |
| 0.4852893518518519 | 49.956 |
| 0.48530092592592594 | 49.955 |
| 0.48531250000000004 | 49.955 |
| 0.4853240740740741 | 49.955 |
| 0.4853356481481481 | 49.956 |
| 0.4853472222222222 | 49.956 |
| 0.48535879629629625 | 49.956 |
| 0.4853703703703704 | 49.955 |
| 0.48538194444444444 | 49.952 |
| 0.48539351851851853 | 49.952 |
| 0.48540509259259257 | 49.951 |
| 0.48541666666666666 | 49.951 |
| 0.4854282407407407 | 49.947 |
| 0.48543981481481485 | 49.941 |
| 0.4854513888888889 | 49.937 |
| 0.485462962962963 | 49.933 |
| 0.485474537037037 | 49.931 |
| 0.4854861111111111 | 49.928 |
| 0.48549768518518516 | 49.927 |
| 0.4855092592592593 | 49.927 |
| 0.48552083333333335 | 49.925 |
| 0.48553240740740744 | 49.926 |
| 0.4855439814814815 | 49.925 |
| 0.4855555555555556 | 49.923 |
| 0.4855671296296296 | 49.922 |
| 0.48557870370370365 | 49.921 |
| 0.4855902777777778 | 49.92 |
| 0.48560185185185184 | 49.92 |
| 0.48561342592592593 | 49.92 |
| 0.485625 | 49.92 |
| 0.48563657407407407 | 49.92 |
| 0.4856481481481481 | 49.922 |
| 0.48565972222222226 | 49.923 |
| 0.4856712962962963 | 49.923 |
| 0.4856828703703704 | 49.925 |
| 0.48569444444444443 | 49.925 |
| 0.4857060185185185 | 49.922 |
| 0.48571759259259256 | 49.921 |
| 0.4857291666666667 | 49.916 |
| 0.48574074074074075 | 49.915 |
| 0.48575231481481485 | 49.913 |
| 0.4857638888888889 | 49.914 |
| 0.485775462962963 | 49.914 |
| 0.485787037037037 | 49.913 |
| 0.48579861111111106 | 49.911 |
| 0.4858101851851852 | 49.912 |
| 0.48582175925925924 | 49.912 |
| 0.48583333333333334 | 49.914 |
| 0.4858449074074074 | 49.915 |
| 0.4858564814814815 | 49.916 |
| 0.4858680555555555 | 49.918 |
| 0.48587962962962966 | 49.919 |
| 0.4858912037037037 | 49.92 |
| 0.4859027777777778 | 49.923 |
| 0.48591435185185183 | 49.924 |
| 0.48592592592592593 | 49.927 |
| 0.48593749999999997 | 49.928 |
| 0.4859490740740741 | 49.929 |
| 0.48596064814814816 | 49.931 |
| 0.48597222222222225 | 49.933 |
| 0.4859837962962963 | 49.935 |
| 0.4859953703703704 | 49.938 |
| 0.4860069444444444 | 49.939 |
| 0.48601851851851857 | 49.94 |
| 0.4860300925925926 | 49.939 |
| 0.48604166666666665 | 49.935 |
| 0.48605324074074074 | 49.933 |
| 0.4860648148148148 | 49.93 |
| 0.4860763888888889 | 49.927 |
| 0.4860879629629629 | 49.924 |
| 0.48609953703703707 | 49.922 |
| 0.4861111111111111 | 49.919 |
| 0.4861226851851852 | 49.916 |
| 0.48613425925925924 | 49.917 |
| 0.48614583333333333 | 49.919 |
| 0.48615740740740737 | 49.921 |
| 0.4861689814814815 | 49.922 |
| 0.48618055555555556 | 49.925 |
| 0.48619212962962965 | 49.927 |
| 0.4862037037037037 | 49.928 |
| 0.4862152777777778 | 49.93 |
| 0.4862268518518518 | 49.931 |
| 0.486238425925926 | 49.932 |
| 0.48625 | 49.931 |
| 0.4862615740740741 | 49.932 |
| 0.48627314814814815 | 49.932 |
| 0.4862847222222222 | 49.93 |
| 0.4862962962962963 | 49.93 |
| 0.4863078703703703 | 49.93 |
| 0.48631944444444447 | 49.928 |
| 0.4863310185185185 | 49.927 |
| 0.4863425925925926 | 49.925 |
| 0.48635416666666664 | 49.926 |
| 0.48636574074074074 | 49.927 |
| 0.4863773148148148 | 49.929 |
| 0.4863888888888889 | 49.929 |
| 0.48640046296296297 | 49.931 |
| 0.48641203703703706 | 49.93 |
| 0.4864236111111111 | 49.929 |
| 0.4864351851851852 | 49.928 |
| 0.48644675925925923 | 49.929 |
| 0.4864583333333334 | 49.929 |
| 0.4864699074074074 | 49.93 |
| 0.4864814814814815 | 49.932 |
| 0.48649305555555555 | 49.934 |
| 0.48650462962962965 | 49.934 |
| 0.4865162037037037 | 49.935 |
| 0.4865277777777777 | 49.937 |
| 0.4865393518518519 | 49.938 |
| 0.4865509259259259 | 49.94 |
| 0.4865625 | 49.941 |
| 0.48657407407407405 | 49.945 |
| 0.48658564814814814 | 49.947 |
| 0.4865972222222222 | 49.949 |
| 0.48660879629629633 | 49.951 |
| 0.48662037037037037 | 49.954 |
| 0.48663194444444446 | 49.956 |
| 0.4866435185185185 | 49.958 |
| 0.4866550925925926 | 49.962 |
| 0.48666666666666664 | 49.963 |
| 0.4866782407407408 | 49.962 |
| 0.4866898148148148 | 49.964 |
| 0.4867013888888889 | 49.964 |
| 0.48671296296296296 | 49.966 |
| 0.48672453703703705 | 49.967 |
| 0.4867361111111111 | 49.97 |
| 0.48674768518518513 | 49.971 |
| 0.4867592592592593 | 49.971 |
| 0.4867708333333333 | 49.973 |
| 0.4867824074074074 | 49.972 |
| 0.48679398148148145 | 49.971 |
| 0.48680555555555555 | 49.972 |
| 0.4868171296296296 | 49.97 |
| 0.48682870370370374 | 49.97 |
| 0.4868402777777778 | 49.968 |
| 0.48685185185185187 | 49.965 |
| 0.4868634259259259 | 49.962 |
| 0.486875 | 49.96 |
| 0.48688657407407404 | 49.957 |
| 0.4868981481481482 | 49.955 |
| 0.48690972222222223 | 49.953 |
| 0.4869212962962963 | 49.951 |
| 0.48693287037037036 | 49.95 |
| 0.48694444444444446 | 49.95 |
| 0.4869560185185185 | 49.95 |
| 0.48696759259259265 | 49.95 |
| 0.4869791666666667 | 49.948 |
| 0.4869907407407407 | 49.947 |
| 0.4870023148148148 | 49.946 |
| 0.48701388888888886 | 49.946 |
| 0.48702546296296295 | 49.942 |
| 0.487037037037037 | 49.941 |
| 0.48704861111111114 | 49.942 |
| 0.4870601851851852 | 49.941 |
| 0.4870717592592593 | 49.944 |
| 0.4870833333333333 | 49.945 |
| 0.4870949074074074 | 49.949 |
| 0.48710648148148145 | 49.951 |
| 0.4871180555555556 | 49.955 |
| 0.48712962962962963 | 49.958 |
| 0.48714120370370373 | 49.963 |
| 0.48715277777777777 | 49.969 |
| 0.48716435185185186 | 49.974 |
| 0.4871759259259259 | 49.979 |
| 0.48718750000000005 | 49.981 |
| 0.4871990740740741 | 49.984 |
| 0.4872106481481482 | 49.986 |
| 0.4872222222222222 | 49.987 |
| 0.48723379629629626 | 49.989 |
| 0.48724537037037036 | 49.989 |
| 0.4872569444444444 | 49.988 |
| 0.48726851851851855 | 49.991 |
| 0.4872800925925926 | 49.99 |
| 0.4872916666666667 | 49.991 |
| 0.4873032407407407 | 49.991 |
| 0.4873148148148148 | 49.988 |
| 0.48732638888888885 | 49.985 |
| 0.487337962962963 | 49.981 |
| 0.48734953703703704 | 49.974 |
| 0.48736111111111113 | 49.968 |
| 0.4873726851851852 | 49.963 |
| 0.48738425925925927 | 49.957 |
| 0.4873958333333333 | 49.952 |
| 0.48740740740740746 | 49.947 |
| 0.4874189814814815 | 49.941 |
| 0.4874305555555556 | 49.937 |
| 0.48744212962962963 | 49.935 |
| 0.48745370370370367 | 49.932 |
| 0.48746527777777776 | 49.932 |
| 0.4874768518518518 | 49.931 |
| 0.48748842592592595 | 49.931 |
| 0.4875 | 49.93 |
| 0.4875115740740741 | 49.931 |
| 0.4875231481481481 | 49.929 |
| 0.4875347222222222 | 49.928 |
| 0.48754629629629626 | 49.928 |
| 0.4875578703703704 | 49.927 |
| 0.48756944444444444 | 49.927 |
| 0.48758101851851854 | 49.929 |
| 0.4875925925925926 | 49.93 |
| 0.48760416666666667 | 49.932 |
| 0.4876157407407407 | 49.934 |
| 0.48762731481481486 | 49.938 |
| 0.4876388888888889 | 49.942 |
| 0.487650462962963 | 49.946 |
| 0.48766203703703703 | 49.949 |
| 0.4876736111111111 | 49.949 |
| 0.48768518518518517 | 49.951 |
| 0.4876967592592592 | 49.953 |
| 0.48770833333333335 | 49.954 |
| 0.4877199074074074 | 49.956 |
| 0.4877314814814815 | 49.956 |
| 0.4877430555555555 | 49.956 |
| 0.4877546296296296 | 49.957 |
| 0.48776620370370366 | 49.956 |
| 0.4877777777777778 | 49.957 |
| 0.48778935185185185 | 49.957 |
| 0.48780092592592594 | 49.958 |
| 0.4878125 | 49.958 |
| 0.4878240740740741 | 49.959 |
| 0.4878356481481481 | 49.958 |
| 0.48784722222222227 | 49.958 |
| 0.4878587962962963 | 49.958 |
| 0.4878703703703704 | 49.957 |
| 0.48788194444444444 | 49.959 |
| 0.48789351851851853 | 49.961 |
| 0.48790509259259257 | 49.962 |
| 0.4879166666666667 | 49.961 |
| 0.48792824074074076 | 49.958 |
| 0.4879398148148148 | 49.96 |
| 0.4879513888888889 | 49.961 |
| 0.48796296296296293 | 49.962 |
| 0.487974537037037 | 49.964 |
| 0.48798611111111106 | 49.966 |
| 0.4879976851851852 | 49.968 |
| 0.48800925925925925 | 49.968 |
| 0.48802083333333335 | 49.968 |
| 0.4880324074074074 | 49.969 |
| 0.4880439814814815 | 49.969 |
| 0.4880555555555555 | 49.969 |
| 0.48806712962962967 | 49.97 |
| 0.4880787037037037 | 49.971 |
| 0.4880902777777778 | 49.973 |
| 0.48810185185185184 | 49.973 |
| 0.48811342592592594 | 49.973 |
| 0.488125 | 49.974 |
| 0.4881365740740741 | 49.974 |
| 0.48814814814814816 | 49.976 |
| 0.48815972222222226 | 49.98 |
| 0.4881712962962963 | 49.983 |
| 0.48818287037037034 | 49.985 |
| 0.48819444444444443 | 49.989 |
| 0.48820601851851847 | 49.989 |
| 0.4882175925925926 | 49.989 |
| 0.48822916666666666 | 49.99 |
| 0.48824074074074075 | 49.99 |
| 0.4882523148148148 | 49.988 |
| 0.4882638888888889 | 49.988 |
| 0.4882754629629629 | 49.989 |
| 0.4882870370370371 | 49.991 |
| 0.4882986111111111 | 49.994 |
| 0.4883101851851852 | 49.995 |
| 0.48832175925925925 | 49.997 |
| 0.48833333333333334 | 49.998 |
| 0.4883449074074074 | 50 |
| 0.48835648148148153 | 50.001 |
| 0.48836805555555557 | 50.001 |
| 0.48837962962962966 | 50.002 |
| 0.4883912037037037 | 50.004 |
| 0.48840277777777774 | 50.006 |
| 0.48841435185185184 | 50.009 |
| 0.4884259259259259 | 50.011 |
| 0.4884375 | 50.011 |
| 0.48844907407407406 | 50.011 |
| 0.48846064814814816 | 50.011 |
| 0.4884722222222222 | 50.01 |
| 0.4884837962962963 | 50.006 |
| 0.48849537037037033 | 50.004 |
| 0.4885069444444445 | 50.001 |
| 0.4885185185185185 | 49.998 |
| 0.4885300925925926 | 49.995 |
| 0.48854166666666665 | 49.992 |
| 0.48855324074074075 | 49.989 |
| 0.4885648148148148 | 49.987 |
| 0.48857638888888894 | 49.985 |
| 0.488587962962963 | 49.982 |
| 0.48859953703703707 | 49.978 |
| 0.4886111111111111 | 49.978 |
| 0.4886226851851852 | 49.977 |
| 0.48863425925925924 | 49.975 |
| 0.4886458333333333 | 49.976 |
| 0.48865740740740743 | 49.978 |
| 0.48866898148148147 | 49.979 |
| 0.48868055555555556 | 49.979 |
| 0.4886921296296296 | 49.981 |
| 0.4887037037037037 | 49.981 |
| 0.48871527777777773 | 49.982 |
| 0.4887268518518519 | 49.983 |
| 0.4887384259259259 | 49.984 |
| 0.48875 | 49.985 |
| 0.48876157407407406 | 49.985 |
| 0.48877314814814815 | 49.985 |
| 0.4887847222222222 | 49.986 |
| 0.48879629629629634 | 49.988 |
| 0.4888078703703704 | 49.988 |
| 0.4888194444444445 | 49.988 |
| 0.4888310185185185 | 49.988 |
| 0.4888425925925926 | 49.989 |
| 0.48885416666666665 | 49.987 |
| 0.4888657407407408 | 49.989 |
| 0.48887731481481483 | 49.989 |
| 0.4888888888888889 | 49.989 |
| 0.48890046296296297 | 49.988 |
| 0.488912037037037 | 49.99 |
| 0.4889236111111111 | 49.991 |
| 0.48893518518518514 | 49.992 |
| 0.4889467592592593 | 49.994 |
| 0.48895833333333333 | 49.994 |
| 0.4889699074074074 | 49.996 |
| 0.48898148148148146 | 49.997 |
| 0.48899305555555556 | 49.997 |
| 0.4890046296296296 | 49.996 |
| 0.48901620370370374 | 49.996 |
| 0.4890277777777778 | 49.994 |
| 0.4890393518518519 | 49.993 |
| 0.4890509259259259 | 49.993 |
| 0.4890625 | 49.99 |
| 0.48907407407407405 | 49.99 |
| 0.4890856481481482 | 49.991 |
| 0.48909722222222224 | 49.99 |
| 0.48910879629629633 | 49.992 |
| 0.48912037037037037 | 49.994 |
| 0.4891319444444444 | 49.993 |
| 0.4891435185185185 | 49.995 |
| 0.48915509259259254 | 49.995 |
| 0.4891666666666667 | 49.997 |
| 0.48917824074074073 | 49.999 |
| 0.4891898148148148 | 50.001 |
| 0.48920138888888887 | 50 |
| 0.48921296296296296 | 50 |
| 0.489224537037037 | 49.999 |
| 0.48923611111111115 | 49.996 |
| 0.4892476851851852 | 49.995 |
| 0.4892592592592593 | 49.99 |
| 0.4892708333333333 | 49.989 |
| 0.4892824074074074 | 49.985 |
| 0.48929398148148145 | 49.981 |
| 0.4893055555555556 | 49.978 |
| 0.48931712962962964 | 49.976 |
| 0.48932870370370374 | 49.974 |
| 0.4893402777777778 | 49.971 |
| 0.4893518518518518 | 49.97 |
| 0.4893634259259259 | 49.968 |
| 0.48937499999999995 | 49.965 |
| 0.4893865740740741 | 49.962 |
| 0.48939814814814814 | 49.96 |
| 0.48940972222222223 | 49.957 |
| 0.48942129629629627 | 49.956 |
| 0.48943287037037037 | 49.955 |
| 0.4894444444444444 | 49.953 |
| 0.48945601851851855 | 49.952 |
| 0.4894675925925926 | 49.948 |
| 0.4894791666666667 | 49.946 |
| 0.4894907407407407 | 49.943 |
| 0.4895023148148148 | 49.941 |
| 0.48951388888888886 | 49.942 |
| 0.489525462962963 | 49.942 |
| 0.48953703703703705 | 49.943 |
| 0.48954861111111114 | 49.943 |
| 0.4895601851851852 | 49.944 |
| 0.4895717592592593 | 49.945 |
| 0.4895833333333333 | 49.947 |
| 0.48959490740740735 | 49.948 |
| 0.4896064814814815 | 49.947 |
| 0.48961805555555554 | 49.949 |
| 0.48962962962962964 | 49.952 |
| 0.4896412037037037 | 49.955 |
| 0.48965277777777777 | 49.957 |
| 0.4896643518518518 | 49.959 |
| 0.48967592592592596 | 49.962 |
| 0.4896875 | 49.964 |
| 0.4896990740740741 | 49.965 |
| 0.48971064814814813 | 49.967 |
| 0.4897222222222222 | 49.969 |
| 0.48973379629629626 | 49.968 |
| 0.4897453703703704 | 49.969 |
| 0.48975694444444445 | 49.968 |
| 0.48976851851851855 | 49.97 |
| 0.4897800925925926 | 49.97 |
| 0.4897916666666667 | 49.972 |
| 0.4898032407407407 | 49.974 |
| 0.48981481481481487 | 49.976 |
| 0.4898263888888889 | 49.976 |
| 0.48983796296296295 | 49.974 |
| 0.48984953703703704 | 49.97 |
| 0.4898611111111111 | 49.968 |
| 0.4898726851851852 | 49.968 |
| 0.4898842592592592 | 49.967 |
| 0.48989583333333336 | 49.967 |
| 0.4899074074074074 | 49.967 |
| 0.4899189814814815 | 49.966 |
| 0.48993055555555554 | 49.966 |
| 0.48994212962962963 | 49.965 |
| 0.48995370370370367 | 49.963 |
| 0.4899652777777778 | 49.959 |
| 0.48997685185185186 | 49.955 |
| 0.48998842592592595 | 49.951 |
| 0.49 | 49.949 |
| 0.4900115740740741 | 49.945 |
| 0.4900231481481481 | 49.942 |
| 0.4900347222222223 | 49.937 |
| 0.4900462962962963 | 49.935 |
| 0.49005787037037035 | 49.934 |
| 0.49006944444444445 | 49.934 |
| 0.4900810185185185 | 49.935 |
| 0.4900925925925926 | 49.936 |
| 0.4901041666666666 | 49.938 |
| 0.49011574074074077 | 49.939 |
| 0.4901273148148148 | 49.942 |
| 0.4901388888888889 | 49.942 |
| 0.49015046296296294 | 49.943 |
| 0.49016203703703703 | 49.942 |
| 0.4901736111111111 | 49.942 |
| 0.4901851851851852 | 49.941 |
| 0.49019675925925926 | 49.938 |
| 0.49020833333333336 | 49.936 |
| 0.4902199074074074 | 49.933 |
| 0.4902314814814815 | 49.932 |
| 0.49024305555555553 | 49.931 |
| 0.4902546296296297 | 49.93 |
| 0.4902662037037037 | 49.93 |
| 0.4902777777777778 | 49.928 |
| 0.49028935185185185 | 49.928 |
| 0.4903009259259259 | 49.925 |
| 0.4903125 | 49.925 |
| 0.490324074074074 | 49.924 |
| 0.4903356481481482 | 49.924 |
| 0.4903472222222222 | 49.923 |
| 0.4903587962962963 | 49.922 |
| 0.49037037037037035 | 49.92 |
| 0.49038194444444444 | 49.918 |
| 0.4903935185185185 | 49.917 |
| 0.49040509259259263 | 49.915 |
| 0.49041666666666667 | 49.911 |
| 0.49042824074074076 | 49.907 |
| 0.4904398148148148 | 49.906 |
| 0.4904513888888889 | 49.905 |
| 0.49046296296296293 | 49.907 |
| 0.4904745370370371 | 49.908 |
| 0.4904861111111111 | 49.91 |
| 0.4904976851851852 | 49.911 |
| 0.49050925925925926 | 49.912 |
| 0.49052083333333335 | 49.911 |
| 0.4905324074074074 | 49.911 |
| 0.49054398148148143 | 49.91 |
| 0.4905555555555556 | 49.91 |
| 0.4905671296296296 | 49.91 |
| 0.4905787037037037 | 49.91 |
| 0.49059027777777775 | 49.909 |
| 0.49060185185185184 | 49.91 |
| 0.4906134259259259 | 49.91 |
| 0.49062500000000003 | 49.911 |
| 0.49063657407407407 | 49.909 |
| 0.49064814814814817 | 49.91 |
| 0.4906597222222222 | 49.91 |
| 0.4906712962962963 | 49.912 |
| 0.49068287037037034 | 49.913 |
| 0.4906944444444445 | 49.916 |
| 0.4907060185185185 | 49.919 |
| 0.4907175925925926 | 49.923 |
| 0.49072916666666666 | 49.927 |
| 0.49074074074074076 | 49.93 |
| 0.4907523148148148 | 49.933 |
| 0.49076388888888894 | 49.937 |
| 0.490775462962963 | 49.939 |
| 0.490787037037037 | 49.942 |
| 0.4907986111111111 | 49.944 |
| 0.49081018518518515 | 49.945 |
| 0.49082175925925925 | 49.947 |
| 0.4908333333333333 | 49.947 |
| 0.49084490740740744 | 49.947 |
| 0.4908564814814815 | 49.947 |
| 0.49086805555555557 | 49.945 |
| 0.4908796296296296 | 49.945 |
| 0.4908912037037037 | 49.945 |
| 0.49090277777777774 | 49.945 |
| 0.4909143518518519 | 49.944 |
| 0.49092592592592593 | 49.944 |
| 0.4909375 | 49.943 |
| 0.49094907407407407 | 49.943 |
| 0.49096064814814816 | 49.942 |
| 0.4909722222222222 | 49.941 |
| 0.49098379629629635 | 49.94 |
| 0.4909953703703704 | 49.939 |
| 0.4910069444444444 | 49.94 |
| 0.4910185185185185 | 49.942 |
| 0.49103009259259256 | 49.943 |
| 0.49104166666666665 | 49.945 |
| 0.4910532407407407 | 49.945 |
| 0.49106481481481484 | 49.947 |
| 0.4910763888888889 | 49.949 |
| 0.491087962962963 | 49.951 |
| 0.491099537037037 | 49.954 |
| 0.4911111111111111 | 49.958 |
| 0.49112268518518515 | 49.963 |
| 0.4911342592592593 | 49.966 |
| 0.49114583333333334 | 49.968 |
| 0.49115740740740743 | 49.969 |
| 0.49116898148148147 | 49.968 |
| 0.49118055555555556 | 49.968 |
| 0.4911921296296296 | 49.968 |
| 0.49120370370370375 | 49.965 |
| 0.4912152777777778 | 49.964 |
| 0.4912268518518519 | 49.962 |
| 0.4912384259259259 | 49.962 |
| 0.49124999999999996 | 49.961 |
| 0.49126157407407406 | 49.96 |
| 0.4912731481481481 | 49.961 |
| 0.49128472222222225 | 49.962 |
| 0.4912962962962963 | 49.963 |
| 0.4913078703703704 | 49.963 |
| 0.4913194444444444 | 49.964 |
| 0.4913310185185185 | 49.965 |
| 0.49134259259259255 | 49.965 |
| 0.4913541666666667 | 49.965 |
| 0.49136574074074074 | 49.965 |
| 0.49137731481481484 | 49.965 |
| 0.4913888888888889 | 49.965 |
| 0.49140046296296297 | 49.964 |
| 0.491412037037037 | 49.964 |
| 0.49142361111111116 | 49.962 |
| 0.4914351851851852 | 49.96 |
| 0.4914467592592593 | 49.958 |
| 0.49145833333333333 | 49.956 |
| 0.4914699074074074 | 49.955 |
| 0.49148148148148146 | 49.954 |
| 0.4914930555555555 | 49.954 |
| 0.49150462962962965 | 49.955 |
| 0.4915162037037037 | 49.955 |
| 0.4915277777777778 | 49.957 |
| 0.4915393518518518 | 49.958 |
| 0.4915509259259259 | 49.961 |
| 0.49156249999999996 | 49.963 |
| 0.4915740740740741 | 49.966 |
| 0.49158564814814815 | 49.968 |
| 0.49159722222222224 | 49.972 |
| 0.4916087962962963 | 49.978 |
| 0.4916203703703704 | 49.983 |
| 0.4916319444444444 | 49.986 |
| 0.49164351851851856 | 49.987 |
| 0.4916550925925926 | 49.987 |
| 0.4916666666666667 | 49.987 |
| 0.49167824074074074 | 49.985 |
| 0.49168981481481483 | 49.986 |
| 0.49170138888888887 | 49.983 |
| 0.491712962962963 | 49.982 |
| 0.49172453703703706 | 49.982 |
| 0.4917361111111111 | 49.98 |
| 0.4917476851851852 | 49.979 |
| 0.49175925925925923 | 49.978 |
| 0.4917708333333333 | 49.977 |
| 0.49178240740740736 | 49.977 |
| 0.4917939814814815 | 49.976 |
| 0.49180555555555555 | 49.976 |
| 0.49181712962962965 | 49.975 |
| 0.4918287037037037 | 49.975 |
| 0.4918402777777778 | 49.974 |
| 0.4918518518518518 | 49.975 |
| 0.49186342592592597 | 49.975 |
| 0.491875 | 49.974 |
| 0.4918865740740741 | 49.975 |
| 0.49189814814814814 | 49.974 |
| 0.49190972222222223 | 49.972 |
| 0.4919212962962963 | 49.974 |
| 0.4919328703703704 | 49.974 |
| 0.49194444444444446 | 49.975 |
| 0.4919560185185185 | 49.974 |
| 0.4919675925925926 | 49.976 |
| 0.49197916666666663 | 49.976 |
| 0.49199074074074073 | 49.975 |
| 0.49200231481481477 | 49.974 |
| 0.4920138888888889 | 49.974 |
| 0.49202546296296296 | 49.973 |
| 0.49203703703703705 | 49.973 |
| 0.4920486111111111 | 49.972 |
| 0.4920601851851852 | 49.974 |
| 0.4920717592592592 | 49.974 |
| 0.4920833333333334 | 49.975 |
| 0.4920949074074074 | 49.977 |
| 0.4921064814814815 | 49.978 |
| 0.49211805555555554 | 49.98 |
| 0.49212962962962964 | 49.981 |
| 0.4921412037037037 | 49.981 |
| 0.49215277777777783 | 49.979 |
| 0.49216435185185187 | 49.978 |
| 0.49217592592592596 | 49.98 |
| 0.4921875 | 49.983 |
| 0.49219907407407404 | 49.985 |
| 0.49221064814814813 | 49.988 |
| 0.49222222222222217 | 49.991 |
| 0.4922337962962963 | 49.992 |
| 0.49224537037037036 | 49.994 |
| 0.49225694444444446 | 49.995 |
| 0.4922685185185185 | 49.997 |
| 0.4922800925925926 | 49.997 |
| 0.4922916666666666 | 49.995 |
| 0.4923032407407408 | 49.994 |
| 0.4923148148148148 | 49.992 |
| 0.4923263888888889 | 49.991 |
| 0.49233796296296295 | 49.989 |
| 0.49234953703703704 | 49.987 |
| 0.4923611111111111 | 49.985 |
| 0.49237268518518523 | 49.984 |
| 0.49238425925925927 | 49.98 |
| 0.49239583333333337 | 49.978 |
| 0.4924074074074074 | 49.975 |
| 0.4924189814814815 | 49.972 |
| 0.49243055555555554 | 49.969 |
| 0.4924421296296296 | 49.965 |
| 0.4924537037037037 | 49.962 |
| 0.49246527777777777 | 49.959 |
| 0.49247685185185186 | 49.957 |
| 0.4924884259259259 | 49.957 |
| 0.4925 | 49.956 |
| 0.49251157407407403 | 49.955 |
| 0.4925231481481482 | 49.955 |
| 0.4925347222222222 | 49.955 |
| 0.4925462962962963 | 49.955 |
| 0.49255787037037035 | 49.955 |
| 0.49256944444444445 | 49.954 |
| 0.4925810185185185 | 49.955 |
| 0.49259259259259264 | 49.957 |
| 0.4926041666666667 | 49.959 |
| 0.49261574074074077 | 49.959 |
| 0.4926273148148148 | 49.96 |
| 0.4926388888888889 | 49.961 |
| 0.49265046296296294 | 49.962 |
| 0.492662037037037 | 49.965 |
| 0.49267361111111113 | 49.965 |
| 0.49268518518518517 | 49.967 |
| 0.49269675925925926 | 49.969 |
| 0.4927083333333333 | 49.971 |
| 0.4927199074074074 | 49.973 |
| 0.49273148148148144 | 49.973 |
| 0.4927430555555556 | 49.973 |
| 0.4927546296296296 | 49.972 |
| 0.4927662037037037 | 49.972 |
| 0.49277777777777776 | 49.972 |
| 0.49278935185185185 | 49.972 |
| 0.4928009259259259 | 49.971 |
| 0.49281250000000004 | 49.971 |
| 0.4928240740740741 | 49.971 |
| 0.4928356481481482 | 49.97 |
| 0.4928472222222222 | 49.971 |
| 0.4928587962962963 | 49.972 |
| 0.49287037037037035 | 49.974 |
| 0.4928819444444445 | 49.975 |
| 0.49289351851851854 | 49.979 |
| 0.4929050925925926 | 49.98 |
| 0.49291666666666667 | 49.983 |
| 0.4929282407407407 | 49.985 |
| 0.4929398148148148 | 49.987 |
| 0.49295138888888884 | 49.991 |
| 0.492962962962963 | 49.992 |
| 0.49297453703703703 | 49.996 |
| 0.4929861111111111 | 50 |
| 0.49299768518518516 | 50.003 |
| 0.49300925925925926 | 50.007 |
| 0.4930208333333333 | 50.01 |
| 0.49303240740740745 | 50.012 |
| 0.4930439814814815 | 50.012 |
| 0.4930555555555556 | 50.014 |
| 0.4930671296296296 | 50.015 |
| 0.4930787037037037 | 50.015 |
| 0.49309027777777775 | 50.014 |
| 0.4931018518518519 | 50.013 |
| 0.49311342592592594 | 50.012 |
| 0.49312500000000004 | 50.011 |
| 0.4931365740740741 | 50.011 |
| 0.4931481481481481 | 50.008 |
| 0.4931597222222222 | 50.005 |
| 0.49317129629629625 | 50.002 |
| 0.4931828703703704 | 49.999 |
| 0.49319444444444444 | 49.995 |
| 0.49320601851851853 | 49.992 |
| 0.49321759259259257 | 49.988 |
| 0.49322916666666666 | 49.986 |
| 0.4932407407407407 | 49.983 |
| 0.49325231481481485 | 49.982 |
| 0.4932638888888889 | 49.98 |
| 0.493275462962963 | 49.979 |
| 0.493287037037037 | 49.98 |
| 0.4932986111111111 | 49.981 |
| 0.49331018518518516 | 49.982 |
| 0.4933217592592593 | 49.982 |
| 0.49333333333333335 | 49.983 |
| 0.49334490740740744 | 49.984 |
| 0.4933564814814815 | 49.985 |
| 0.4933680555555556 | 49.987 |
| 0.4933796296296296 | 49.987 |
| 0.49339120370370365 | 49.988 |
| 0.4934027777777778 | 49.987 |
| 0.49341435185185184 | 49.986 |
| 0.49342592592592593 | 49.985 |
| 0.4934375 | 49.982 |
| 0.49344907407407407 | 49.981 |
| 0.4934606481481481 | 49.98 |
| 0.49347222222222226 | 49.98 |
| 0.4934837962962963 | 49.981 |
| 0.4934953703703704 | 49.98 |
| 0.49350694444444443 | 49.98 |
| 0.4935185185185185 | 49.979 |
| 0.49353009259259256 | 49.979 |
| 0.4935416666666667 | 49.979 |
| 0.49355324074074075 | 49.978 |
| 0.49356481481481485 | 49.978 |
| 0.4935763888888889 | 49.977 |
| 0.493587962962963 | 49.978 |
| 0.493599537037037 | 49.979 |
| 0.49361111111111106 | 49.979 |
| 0.4936226851851852 | 49.977 |
| 0.49363425925925924 | 49.975 |
| 0.49364583333333334 | 49.973 |
| 0.4936574074074074 | 49.974 |
| 0.4936689814814815 | 49.972 |
| 0.4936805555555555 | 49.973 |
| 0.49369212962962966 | 49.969 |
| 0.4937037037037037 | 49.969 |
| 0.4937152777777778 | 49.967 |
| 0.49372685185185183 | 49.965 |
| 0.49373842592592593 | 49.962 |
| 0.49374999999999997 | 49.96 |
| 0.4937615740740741 | 49.957 |
| 0.49377314814814816 | 49.958 |
| 0.49378472222222225 | 49.956 |
| 0.4937962962962963 | 49.957 |
| 0.4938078703703704 | 49.954 |
| 0.4938194444444444 | 49.955 |
| 0.49383101851851857 | 49.953 |
| 0.4938425925925926 | 49.951 |
| 0.49385416666666665 | 49.95 |
| 0.49386574074074074 | 49.95 |
| 0.4938773148148148 | 49.95 |
| 0.4938888888888889 | 49.951 |
| 0.4939004629629629 | 49.951 |
| 0.49391203703703707 | 49.951 |
| 0.4939236111111111 | 49.952 |
| 0.4939351851851852 | 49.952 |
| 0.49394675925925924 | 49.951 |
| 0.49395833333333333 | 49.95 |
| 0.49396990740740737 | 49.949 |
| 0.4939814814814815 | 49.948 |
| 0.49399305555555556 | 49.949 |
| 0.49400462962962965 | 49.949 |
| 0.4940162037037037 | 49.951 |
| 0.4940277777777778 | 49.951 |
| 0.4940393518518518 | 49.952 |
| 0.494050925925926 | 49.953 |
| 0.4940625 | 49.954 |
| 0.4940740740740741 | 49.956 |
| 0.49408564814814815 | 49.956 |
| 0.4940972222222222 | 49.954 |
| 0.4941087962962963 | 49.954 |
| 0.4941203703703703 | 49.952 |
| 0.49413194444444447 | 49.952 |
| 0.4941435185185185 | 49.953 |
| 0.4941550925925926 | 49.954 |
| 0.49416666666666664 | 49.955 |
| 0.49417824074074074 | 49.955 |
| 0.4941898148148148 | 49.953 |
| 0.4942013888888889 | 49.952 |
| 0.49421296296296297 | 49.951 |
| 0.49422453703703706 | 49.951 |
| 0.4942361111111111 | 49.95 |
| 0.4942476851851852 | 49.949 |
| 0.49425925925925923 | 49.949 |
| 0.4942708333333334 | 49.95 |
| 0.4942824074074074 | 49.95 |
| 0.4942939814814815 | 49.95 |
| 0.49430555555555555 | 49.952 |
| 0.49431712962962965 | 49.951 |
| 0.4943287037037037 | 49.951 |
| 0.4943402777777777 | 49.951 |
| 0.4943518518518519 | 49.953 |
| 0.4943634259259259 | 49.957 |
| 0.494375 | 49.959 |
| 0.49438657407407405 | 49.964 |
| 0.49439814814814814 | 49.969 |
| 0.4944097222222222 | 49.974 |
| 0.49442129629629633 | 49.977 |
| 0.49443287037037037 | 49.979 |
| 0.49444444444444446 | 49.98 |
| 0.4944560185185185 | 49.98 |
| 0.4944675925925926 | 49.981 |
| 0.49447916666666664 | 49.981 |
| 0.4944907407407408 | 49.981 |
| 0.4945023148148148 | 49.98 |
| 0.4945138888888889 | 49.979 |
| 0.49452546296296296 | 49.976 |
| 0.49453703703703705 | 49.974 |
| 0.4945486111111111 | 49.972 |
| 0.49456018518518513 | 49.971 |
| 0.4945717592592593 | 49.969 |
| 0.4945833333333333 | 49.969 |
| 0.4945949074074074 | 49.968 |
| 0.49460648148148145 | 49.967 |
| 0.49461805555555555 | 49.965 |
| 0.4946296296296296 | 49.965 |
| 0.49464120370370374 | 49.964 |
| 0.4946527777777778 | 49.964 |
| 0.49466435185185187 | 49.963 |
| 0.4946759259259259 | 49.963 |
| 0.4946875 | 49.963 |
| 0.49469907407407404 | 49.964 |
| 0.4947106481481482 | 49.966 |
| 0.49472222222222223 | 49.966 |
| 0.4947337962962963 | 49.968 |
| 0.49474537037037036 | 49.97 |
| 0.49475694444444446 | 49.971 |
| 0.4947685185185185 | 49.973 |
| 0.49478009259259265 | 49.976 |
| 0.4947916666666667 | 49.979 |
| 0.4948032407407407 | 49.981 |
| 0.4948148148148148 | 49.984 |
| 0.49482638888888886 | 49.986 |
| 0.49483796296296295 | 49.986 |
| 0.494849537037037 | 49.985 |
| 0.49486111111111114 | 49.984 |
| 0.4948726851851852 | 49.981 |
| 0.4948842592592593 | 49.98 |
| 0.4948958333333333 | 49.981 |
| 0.4949074074074074 | 49.981 |
| 0.49491898148148145 | 49.982 |
| 0.4949305555555556 | 49.98 |
| 0.49494212962962963 | 49.981 |
| 0.49495370370370373 | 49.982 |
| 0.49496527777777777 | 49.983 |
| 0.49497685185185186 | 49.983 |
| 0.4949884259259259 | 49.985 |
| 0.49500000000000005 | 49.984 |
| 0.4950115740740741 | 49.984 |
| 0.4950231481481482 | 49.985 |
| 0.4950347222222222 | 49.986 |
| 0.49504629629629626 | 49.983 |
| 0.49505787037037036 | 49.983 |
| 0.4950694444444444 | 49.98 |
| 0.49508101851851855 | 49.979 |
| 0.4950925925925926 | 49.977 |
| 0.4951041666666667 | 49.975 |
| 0.4951157407407407 | 49.975 |
| 0.4951273148148148 | 49.976 |
| 0.49513888888888885 | 49.977 |
| 0.495150462962963 | 49.975 |
| 0.49516203703703704 | 49.974 |
| 0.49517361111111113 | 49.973 |
| 0.4951851851851852 | 49.972 |
| 0.49519675925925927 | 49.972 |
| 0.4952083333333333 | 49.972 |
| 0.49521990740740746 | 49.97 |
| 0.4952314814814815 | 49.97 |
| 0.4952430555555556 | 49.971 |
| 0.49525462962962963 | 49.974 |
| 0.49526620370370367 | 49.975 |
| 0.49527777777777776 | 49.975 |
| 0.4952893518518518 | 49.974 |
| 0.49530092592592595 | 49.973 |
| 0.4953125 | 49.974 |
| 0.4953240740740741 | 49.973 |
| 0.4953356481481481 | 49.973 |
| 0.4953472222222222 | 49.973 |
| 0.49535879629629626 | 49.969 |
| 0.4953703703703704 | 49.966 |
| 0.49538194444444444 | 49.962 |
| 0.49539351851851854 | 49.96 |
| 0.4954050925925926 | 49.959 |
| 0.49541666666666667 | 49.956 |
| 0.4954282407407407 | 49.955 |
| 0.49543981481481486 | 49.952 |
| 0.4954513888888889 | 49.951 |
| 0.495462962962963 | 49.951 |
| 0.49547453703703703 | 49.951 |
| 0.4954861111111111 | 49.952 |
| 0.49549768518518517 | 49.954 |
| 0.4955092592592592 | 49.955 |
| 0.49552083333333335 | 49.954 |
| 0.4955324074074074 | 49.955 |
| 0.4955439814814815 | 49.956 |
| 0.4955555555555555 | 49.957 |
| 0.4955671296296296 | 49.959 |
| 0.49557870370370366 | 49.961 |
| 0.4955902777777778 | 49.961 |
| 0.49560185185185185 | 49.963 |
| 0.49561342592592594 | 49.963 |
| 0.495625 | 49.966 |
| 0.4956365740740741 | 49.966 |
| 0.4956481481481481 | 49.968 |
| 0.49565972222222227 | 49.968 |
| 0.4956712962962963 | 49.968 |
| 0.4956828703703704 | 49.969 |
| 0.49569444444444444 | 49.97 |
| 0.49570601851851853 | 49.97 |
| 0.49571759259259257 | 49.973 |
| 0.4957291666666667 | 49.973 |
| 0.49574074074074076 | 49.972 |
| 0.4957523148148148 | 49.971 |
| 0.4957638888888889 | 49.97 |
| 0.49577546296296293 | 49.967 |
| 0.495787037037037 | 49.966 |
| 0.49579861111111106 | 49.964 |
| 0.4958101851851852 | 49.964 |
| 0.49582175925925925 | 49.965 |
| 0.49583333333333335 | 49.965 |
| 0.4958449074074074 | 49.964 |
| 0.4958564814814815 | 49.962 |
| 0.4958680555555555 | 49.962 |
| 0.49587962962962967 | 49.96 |
| 0.4958912037037037 | 49.958 |
| 0.4959027777777778 | 49.956 |
| 0.49591435185185184 | 49.954 |
| 0.49592592592592594 | 49.953 |
| 0.4959375 | 49.95 |
| 0.4959490740740741 | 49.95 |
| 0.49596064814814816 | 49.948 |
| 0.49597222222222226 | 49.947 |
| 0.4959837962962963 | 49.944 |
| 0.49599537037037034 | 49.942 |
| 0.49600694444444443 | 49.944 |
| 0.49601851851851847 | 49.944 |
| 0.4960300925925926 | 49.946 |
| 0.49604166666666666 | 49.948 |
| 0.49605324074074075 | 49.95 |
| 0.4960648148148148 | 49.95 |
| 0.4960763888888889 | 49.95 |
| 0.4960879629629629 | 49.95 |
| 0.4960995370370371 | 49.95 |
| 0.4961111111111111 | 49.952 |
| 0.4961226851851852 | 49.951 |
| 0.49613425925925925 | 49.954 |
| 0.49614583333333334 | 49.953 |
| 0.4961574074074074 | 49.953 |
| 0.49616898148148153 | 49.954 |
| 0.49618055555555557 | 49.954 |
| 0.49619212962962966 | 49.954 |
| 0.4962037037037037 | 49.953 |
| 0.49621527777777774 | 49.955 |
| 0.49622685185185184 | 49.956 |
| 0.4962384259259259 | 49.957 |
| 0.49625 | 49.958 |
| 0.49626157407407406 | 49.957 |
| 0.49627314814814816 | 49.955 |
| 0.4962847222222222 | 49.955 |
| 0.4962962962962963 | 49.955 |
| 0.49630787037037033 | 49.955 |
| 0.4963194444444445 | 49.953 |
| 0.4963310185185185 | 49.95 |
| 0.4963425925925926 | 49.951 |
| 0.49635416666666665 | 49.95 |
| 0.49636574074074075 | 49.95 |
| 0.4963773148148148 | 49.95 |
| 0.49638888888888894 | 49.948 |
| 0.496400462962963 | 49.945 |
| 0.49641203703703707 | 49.944 |
| 0.4964236111111111 | 49.942 |
| 0.4964351851851852 | 49.941 |
| 0.49644675925925924 | 49.941 |
| 0.4964583333333333 | 49.941 |
| 0.49646990740740743 | 49.941 |
| 0.49648148148148147 | 49.943 |
| 0.49649305555555556 | 49.946 |
| 0.4965046296296296 | 49.947 |
| 0.4965162037037037 | 49.95 |
| 0.49652777777777773 | 49.951 |
| 0.4965393518518519 | 49.954 |
| 0.4965509259259259 | 49.952 |
| 0.4965625 | 49.953 |
| 0.49657407407407406 | 49.954 |
| 0.49658564814814815 | 49.954 |
| 0.4965972222222222 | 49.954 |
| 0.49660879629629634 | 49.953 |
| 0.4966203703703704 | 49.952 |
| 0.4966319444444445 | 49.951 |
| 0.4966435185185185 | 49.95 |
| 0.4966550925925926 | 49.949 |
| 0.49666666666666665 | 49.949 |
| 0.4966782407407408 | 49.949 |
| 0.49668981481481483 | 49.95 |
| 0.4967013888888889 | 49.951 |
| 0.49671296296296297 | 49.952 |
| 0.496724537037037 | 49.953 |
| 0.4967361111111111 | 49.954 |
| 0.49674768518518514 | 49.954 |
| 0.4967592592592593 | 49.952 |
| 0.49677083333333333 | 49.95 |
| 0.4967824074074074 | 49.948 |
| 0.49679398148148146 | 49.946 |
| 0.49680555555555556 | 49.945 |
| 0.4968171296296296 | 49.942 |
| 0.49682870370370374 | 49.941 |
| 0.4968402777777778 | 49.942 |
| 0.4968518518518519 | 49.939 |
| 0.4968634259259259 | 49.938 |
| 0.496875 | 49.936 |
| 0.49688657407407405 | 49.936 |
| 0.4968981481481482 | 49.934 |
| 0.49690972222222224 | 49.932 |
| 0.49692129629629633 | 49.931 |
| 0.49693287037037037 | 49.93 |
| 0.4969444444444444 | 49.93 |
| 0.4969560185185185 | 49.932 |
| 0.49696759259259254 | 49.934 |
| 0.4969791666666667 | 49.935 |
| 0.49699074074074073 | 49.937 |
| 0.4970023148148148 | 49.939 |
| 0.49701388888888887 | 49.941 |
| 0.49702546296296296 | 49.944 |
| 0.497037037037037 | 49.945 |
| 0.49704861111111115 | 49.946 |
| 0.4970601851851852 | 49.945 |
| 0.4970717592592593 | 49.947 |
| 0.4970833333333333 | 49.948 |
| 0.4970949074074074 | 49.949 |
| 0.49710648148148145 | 49.95 |
| 0.4971180555555556 | 49.948 |
| 0.49712962962962964 | 49.948 |
| 0.49714120370370374 | 49.947 |
| 0.4971527777777778 | 49.944 |
| 0.4971643518518518 | 49.944 |
| 0.4971759259259259 | 49.941 |
| 0.49718749999999995 | 49.939 |
| 0.4971990740740741 | 49.937 |
| 0.49721064814814814 | 49.937 |
| 0.49722222222222223 | 49.938 |
| 0.49723379629629627 | 49.935 |
| 0.49724537037037037 | 49.93 |
| 0.4972569444444444 | 49.926 |
| 0.49726851851851855 | 49.923 |
| 0.4972800925925926 | 49.92 |
| 0.4972916666666667 | 49.919 |
| 0.4973032407407407 | 49.916 |
| 0.4973148148148148 | 49.914 |
| 0.49732638888888886 | 49.912 |
| 0.497337962962963 | 49.913 |
| 0.49734953703703705 | 49.912 |
| 0.49736111111111114 | 49.912 |
| 0.4973726851851852 | 49.913 |
| 0.4973842592592593 | 49.913 |
| 0.4973958333333333 | 49.914 |
| 0.49740740740740735 | 49.914 |
| 0.4974189814814815 | 49.914 |
| 0.49743055555555554 | 49.913 |
| 0.49744212962962964 | 49.915 |
| 0.4974537037037037 | 49.918 |
| 0.49746527777777777 | 49.919 |
| 0.4974768518518518 | 49.921 |
| 0.49748842592592596 | 49.923 |
| 0.4975 | 49.924 |
| 0.4975115740740741 | 49.925 |
| 0.49752314814814813 | 49.925 |
| 0.4975347222222222 | 49.924 |
| 0.49754629629629626 | 49.924 |
| 0.4975578703703704 | 49.923 |
| 0.49756944444444445 | 49.924 |
| 0.49758101851851855 | 49.923 |
| 0.4975925925925926 | 49.924 |
| 0.4976041666666667 | 49.924 |
| 0.4976157407407407 | 49.924 |
| 0.49762731481481487 | 49.926 |
| 0.4976388888888889 | 49.926 |
| 0.49765046296296295 | 49.928 |
| 0.49766203703703704 | 49.927 |
| 0.4976736111111111 | 49.927 |
| 0.4976851851851852 | 49.927 |
| 0.4976967592592592 | 49.926 |
| 0.49770833333333336 | 49.924 |
| 0.4977199074074074 | 49.923 |
| 0.4977314814814815 | 49.921 |
| 0.49774305555555554 | 49.919 |
| 0.49775462962962963 | 49.917 |
| 0.49776620370370367 | 49.916 |
| 0.4977777777777778 | 49.914 |
| 0.49778935185185186 | 49.913 |
| 0.49780092592592595 | 49.911 |
| 0.4978125 | 49.909 |
| 0.4978240740740741 | 49.906 |
| 0.4978356481481481 | 49.906 |
| 0.4978472222222223 | 49.904 |
| 0.4978587962962963 | 49.903 |
| 0.49787037037037035 | 49.902 |
| 0.49788194444444445 | 49.903 |
| 0.4978935185185185 | 49.902 |
| 0.4979050925925926 | 49.905 |
| 0.4979166666666666 | 49.904 |
| 0.49792824074074077 | 49.905 |
| 0.4979398148148148 | 49.905 |
| 0.4979513888888889 | 49.906 |
| 0.49796296296296294 | 49.905 |
| 0.49797453703703703 | 49.904 |
| 0.4979861111111111 | 49.9 |
| 0.4979976851851852 | 49.901 |
| 0.49800925925925926 | 49.901 |
| 0.49802083333333336 | 49.901 |
| 0.4980324074074074 | 49.9 |
| 0.4980439814814815 | 49.899 |
| 0.49805555555555553 | 49.899 |
| 0.4980671296296297 | 49.899 |
| 0.4980787037037037 | 49.9 |
| 0.4980902777777778 | 49.904 |
| 0.49810185185185185 | 49.905 |
| 0.4981134259259259 | 49.905 |
| 0.498125 | 49.906 |
| 0.498136574074074 | 49.906 |
| 0.4981481481481482 | 49.906 |
| 0.4981597222222222 | 49.907 |
| 0.4981712962962963 | 49.908 |
| 0.49818287037037035 | 49.91 |
| 0.49819444444444444 | 49.91 |
| 0.4982060185185185 | 49.91 |
| 0.49821759259259263 | 49.909 |
| 0.49822916666666667 | 49.909 |
| 0.49824074074074076 | 49.907 |
| 0.4982523148148148 | 49.906 |
| 0.4982638888888889 | 49.905 |
| 0.49827546296296293 | 49.903 |
| 0.4982870370370371 | 49.904 |
| 0.4982986111111111 | 49.903 |
| 0.4983101851851852 | 49.902 |
| 0.49832175925925926 | 49.902 |
| 0.49833333333333335 | 49.902 |
| 0.4983449074074074 | 49.902 |
| 0.49835648148148143 | 49.904 |
| 0.4983680555555556 | 49.903 |
| 0.4983796296296296 | 49.903 |
| 0.4983912037037037 | 49.903 |
| 0.49840277777777775 | 49.904 |
| 0.49841435185185184 | 49.906 |
| 0.4984259259259259 | 49.908 |
| 0.49843750000000003 | 49.91 |
| 0.49844907407407407 | 49.91 |
| 0.49846064814814817 | 49.912 |
| 0.4984722222222222 | 49.914 |
| 0.4984837962962963 | 49.912 |
| 0.49849537037037034 | 49.912 |
| 0.4985069444444445 | 49.914 |
| 0.4985185185185185 | 49.915 |
| 0.4985300925925926 | 49.916 |
| 0.49854166666666666 | 49.918 |
| 0.49855324074074076 | 49.919 |
| 0.4985648148148148 | 49.922 |
| 0.49857638888888894 | 49.923 |
| 0.498587962962963 | 49.925 |
| 0.498599537037037 | 49.926 |
| 0.4986111111111111 | 49.927 |
| 0.49862268518518515 | 49.927 |
| 0.49863425925925925 | 49.928 |
| 0.4986458333333333 | 49.93 |
| 0.49865740740740744 | 49.93 |
| 0.4986689814814815 | 49.931 |
| 0.49868055555555557 | 49.93 |
| 0.4986921296296296 | 49.929 |
| 0.4987037037037037 | 49.926 |
| 0.49871527777777774 | 49.925 |
| 0.4987268518518519 | 49.925 |
| 0.49873842592592593 | 49.927 |
| 0.49875 | 49.927 |
| 0.49876157407407407 | 49.927 |
| 0.49877314814814816 | 49.929 |
| 0.4987847222222222 | 49.93 |
| 0.49879629629629635 | 49.932 |
| 0.4988078703703704 | 49.934 |
| 0.4988194444444444 | 49.936 |
| 0.4988310185185185 | 49.937 |
| 0.49884259259259256 | 49.937 |
| 0.49885416666666665 | 49.939 |
| 0.4988657407407407 | 49.939 |
| 0.49887731481481484 | 49.938 |
| 0.4988888888888889 | 49.935 |
| 0.498900462962963 | 49.934 |
| 0.498912037037037 | 49.935 |
| 0.4989236111111111 | 49.933 |
| 0.49893518518518515 | 49.933 |
| 0.4989467592592593 | 49.934 |
| 0.49895833333333334 | 49.935 |
| 0.49896990740740743 | 49.934 |
| 0.49898148148148147 | 49.933 |
| 0.49899305555555556 | 49.931 |
| 0.4990046296296296 | 49.93 |
| 0.49901620370370375 | 49.93 |
| 0.4990277777777778 | 49.93 |
| 0.4990393518518519 | 49.929 |
| 0.4990509259259259 | 49.93 |
| 0.49906249999999996 | 49.931 |
| 0.49907407407407406 | 49.932 |
| 0.4990856481481481 | 49.931 |
| 0.49909722222222225 | 49.933 |
| 0.4991087962962963 | 49.932 |
| 0.4991203703703704 | 49.932 |
| 0.4991319444444444 | 49.932 |
| 0.4991435185185185 | 49.936 |
| 0.49915509259259255 | 49.936 |
| 0.4991666666666667 | 49.938 |
| 0.49917824074074074 | 49.938 |
| 0.49918981481481484 | 49.938 |
| 0.4992013888888889 | 49.937 |
| 0.49921296296296297 | 49.934 |
| 0.499224537037037 | 49.93 |
| 0.49923611111111116 | 49.926 |
| 0.4992476851851852 | 49.923 |
| 0.4992592592592593 | 49.924 |
| 0.49927083333333333 | 49.922 |
| 0.4992824074074074 | 49.924 |
| 0.49929398148148146 | 49.924 |
| 0.4993055555555555 | 49.926 |
| 0.49931712962962965 | 49.924 |
| 0.4993287037037037 | 49.926 |
| 0.4993402777777778 | 49.929 |
| 0.4993518518518518 | 49.933 |
| 0.4993634259259259 | 49.933 |
| 0.49937499999999996 | 49.936 |
| 0.4993865740740741 | 49.936 |
| 0.49939814814814815 | 49.937 |
| 0.49940972222222224 | 49.936 |
| 0.4994212962962963 | 49.935 |
| 0.4994328703703704 | 49.932 |
| 0.4994444444444444 | 49.932 |
| 0.49945601851851856 | 49.93 |
| 0.4994675925925926 | 49.931 |
| 0.4994791666666667 | 49.93 |
| 0.49949074074074074 | 49.93 |
| 0.49950231481481483 | 49.929 |
| 0.49951388888888887 | 49.929 |
| 0.499525462962963 | 49.929 |
| 0.49953703703703706 | 49.93 |
| 0.4995486111111111 | 49.931 |
| 0.4995601851851852 | 49.933 |
| 0.49957175925925923 | 49.935 |
| 0.4995833333333333 | 49.938 |
| 0.49959490740740736 | 49.939 |
| 0.4996064814814815 | 49.943 |
| 0.49961805555555555 | 49.942 |
| 0.49962962962962965 | 49.944 |
| 0.4996412037037037 | 49.944 |
| 0.4996527777777778 | 49.945 |
| 0.4996643518518518 | 49.945 |
| 0.49967592592592597 | 49.946 |
| 0.4996875 | 49.948 |
| 0.4996990740740741 | 49.95 |
| 0.49971064814814814 | 49.953 |
| 0.49972222222222223 | 49.956 |
| 0.4997337962962963 | 49.96 |
| 0.4997453703703704 | 49.963 |
| 0.49975694444444446 | 49.965 |
| 0.4997685185185185 | 49.966 |
| 0.4997800925925926 | 49.966 |
| 0.49979166666666663 | 49.968 |
| 0.49980324074074073 | 49.968 |
| 0.49981481481481477 | 49.97 |
| 0.4998263888888889 | 49.971 |
| 0.49983796296296296 | 49.973 |
| 0.49984953703703705 | 49.975 |
| 0.4998611111111111 | 49.977 |
| 0.4998726851851852 | 49.977 |
| 0.4998842592592592 | 49.975 |
| 0.4998958333333334 | 49.972 |
| 0.4999074074074074 | 49.97 |
| 0.4999189814814815 | 49.969 |
| 0.49993055555555554 | 49.967 |
| 0.49994212962962964 | 49.967 |
| 0.4999537037037037 | 49.966 |
| 0.49996527777777783 | 49.968 |
| 0.49997685185185187 | 49.97 |
| 0.49998842592592596 | 49.971 |
| 0.5 | 49.973 |
| 0.500011574074074 | 49.971 |
| 0.5000231481481482 | 49.97 |
| 0.5000347222222222 | 49.968 |
| 0.5000462962962963 | 49.969 |
| 0.5000578703703703 | 49.969 |
| 0.5000694444444445 | 49.972 |
| 0.5000810185185185 | 49.974 |
| 0.5000925925925926 | 49.975 |
| 0.5001041666666667 | 49.976 |
| 0.5001157407407407 | 49.976 |
| 0.5001273148148148 | 49.974 |
| 0.5001388888888889 | 49.974 |
| 0.500150462962963 | 49.974 |
| 0.5001620370370371 | 49.971 |
| 0.5001736111111111 | 49.969 |
| 0.5001851851851852 | 49.968 |
| 0.5001967592592592 | 49.965 |
| 0.5002083333333334 | 49.963 |
| 0.5002199074074074 | 49.962 |
| 0.5002314814814816 | 49.961 |
| 0.5002430555555556 | 49.96 |
| 0.5002546296296296 | 49.96 |
| 0.5002662037037037 | 49.96 |
| 0.5002777777777777 | 49.961 |
| 0.5002893518518519 | 49.96 |
| 0.5003009259259259 | 49.961 |
| 0.5003125 | 49.963 |
| 0.5003240740740741 | 49.965 |
| 0.5003356481481481 | 49.966 |
| 0.5003472222222222 | 49.968 |
| 0.5003587962962963 | 49.969 |
| 0.5003703703703704 | 49.971 |
| 0.5003819444444445 | 49.973 |
| 0.5003935185185185 | 49.976 |
| 0.5004050925925926 | 49.976 |
| 0.5004166666666666 | 49.979 |
| 0.5004282407407408 | 49.977 |
| 0.5004398148148148 | 49.978 |
| 0.500451388888889 | 49.979 |
| 0.500462962962963 | 49.98 |
| 0.500474537037037 | 49.981 |
| 0.5004861111111111 | 49.983 |
| 0.5004976851851851 | 49.986 |
| 0.5005092592592593 | 49.988 |
| 0.5005208333333333 | 49.99 |
| 0.5005324074074075 | 49.99 |
| 0.5005439814814815 | 49.99 |
| 0.5005555555555555 | 49.99 |
| 0.5005671296296296 | 49.989 |
| 0.5005787037037037 | 49.988 |
| 0.5005902777777778 | 49.986 |
| 0.5006018518518519 | 49.984 |
| 0.500613425925926 | 49.984 |
| 0.500625 | 49.984 |
| 0.500636574074074 | 49.986 |
| 0.5006481481481482 | 49.986 |
| 0.5006597222222222 | 49.988 |
| 0.5006712962962964 | 49.986 |
| 0.5006828703703704 | 49.984 |
| 0.5006944444444444 | 49.983 |
| 0.5007060185185185 | 49.982 |
| 0.5007175925925925 | 49.98 |
| 0.5007291666666667 | 49.98 |
| 0.5007407407407407 | 49.981 |
| 0.5007523148148149 | 49.981 |
| 0.5007638888888889 | 49.98 |
| 0.5007754629629629 | 49.981 |
| 0.500787037037037 | 49.983 |
| 0.5007986111111111 | 49.984 |
| 0.5008101851851852 | 49.986 |
| 0.5008217592592593 | 49.987 |
| 0.5008333333333334 | 49.988 |
| 0.5008449074074074 | 49.989 |
| 0.5008564814814814 | 49.99 |
| 0.5008680555555556 | 49.99 |
| 0.5008796296296296 | 49.989 |
| 0.5008912037037038 | 49.987 |
| 0.5009027777777778 | 49.987 |
| 0.5009143518518518 | 49.987 |
| 0.5009259259259259 | 49.984 |
| 0.5009375 | 49.985 |
| 0.5009490740740741 | 49.987 |
| 0.5009606481481481 | 49.988 |
| 0.5009722222222223 | 49.99 |
| 0.5009837962962963 | 49.994 |
| 0.5009953703703703 | 49.996 |
| 0.5010069444444444 | 49.997 |
| 0.5010185185185185 | 50 |
| 0.5010300925925926 | 50.002 |
| 0.5010416666666667 | 50.002 |
| 0.5010532407407408 | 50.002 |
| 0.5010648148148148 | 50.001 |
| 0.5010763888888888 | 50 |
| 0.501087962962963 | 49.998 |
| 0.501099537037037 | 49.998 |
| 0.5011111111111112 | 49.996 |
| 0.5011226851851852 | 49.994 |
| 0.5011342592592593 | 49.993 |
| 0.5011458333333333 | 49.991 |
| 0.5011574074074074 | 49.99 |
| 0.5011689814814815 | 49.989 |
| 0.5011805555555556 | 49.988 |
| 0.5011921296296297 | 49.99 |
| 0.5012037037037037 | 49.991 |
| 0.5012152777777777 | 49.992 |
| 0.5012268518518518 | 49.993 |
| 0.5012384259259259 | 49.992 |
| 0.50125 | 49.991 |
| 0.5012615740740741 | 49.99 |
| 0.5012731481481482 | 49.991 |
| 0.5012847222222222 | 49.992 |
| 0.5012962962962962 | 49.994 |
| 0.5013078703703704 | 49.998 |
| 0.5013194444444444 | 50 |
| 0.5013310185185186 | 50.003 |
| 0.5013425925925926 | 50.004 |
| 0.5013541666666667 | 50.005 |
| 0.5013657407407407 | 50.006 |
| 0.5013773148148148 | 50.005 |
| 0.5013888888888889 | 50.004 |
| 0.501400462962963 | 50.002 |
| 0.5014120370370371 | 50 |
| 0.5014236111111111 | 49.997 |
| 0.5014351851851852 | 49.996 |
| 0.5014467592592592 | 49.994 |
| 0.5014583333333333 | 49.994 |
| 0.5014699074074074 | 49.992 |
| 0.5014814814814815 | 49.993 |
| 0.5014930555555556 | 49.994 |
| 0.5015046296296296 | 49.993 |
| 0.5015162037037036 | 49.993 |
| 0.5015277777777778 | 49.994 |
| 0.5015393518518518 | 49.996 |
| 0.501550925925926 | 49.997 |
| 0.5015625 | 49.997 |
| 0.5015740740740741 | 49.999 |
| 0.5015856481481481 | 50.001 |
| 0.5015972222222222 | 50.002 |
| 0.5016087962962963 | 50.004 |
| 0.5016203703703704 | 50.005 |
| 0.5016319444444445 | 50.006 |
| 0.5016435185185185 | 50.007 |
| 0.5016550925925926 | 50.009 |
| 0.5016666666666666 | 50.01 |
| 0.5016782407407407 | 50.012 |
| 0.5016898148148148 | 50.014 |
| 0.5017013888888889 | 50.015 |
| 0.501712962962963 | 50.016 |
| 0.501724537037037 | 50.018 |
| 0.501736111111111 | 50.018 |
| 0.5017476851851852 | 50.019 |
| 0.5017592592592592 | 50.018 |
| 0.5017708333333334 | 50.02 |
| 0.5017824074074074 | 50.021 |
| 0.5017939814814815 | 50.022 |
| 0.5018055555555555 | 50.022 |
| 0.5018171296296297 | 50.025 |
| 0.5018287037037037 | 50.027 |
| 0.5018402777777778 | 50.027 |
| 0.5018518518518519 | 50.025 |
| 0.5018634259259259 | 50.025 |
| 0.501875 | 50.025 |
| 0.5018865740740741 | 50.027 |
| 0.5018981481481481 | 50.027 |
| 0.5019097222222222 | 50.027 |
| 0.5019212962962963 | 50.028 |
| 0.5019328703703704 | 50.028 |
| 0.5019444444444444 | 50.027 |
| 0.5019560185185185 | 50.026 |
| 0.5019675925925926 | 50.024 |
| 0.5019791666666666 | 50.021 |
| 0.5019907407407408 | 50.019 |
| 0.5020023148148148 | 50.016 |
| 0.5020138888888889 | 50.013 |
| 0.5020254629629629 | 50.01 |
| 0.5020370370370371 | 50.008 |
| 0.5020486111111111 | 50.005 |
| 0.5020601851851852 | 50.004 |
| 0.5020717592592593 | 50.002 |
| 0.5020833333333333 | 50.002 |
| 0.5020949074074074 | 50 |
| 0.5021064814814815 | 50 |
| 0.5021180555555556 | 49.998 |
| 0.5021296296296297 | 50 |
| 0.5021412037037037 | 50 |
| 0.5021527777777778 | 50.001 |
| 0.5021643518518518 | 50.001 |
| 0.5021759259259259 | 50.001 |
| 0.5021875 | 49.999 |
| 0.502199074074074 | 49.997 |
| 0.5022106481481482 | 49.996 |
| 0.5022222222222222 | 49.995 |
| 0.5022337962962963 | 49.993 |
| 0.5022453703703703 | 49.99 |
| 0.5022569444444445 | 49.987 |
| 0.5022685185185185 | 49.985 |
| 0.5022800925925927 | 49.981 |
| 0.5022916666666667 | 49.979 |
| 0.5023032407407407 | 49.978 |
| 0.5023148148148148 | 49.977 |
| 0.5023263888888889 | 49.978 |
| 0.502337962962963 | 49.976 |
| 0.5023495370370371 | 49.974 |
| 0.5023611111111111 | 49.972 |
| 0.5023726851851852 | 49.971 |
| 0.5023842592592592 | 49.971 |
| 0.5023958333333333 | 49.975 |
| 0.5024074074074074 | 49.978 |
| 0.5024189814814815 | 49.978 |
| 0.5024305555555556 | 49.981 |
| 0.5024421296296296 | 49.981 |
| 0.5024537037037037 | 49.983 |
| 0.5024652777777777 | 49.985 |
| 0.5024768518518519 | 49.986 |
| 0.5024884259259259 | 49.985 |
| 0.5025000000000001 | 49.985 |
| 0.5025115740740741 | 49.985 |
| 0.5025231481481481 | 49.983 |
| 0.5025347222222222 | 49.982 |
| 0.5025462962962963 | 49.984 |
| 0.5025578703703704 | 49.984 |
| 0.5025694444444445 | 49.984 |
| 0.5025810185185186 | 49.986 |
| 0.5025925925925926 | 49.987 |
| 0.5026041666666666 | 49.988 |
| 0.5026157407407407 | 49.988 |
| 0.5026273148148148 | 49.989 |
| 0.5026388888888889 | 49.988 |
| 0.502650462962963 | 49.986 |
| 0.502662037037037 | 49.985 |
| 0.5026736111111111 | 49.984 |
| 0.5026851851851851 | 49.982 |
| 0.5026967592592593 | 49.982 |
| 0.5027083333333333 | 49.981 |
| 0.5027199074074075 | 49.981 |
| 0.5027314814814815 | 49.981 |
| 0.5027430555555555 | 49.979 |
| 0.5027546296296296 | 49.979 |
| 0.5027662037037037 | 49.977 |
| 0.5027777777777778 | 49.975 |
| 0.5027893518518519 | 49.973 |
| 0.502800925925926 | 49.972 |
| 0.5028125 | 49.97 |
| 0.502824074074074 | 49.967 |
| 0.5028356481481482 | 49.964 |
| 0.5028472222222222 | 49.96 |
| 0.5028587962962963 | 49.959 |
| 0.5028703703703704 | 49.957 |
| 0.5028819444444445 | 49.957 |
| 0.5028935185185185 | 49.959 |
| 0.5029050925925925 | 49.96 |
| 0.5029166666666667 | 49.959 |
| 0.5029282407407407 | 49.961 |
| 0.5029398148148149 | 49.962 |
| 0.5029513888888889 | 49.964 |
| 0.502962962962963 | 49.965 |
| 0.502974537037037 | 49.964 |
| 0.5029861111111111 | 49.963 |
| 0.5029976851851852 | 49.963 |
| 0.5030092592592593 | 49.962 |
| 0.5030208333333334 | 49.963 |
| 0.5030324074074074 | 49.963 |
| 0.5030439814814814 | 49.964 |
| 0.5030555555555556 | 49.964 |
| 0.5030671296296296 | 49.964 |
| 0.5030787037037037 | 49.964 |
| 0.5030902777777778 | 49.965 |
| 0.5031018518518519 | 49.967 |
| 0.5031134259259259 | 49.968 |
| 0.5031249999999999 | 49.97 |
| 0.5031365740740741 | 49.969 |
| 0.5031481481481481 | 49.971 |
| 0.5031597222222223 | 49.974 |
| 0.5031712962962963 | 49.98 |
| 0.5031828703703703 | 49.982 |
| 0.5031944444444444 | 49.984 |
| 0.5032060185185185 | 49.986 |
| 0.5032175925925926 | 49.989 |
| 0.5032291666666667 | 49.993 |
| 0.5032407407407408 | 49.996 |
| 0.5032523148148148 | 49.998 |
| 0.5032638888888888 | 50.001 |
| 0.503275462962963 | 50.003 |
| 0.503287037037037 | 50.006 |
| 0.5032986111111112 | 50.008 |
| 0.5033101851851852 | 50.008 |
| 0.5033217592592593 | 50.008 |
| 0.5033333333333333 | 50.008 |
| 0.5033449074074073 | 50.008 |
| 0.5033564814814815 | 50.008 |
| 0.5033680555555555 | 50.007 |
| 0.5033796296296297 | 50.005 |
| 0.5033912037037037 | 50.003 |
| 0.5034027777777778 | 50.001 |
| 0.5034143518518518 | 49.999 |
| 0.5034259259259259 | 49.998 |
| 0.5034375 | 49.996 |
| 0.5034490740740741 | 49.991 |
| 0.5034606481481482 | 49.988 |
| 0.5034722222222222 | 49.987 |
| 0.5034837962962962 | 49.986 |
| 0.5034953703703704 | 49.984 |
| 0.5035069444444444 | 49.984 |
| 0.5035185185185186 | 49.984 |
| 0.5035300925925926 | 49.985 |
| 0.5035416666666667 | 49.985 |
| 0.5035532407407407 | 49.986 |
| 0.5035648148148147 | 49.985 |
| 0.5035763888888889 | 49.987 |
| 0.5035879629629629 | 49.987 |
| 0.5035995370370371 | 49.987 |
| 0.5036111111111111 | 49.987 |
| 0.5036226851851852 | 49.989 |
| 0.5036342592592592 | 49.991 |
| 0.5036458333333333 | 49.993 |
| 0.5036574074074074 | 49.994 |
| 0.5036689814814815 | 49.995 |
| 0.5036805555555556 | 49.994 |
| 0.5036921296296296 | 49.992 |
| 0.5037037037037037 | 49.989 |
| 0.5037152777777778 | 49.989 |
| 0.5037268518518518 | 49.989 |
| 0.503738425925926 | 49.991 |
| 0.50375 | 49.991 |
| 0.5037615740740741 | 49.991 |
| 0.5037731481481481 | 49.991 |
| 0.5037847222222223 | 49.99 |
| 0.5037962962962963 | 49.988 |
| 0.5038078703703703 | 49.986 |
| 0.5038194444444445 | 49.986 |
| 0.5038310185185185 | 49.987 |
| 0.5038425925925926 | 49.989 |
| 0.5038541666666666 | 49.993 |
| 0.5038657407407408 | 49.997 |
| 0.5038773148148148 | 50.001 |
| 0.5038888888888889 | 50.005 |
| 0.503900462962963 | 50.01 |
| 0.503912037037037 | 50.013 |
| 0.5039236111111111 | 50.016 |
| 0.5039351851851852 | 50.017 |
| 0.5039467592592592 | 50.018 |
| 0.5039583333333334 | 50.02 |
| 0.5039699074074074 | 50.021 |
| 0.5039814814814815 | 50.021 |
| 0.5039930555555555 | 50.022 |
| 0.5040046296296297 | 50.021 |
| 0.5040162037037037 | 50.019 |
| 0.5040277777777777 | 50.016 |
| 0.5040393518518519 | 50.014 |
| 0.5040509259259259 | 50.013 |
| 0.5040625 | 50.013 |
| 0.504074074074074 | 50.014 |
| 0.5040856481481482 | 50.014 |
| 0.5040972222222222 | 50.015 |
| 0.5041087962962963 | 50.014 |
| 0.5041203703703704 | 50.013 |
| 0.5041319444444444 | 50.011 |
| 0.5041435185185185 | 50.009 |
| 0.5041550925925926 | 50.008 |
| 0.5041666666666667 | 50.006 |
| 0.5041782407407408 | 50.005 |
| 0.5041898148148148 | 50.005 |
| 0.5042013888888889 | 50.004 |
| 0.5042129629629629 | 50.003 |
| 0.5042245370370371 | 50 |
| 0.5042361111111111 | 49.999 |
| 0.5042476851851853 | 49.996 |
| 0.5042592592592593 | 49.993 |
| 0.5042708333333333 | 49.992 |
| 0.5042824074074074 | 49.992 |
| 0.5042939814814814 | 49.991 |
| 0.5043055555555556 | 49.988 |
| 0.5043171296296296 | 49.987 |
| 0.5043287037037038 | 49.987 |
| 0.5043402777777778 | 49.988 |
| 0.5043518518518518 | 49.986 |
| 0.5043634259259259 | 49.984 |
| 0.504375 | 49.983 |
| 0.5043865740740741 | 49.983 |
| 0.5043981481481482 | 49.982 |
| 0.5044097222222222 | 49.982 |
| 0.5044212962962963 | 49.983 |
| 0.5044328703703703 | 49.985 |
| 0.5044444444444445 | 49.985 |
| 0.5044560185185185 | 49.986 |
| 0.5044675925925927 | 49.988 |
| 0.5044791666666667 | 49.989 |
| 0.5044907407407407 | 49.988 |
| 0.5045023148148148 | 49.99 |
| 0.5045138888888888 | 49.99 |
| 0.504525462962963 | 49.99 |
| 0.504537037037037 | 49.989 |
| 0.5045486111111112 | 49.988 |
| 0.5045601851851852 | 49.988 |
| 0.5045717592592592 | 49.991 |
| 0.5045833333333333 | 49.993 |
| 0.5045949074074074 | 49.994 |
| 0.5046064814814815 | 49.993 |
| 0.5046180555555556 | 49.994 |
| 0.5046296296296297 | 49.995 |
| 0.5046412037037037 | 49.996 |
| 0.5046527777777777 | 49.996 |
| 0.5046643518518519 | 49.998 |
| 0.5046759259259259 | 50 |
| 0.5046875000000001 | 50.002 |
| 0.5046990740740741 | 50.004 |
| 0.5047106481481481 | 50.004 |
| 0.5047222222222222 | 50.004 |
| 0.5047337962962963 | 50.004 |
| 0.5047453703703704 | 50.005 |
| 0.5047569444444444 | 50.007 |
| 0.5047685185185186 | 50.007 |
| 0.5047800925925926 | 50.008 |
| 0.5047916666666666 | 50.009 |
| 0.5048032407407407 | 50.01 |
| 0.5048148148148148 | 50.009 |
| 0.5048263888888889 | 50.006 |
| 0.504837962962963 | 50.004 |
| 0.504849537037037 | 50.003 |
| 0.5048611111111111 | 50.003 |
| 0.5048726851851851 | 50.003 |
| 0.5048842592592593 | 50.001 |
| 0.5048958333333333 | 50.001 |
| 0.5049074074074075 | 50.001 |
| 0.5049189814814815 | 50.001 |
| 0.5049305555555555 | 50.002 |
| 0.5049421296296296 | 50.004 |
| 0.5049537037037037 | 50.006 |
| 0.5049652777777778 | 50.009 |
| 0.5049768518518518 | 50.013 |
| 0.504988425925926 | 50.017 |
| 0.505 | 50.017 |
| 0.505011574074074 | 50.019 |
| 0.5050231481481481 | 50.017 |
| 0.5050347222222222 | 50.015 |
| 0.5050462962962963 | 50.013 |
| 0.5050578703703704 | 50.011 |
| 0.5050694444444445 | 50.01 |
| 0.5050810185185185 | 50.008 |
| 0.5050925925925925 | 50.006 |
| 0.5051041666666667 | 50.003 |
| 0.5051157407407407 | 50.001 |
| 0.5051273148148149 | 49.999 |
| 0.5051388888888889 | 49.996 |
| 0.505150462962963 | 49.995 |
| 0.505162037037037 | 49.993 |
| 0.5051736111111111 | 49.991 |
| 0.5051851851851852 | 49.988 |
| 0.5051967592592593 | 49.988 |
| 0.5052083333333334 | 49.987 |
| 0.5052199074074074 | 49.986 |
| 0.5052314814814814 | 49.986 |
| 0.5052430555555555 | 49.985 |
| 0.5052546296296296 | 49.986 |
| 0.5052662037037037 | 49.987 |
| 0.5052777777777778 | 49.987 |
| 0.5052893518518519 | 49.987 |
| 0.5053009259259259 | 49.988 |
| 0.5053124999999999 | 49.988 |
| 0.5053240740740741 | 49.989 |
| 0.5053356481481481 | 49.99 |
| 0.5053472222222223 | 49.992 |
| 0.5053587962962963 | 49.995 |
| 0.5053703703703704 | 49.999 |
| 0.5053819444444444 | 50.003 |
| 0.5053935185185185 | 50.008 |
| 0.5054050925925926 | 50.012 |
| 0.5054166666666667 | 50.016 |
| 0.5054282407407408 | 50.016 |
| 0.5054398148148148 | 50.016 |
| 0.5054513888888889 | 50.017 |
| 0.5054629629629629 | 50.015 |
| 0.505474537037037 | 50.016 |
| 0.5054861111111111 | 50.014 |
| 0.5054976851851852 | 50.014 |
| 0.5055092592592593 | 50.014 |
| 0.5055208333333333 | 50.017 |
| 0.5055324074074073 | 50.018 |
| 0.5055439814814815 | 50.019 |
| 0.5055555555555555 | 50.021 |
| 0.5055671296296297 | 50.02 |
| 0.5055787037037037 | 50.019 |
| 0.5055902777777778 | 50.018 |
| 0.5056018518518518 | 50.016 |
| 0.505613425925926 | 50.013 |
| 0.505625 | 50.01 |
| 0.5056365740740741 | 50.006 |
| 0.5056481481481482 | 50.004 |
| 0.5056597222222222 | 50.001 |
| 0.5056712962962963 | 50 |
| 0.5056828703703703 | 49.997 |
| 0.5056944444444444 | 49.995 |
| 0.5057060185185185 | 49.993 |
| 0.5057175925925926 | 49.991 |
| 0.5057291666666667 | 49.989 |
| 0.5057407407407407 | 49.986 |
| 0.5057523148148148 | 49.979 |
| 0.5057638888888889 | 49.976 |
| 0.5057754629629629 | 49.973 |
| 0.5057870370370371 | 49.969 |
| 0.5057986111111111 | 49.966 |
| 0.5058101851851852 | 49.963 |
| 0.5058217592592592 | 49.963 |
| 0.5058333333333334 | 49.962 |
| 0.5058449074074074 | 49.961 |
| 0.5058564814814815 | 49.961 |
| 0.5058680555555556 | 49.961 |
| 0.5058796296296296 | 49.962 |
| 0.5058912037037037 | 49.962 |
| 0.5059027777777778 | 49.961 |
| 0.5059143518518519 | 49.961 |
| 0.5059259259259259 | 49.959 |
| 0.5059375 | 49.957 |
| 0.5059490740740741 | 49.957 |
| 0.5059606481481481 | 49.955 |
| 0.5059722222222222 | 49.956 |
| 0.5059837962962963 | 49.956 |
| 0.5059953703703703 | 49.959 |
| 0.5060069444444445 | 49.959 |
| 0.5060185185185185 | 49.96 |
| 0.5060300925925926 | 49.958 |
| 0.5060416666666666 | 49.958 |
| 0.5060532407407408 | 49.956 |
| 0.5060648148148148 | 49.954 |
| 0.506076388888889 | 49.953 |
| 0.506087962962963 | 49.951 |
| 0.506099537037037 | 49.951 |
| 0.5061111111111111 | 49.952 |
| 0.5061226851851852 | 49.953 |
| 0.5061342592592593 | 49.955 |
| 0.5061458333333334 | 49.957 |
| 0.5061574074074074 | 49.959 |
| 0.5061689814814815 | 49.959 |
| 0.5061805555555555 | 49.961 |
| 0.5061921296296296 | 49.962 |
| 0.5062037037037037 | 49.963 |
| 0.5062152777777778 | 49.962 |
| 0.5062268518518519 | 49.963 |
| 0.5062384259259259 | 49.963 |
| 0.50625 | 49.964 |
| 0.506261574074074 | 49.965 |
| 0.5062731481481482 | 49.964 |
| 0.5062847222222222 | 49.963 |
| 0.5062962962962964 | 49.963 |
| 0.5063078703703704 | 49.962 |
| 0.5063194444444444 | 49.963 |
| 0.5063310185185185 | 49.965 |
| 0.5063425925925926 | 49.967 |
| 0.5063541666666667 | 49.968 |
| 0.5063657407407408 | 49.968 |
| 0.5063773148148148 | 49.968 |
| 0.5063888888888889 | 49.969 |
| 0.5064004629629629 | 49.967 |
| 0.506412037037037 | 49.966 |
| 0.5064236111111111 | 49.967 |
| 0.5064351851851852 | 49.968 |
| 0.5064467592592593 | 49.967 |
| 0.5064583333333333 | 49.968 |
| 0.5064699074074074 | 49.967 |
| 0.5064814814814814 | 49.968 |
| 0.5064930555555556 | 49.967 |
| 0.5065046296296296 | 49.968 |
| 0.5065162037037038 | 49.969 |
| 0.5065277777777778 | 49.97 |
| 0.5065393518518518 | 49.97 |
| 0.5065509259259259 | 49.969 |
| 0.5065625 | 49.968 |
| 0.5065740740740741 | 49.966 |
| 0.5065856481481482 | 49.966 |
| 0.5065972222222223 | 49.965 |
| 0.5066087962962963 | 49.967 |
| 0.5066203703703703 | 49.969 |
| 0.5066319444444445 | 49.972 |
| 0.5066435185185185 | 49.975 |
| 0.5066550925925926 | 49.979 |
| 0.5066666666666667 | 49.982 |
| 0.5066782407407407 | 49.988 |
| 0.5066898148148148 | 49.993 |
| 0.5067013888888888 | 49.997 |
| 0.506712962962963 | 49.999 |
| 0.506724537037037 | 50.002 |
| 0.5067361111111112 | 50.004 |
| 0.5067476851851852 | 50.004 |
| 0.5067592592592592 | 50.006 |
| 0.5067708333333333 | 50.007 |
| 0.5067824074074074 | 50.008 |
| 0.5067939814814815 | 50.01 |
| 0.5068055555555556 | 50.012 |
| 0.5068171296296297 | 50.015 |
| 0.5068287037037037 | 50.015 |
| 0.5068402777777777 | 50.017 |
| 0.5068518518518519 | 50.017 |
| 0.5068634259259259 | 50.016 |
| 0.506875 | 50.017 |
| 0.5068865740740741 | 50.016 |
| 0.5068981481481482 | 50.016 |
| 0.5069097222222222 | 50.016 |
| 0.5069212962962962 | 50.016 |
| 0.5069328703703704 | 50.016 |
| 0.5069444444444444 | 50.018 |
| 0.5069560185185186 | 50.018 |
| 0.5069675925925926 | 50.019 |
| 0.5069791666666666 | 50.02 |
| 0.5069907407407407 | 50.02 |
| 0.5070023148148148 | 50.022 |
| 0.5070138888888889 | 50.022 |
| 0.507025462962963 | 50.024 |
| 0.5070370370370371 | 50.021 |
| 0.5070486111111111 | 50.019 |
| 0.5070601851851851 | 50.019 |
| 0.5070717592592593 | 50.017 |
| 0.5070833333333333 | 50.015 |
| 0.5070949074074075 | 50.011 |
| 0.5071064814814815 | 50.009 |
| 0.5071180555555556 | 50.006 |
| 0.5071296296296296 | 50.003 |
| 0.5071412037037036 | 50.001 |
| 0.5071527777777778 | 50 |
| 0.5071643518518518 | 50 |
| 0.507175925925926 | 49.998 |
| 0.5071875 | 49.996 |
| 0.507199074074074 | 49.995 |
| 0.5072106481481481 | 49.994 |
| 0.5072222222222222 | 49.993 |
| 0.5072337962962963 | 49.992 |
| 0.5072453703703704 | 49.99 |
| 0.5072569444444445 | 49.988 |
| 0.5072685185185185 | 49.988 |
| 0.5072800925925925 | 49.985 |
| 0.5072916666666667 | 49.982 |
| 0.5073032407407407 | 49.981 |
| 0.5073148148148149 | 49.979 |
| 0.5073263888888889 | 49.976 |
| 0.507337962962963 | 49.975 |
| 0.507349537037037 | 49.973 |
| 0.507361111111111 | 49.973 |
| 0.5073726851851852 | 49.973 |
| 0.5073842592592592 | 49.975 |
| 0.5073958333333334 | 49.978 |
| 0.5074074074074074 | 49.979 |
| 0.5074189814814815 | 49.982 |
| 0.5074305555555555 | 49.984 |
| 0.5074421296296296 | 49.984 |
| 0.5074537037037037 | 49.986 |
| 0.5074652777777778 | 49.986 |
| 0.5074768518518519 | 49.987 |
| 0.5074884259259259 | 49.987 |
| 0.5075 | 49.986 |
| 0.5075115740740741 | 49.985 |
| 0.5075231481481481 | 49.984 |
| 0.5075347222222223 | 49.984 |
| 0.5075462962962963 | 49.981 |
| 0.5075578703703704 | 49.98 |
| 0.5075694444444444 | 49.976 |
| 0.5075810185185184 | 49.973 |
| 0.5075925925925926 | 49.97 |
| 0.5076041666666666 | 49.968 |
| 0.5076157407407408 | 49.966 |
| 0.5076273148148148 | 49.967 |
| 0.5076388888888889 | 49.969 |
| 0.5076504629629629 | 49.967 |
| 0.507662037037037 | 49.965 |
| 0.5076736111111111 | 49.967 |
| 0.5076851851851852 | 49.964 |
| 0.5076967592592593 | 49.966 |
| 0.5077083333333333 | 49.967 |
| 0.5077199074074074 | 49.967 |
| 0.5077314814814815 | 49.966 |
| 0.5077430555555555 | 49.965 |
| 0.5077546296296297 | 49.965 |
| 0.5077662037037037 | 49.965 |
| 0.5077777777777778 | 49.965 |
| 0.5077893518518518 | 49.966 |
| 0.507800925925926 | 49.966 |
| 0.5078125 | 49.966 |
| 0.507824074074074 | 49.964 |
| 0.5078356481481482 | 49.964 |
| 0.5078472222222222 | 49.963 |
| 0.5078587962962963 | 49.964 |
| 0.5078703703703703 | 49.965 |
| 0.5078819444444445 | 49.963 |
| 0.5078935185185185 | 49.96 |
| 0.5079050925925926 | 49.96 |
| 0.5079166666666667 | 49.959 |
| 0.5079282407407407 | 49.96 |
| 0.5079398148148148 | 49.959 |
| 0.5079513888888889 | 49.958 |
| 0.507962962962963 | 49.958 |
| 0.5079745370370371 | 49.96 |
| 0.5079861111111111 | 49.962 |
| 0.5079976851851852 | 49.965 |
| 0.5080092592592592 | 49.964 |
| 0.5080208333333334 | 49.965 |
| 0.5080324074074074 | 49.964 |
| 0.5080439814814816 | 49.965 |
| 0.5080555555555556 | 49.965 |
| 0.5080671296296296 | 49.964 |
| 0.5080787037037037 | 49.965 |
| 0.5080902777777777 | 49.965 |
| 0.5081018518518519 | 49.965 |
| 0.5081134259259259 | 49.964 |
| 0.508125 | 49.962 |
| 0.5081365740740741 | 49.961 |
| 0.5081481481481481 | 49.962 |
| 0.5081597222222222 | 49.962 |
| 0.5081712962962963 | 49.962 |
| 0.5081828703703704 | 49.962 |
| 0.5081944444444445 | 49.963 |
| 0.5082060185185185 | 49.964 |
| 0.5082175925925926 | 49.966 |
| 0.5082291666666666 | 49.967 |
| 0.5082407407407408 | 49.967 |
| 0.5082523148148148 | 49.968 |
| 0.508263888888889 | 49.969 |
| 0.508275462962963 | 49.97 |
| 0.508287037037037 | 49.97 |
| 0.5082986111111111 | 49.97 |
| 0.5083101851851851 | 49.97 |
| 0.5083217592592593 | 49.969 |
| 0.5083333333333333 | 49.968 |
| 0.5083449074074075 | 49.966 |
| 0.5083564814814815 | 49.966 |
| 0.5083680555555555 | 49.965 |
| 0.5083796296296296 | 49.965 |
| 0.5083912037037037 | 49.963 |
| 0.5084027777777778 | 49.96 |
| 0.5084143518518519 | 49.96 |
| 0.508425925925926 | 49.958 |
| 0.5084375 | 49.955 |
| 0.508449074074074 | 49.953 |
| 0.5084606481481482 | 49.951 |
| 0.5084722222222222 | 49.949 |
| 0.5084837962962964 | 49.947 |
| 0.5084953703703704 | 49.947 |
| 0.5085069444444444 | 49.948 |
| 0.5085185185185185 | 49.949 |
| 0.5085300925925925 | 49.949 |
| 0.5085416666666667 | 49.95 |
| 0.5085532407407407 | 49.951 |
| 0.5085648148148149 | 49.952 |
| 0.5085763888888889 | 49.954 |
| 0.5085879629629629 | 49.953 |
| 0.508599537037037 | 49.953 |
| 0.5086111111111111 | 49.954 |
| 0.5086226851851852 | 49.953 |
| 0.5086342592592593 | 49.955 |
| 0.5086458333333334 | 49.955 |
| 0.5086574074074074 | 49.956 |
| 0.5086689814814814 | 49.958 |
| 0.5086805555555556 | 49.958 |
| 0.5086921296296296 | 49.961 |
| 0.5087037037037038 | 49.961 |
| 0.5087152777777778 | 49.964 |
| 0.5087268518518518 | 49.966 |
| 0.5087384259259259 | 49.969 |
| 0.50875 | 49.97 |
| 0.5087615740740741 | 49.971 |
| 0.5087731481481481 | 49.972 |
| 0.5087847222222223 | 49.974 |
| 0.5087962962962963 | 49.976 |
| 0.5088078703703703 | 49.977 |
| 0.5088194444444444 | 49.978 |
| 0.5088310185185185 | 49.977 |
| 0.5088425925925926 | 49.976 |
| 0.5088541666666667 | 49.974 |
| 0.5088657407407408 | 49.971 |
| 0.5088773148148148 | 49.969 |
| 0.5088888888888888 | 49.968 |
| 0.508900462962963 | 49.967 |
| 0.508912037037037 | 49.966 |
| 0.5089236111111112 | 49.966 |
| 0.5089351851851852 | 49.967 |
| 0.5089467592592593 | 49.966 |
| 0.5089583333333333 | 49.967 |
| 0.5089699074074074 | 49.968 |
| 0.5089814814814815 | 49.969 |
| 0.5089930555555555 | 49.973 |
| 0.5090046296296297 | 49.977 |
| 0.5090162037037037 | 49.98 |
| 0.5090277777777777 | 49.981 |
| 0.5090393518518518 | 49.981 |
| 0.5090509259259259 | 49.982 |
| 0.5090625 | 49.982 |
| 0.5090740740740741 | 49.984 |
| 0.5090856481481482 | 49.987 |
| 0.5090972222222222 | 49.99 |
| 0.5091087962962962 | 49.992 |
| 0.5091203703703704 | 49.992 |
| 0.5091319444444444 | 49.993 |
| 0.5091435185185186 | 49.995 |
| 0.5091550925925926 | 49.996 |
| 0.5091666666666667 | 49.994 |
| 0.5091782407407407 | 49.994 |
| 0.5091898148148148 | 49.993 |
| 0.5092013888888889 | 49.991 |
| 0.509212962962963 | 49.99 |
| 0.5092245370370371 | 49.989 |
| 0.5092361111111111 | 49.988 |
| 0.5092476851851852 | 49.99 |
| 0.5092592592592592 | 49.989 |
| 0.5092708333333333 | 49.992 |
| 0.5092824074074074 | 49.994 |
| 0.5092939814814815 | 49.995 |
| 0.5093055555555556 | 49.996 |
| 0.5093171296296296 | 49.999 |
| 0.5093287037037036 | 50.001 |
| 0.5093402777777778 | 50.003 |
| 0.5093518518518518 | 50.005 |
| 0.509363425925926 | 50.006 |
| 0.509375 | 50.005 |
| 0.5093865740740741 | 50.005 |
| 0.5093981481481481 | 50.004 |
| 0.5094097222222222 | 50.004 |
| 0.5094212962962963 | 50.001 |
| 0.5094328703703704 | 49.998 |
| 0.5094444444444445 | 49.995 |
| 0.5094560185185185 | 49.992 |
| 0.5094675925925926 | 49.989 |
| 0.5094791666666666 | 49.987 |
| 0.5094907407407407 | 49.985 |
| 0.5095023148148148 | 49.987 |
| 0.5095138888888889 | 49.985 |
| 0.509525462962963 | 49.986 |
| 0.509537037037037 | 49.984 |
| 0.509548611111111 | 49.983 |
| 0.5095601851851852 | 49.984 |
| 0.5095717592592592 | 49.986 |
| 0.5095833333333334 | 49.987 |
| 0.5095949074074074 | 49.987 |
| 0.5096064814814815 | 49.987 |
| 0.5096180555555555 | 49.986 |
| 0.5096296296296297 | 49.986 |
| 0.5096412037037037 | 49.986 |
| 0.5096527777777778 | 49.985 |
| 0.5096643518518519 | 49.983 |
| 0.5096759259259259 | 49.981 |
| 0.5096875 | 49.979 |
| 0.5096990740740741 | 49.976 |
| 0.5097106481481481 | 49.972 |
| 0.5097222222222222 | 49.969 |
| 0.5097337962962963 | 49.966 |
| 0.5097453703703704 | 49.966 |
| 0.5097569444444444 | 49.965 |
| 0.5097685185185185 | 49.964 |
| 0.5097800925925926 | 49.964 |
| 0.5097916666666666 | 49.964 |
| 0.5098032407407408 | 49.964 |
| 0.5098148148148148 | 49.964 |
| 0.5098263888888889 | 49.965 |
| 0.5098379629629629 | 49.966 |
| 0.5098495370370371 | 49.967 |
| 0.5098611111111111 | 49.967 |
| 0.5098726851851852 | 49.967 |
| 0.5098842592592593 | 49.967 |
| 0.5098958333333333 | 49.964 |
| 0.5099074074074074 | 49.962 |
| 0.5099189814814815 | 49.959 |
| 0.5099305555555556 | 49.957 |
| 0.5099421296296297 | 49.956 |
| 0.5099537037037037 | 49.957 |
| 0.5099652777777778 | 49.959 |
| 0.5099768518518518 | 49.961 |
| 0.5099884259259259 | 49.964 |
| 0.51 | 49.968 |
| 0.510011574074074 | 49.97 |
| 0.5100231481481482 | 49.971 |
| 0.5100347222222222 | 49.972 |
| 0.5100462962962963 | 49.973 |
| 0.5100578703703703 | 49.975 |
| 0.5100694444444445 | 49.975 |
| 0.5100810185185185 | 49.976 |
| 0.5100925925925927 | 49.976 |
| 0.5101041666666667 | 49.976 |
| 0.5101157407407407 | 49.977 |
| 0.5101273148148148 | 49.979 |
| 0.5101388888888889 | 49.98 |
| 0.510150462962963 | 49.983 |
| 0.5101620370370371 | 49.983 |
| 0.5101736111111111 | 49.983 |
| 0.5101851851851852 | 49.984 |
| 0.5101967592592592 | 49.983 |
| 0.5102083333333333 | 49.983 |
| 0.5102199074074074 | 49.982 |
| 0.5102314814814815 | 49.981 |
| 0.5102430555555556 | 49.983 |
| 0.5102546296296296 | 49.983 |
| 0.5102662037037037 | 49.983 |
| 0.5102777777777777 | 49.984 |
| 0.5102893518518519 | 49.985 |
| 0.5103009259259259 | 49.985 |
| 0.5103125000000001 | 49.984 |
| 0.5103240740740741 | 49.981 |
| 0.5103356481481481 | 49.979 |
| 0.5103472222222222 | 49.976 |
| 0.5103587962962963 | 49.975 |
| 0.5103703703703704 | 49.972 |
| 0.5103819444444445 | 49.969 |
| 0.5103935185185186 | 49.969 |
| 0.5104050925925926 | 49.967 |
| 0.5104166666666666 | 49.967 |
| 0.5104282407407407 | 49.965 |
| 0.5104398148148148 | 49.964 |
| 0.5104513888888889 | 49.962 |
| 0.510462962962963 | 49.959 |
| 0.510474537037037 | 49.959 |
| 0.5104861111111111 | 49.959 |
| 0.5104976851851851 | 49.958 |
| 0.5105092592592593 | 49.957 |
| 0.5105208333333333 | 49.957 |
| 0.5105324074074075 | 49.955 |
| 0.5105439814814815 | 49.955 |
| 0.5105555555555555 | 49.954 |
| 0.5105671296296296 | 49.953 |
| 0.5105787037037037 | 49.955 |
| 0.5105902777777778 | 49.956 |
| 0.5106018518518519 | 49.959 |
| 0.510613425925926 | 49.96 |
| 0.510625 | 49.961 |
| 0.510636574074074 | 49.964 |
| 0.5106481481481482 | 49.965 |
| 0.5106597222222222 | 49.967 |
| 0.5106712962962963 | 49.97 |
| 0.5106828703703704 | 49.973 |
| 0.5106944444444445 | 49.975 |
| 0.5107060185185185 | 49.976 |
| 0.5107175925925925 | 49.975 |
| 0.5107291666666667 | 49.976 |
| 0.5107407407407407 | 49.978 |
| 0.5107523148148149 | 49.979 |
| 0.5107638888888889 | 49.979 |
| 0.510775462962963 | 49.979 |
| 0.510787037037037 | 49.981 |
| 0.5107986111111111 | 49.984 |
| 0.5108101851851852 | 49.986 |
| 0.5108217592592593 | 49.986 |
| 0.5108333333333334 | 49.986 |
| 0.5108449074074074 | 49.988 |
| 0.5108564814814814 | 49.988 |
| 0.5108680555555556 | 49.986 |
| 0.5108796296296296 | 49.986 |
| 0.5108912037037037 | 49.987 |
| 0.5109027777777778 | 49.987 |
| 0.5109143518518519 | 49.985 |
| 0.5109259259259259 | 49.985 |
| 0.5109374999999999 | 49.986 |
| 0.5109490740740741 | 49.986 |
| 0.5109606481481481 | 49.989 |
| 0.5109722222222223 | 49.992 |
| 0.5109837962962963 | 49.995 |
| 0.5109953703703703 | 49.997 |
| 0.5110069444444444 | 50 |
| 0.5110185185185185 | 50.003 |
| 0.5110300925925926 | 50.006 |
| 0.5110416666666667 | 50.009 |
| 0.5110532407407408 | 50.011 |
| 0.5110648148148148 | 50.012 |
| 0.5110763888888888 | 50.012 |
| 0.511087962962963 | 50.012 |
| 0.511099537037037 | 50.011 |
| 0.5111111111111112 | 50.01 |
| 0.5111226851851852 | 50.006 |
| 0.5111342592592593 | 50.003 |
| 0.5111458333333333 | 50 |
| 0.5111574074074073 | 49.999 |
| 0.5111689814814815 | 49.997 |
| 0.5111805555555555 | 49.996 |
| 0.5111921296296297 | 49.996 |
| 0.5112037037037037 | 49.993 |
| 0.5112152777777778 | 49.992 |
| 0.5112268518518518 | 49.989 |
| 0.5112384259259259 | 49.987 |
| 0.51125 | 49.985 |
| 0.5112615740740741 | 49.983 |
| 0.5112731481481482 | 49.981 |
| 0.5112847222222222 | 49.983 |
| 0.5112962962962962 | 49.984 |
| 0.5113078703703704 | 49.987 |
| 0.5113194444444444 | 49.99 |
| 0.5113310185185186 | 49.992 |
| 0.5113425925925926 | 49.995 |
| 0.5113541666666667 | 49.996 |
| 0.5113657407407407 | 49.998 |
| 0.5113773148148147 | 49.999 |
| 0.5113888888888889 | 50.002 |
| 0.5114004629629629 | 50.004 |
| 0.5114120370370371 | 50.005 |
| 0.5114236111111111 | 50.008 |
| 0.5114351851851852 | 50.009 |
| 0.5114467592592592 | 50.01 |
| 0.5114583333333333 | 50.012 |
| 0.5114699074074074 | 50.014 |
| 0.5114814814814815 | 50.015 |
| 0.5114930555555556 | 50.02 |
| 0.5115046296296296 | 50.022 |
| 0.5115162037037037 | 50.022 |
| 0.5115277777777778 | 50.022 |
| 0.5115393518518518 | 50.021 |
| 0.511550925925926 | 50.02 |
| 0.5115625 | 50.02 |
| 0.5115740740740741 | 50.019 |
| 0.5115856481481481 | 50.021 |
| 0.5115972222222221 | 50.022 |
| 0.5116087962962963 | 50.021 |
| 0.5116203703703703 | 50.022 |
| 0.5116319444444445 | 50.025 |
| 0.5116435185185185 | 50.025 |
| 0.5116550925925926 | 50.025 |
| 0.5116666666666666 | 50.024 |
| 0.5116782407407408 | 50.022 |
| 0.5116898148148148 | 50.023 |
| 0.5117013888888889 | 50.024 |
| 0.511712962962963 | 50.025 |
| 0.511724537037037 | 50.024 |
| 0.5117361111111111 | 50.023 |
| 0.5117476851851852 | 50.022 |
| 0.5117592592592592 | 50.021 |
| 0.5117708333333334 | 50.02 |
| 0.5117824074074074 | 50.02 |
| 0.5117939814814815 | 50.019 |
| 0.5118055555555555 | 50.018 |
| 0.5118171296296297 | 50.018 |
| 0.5118287037037037 | 50.017 |
| 0.5118402777777779 | 50.015 |
| 0.5118518518518519 | 50.013 |
| 0.5118634259259259 | 50.011 |
| 0.511875 | 50.009 |
| 0.511886574074074 | 50.007 |
| 0.5118981481481482 | 50.005 |
| 0.5119097222222222 | 50.002 |
| 0.5119212962962963 | 50 |
| 0.5119328703703704 | 49.998 |
| 0.5119444444444444 | 49.997 |
| 0.5119560185185185 | 49.994 |
| 0.5119675925925926 | 49.989 |
| 0.5119791666666667 | 49.987 |
| 0.5119907407407408 | 49.987 |
| 0.5120023148148148 | 49.987 |
| 0.5120138888888889 | 49.985 |
| 0.5120254629629629 | 49.985 |
| 0.5120370370370371 | 49.985 |
| 0.5120486111111111 | 49.986 |
| 0.5120601851851853 | 49.986 |
| 0.5120717592592593 | 49.988 |
| 0.5120833333333333 | 49.99 |
| 0.5120949074074074 | 49.993 |
| 0.5121064814814814 | 49.995 |
| 0.5121180555555556 | 50 |
| 0.5121296296296296 | 50.003 |
| 0.5121412037037038 | 50.006 |
| 0.5121527777777778 | 50.01 |
| 0.5121643518518518 | 50.014 |
| 0.5121759259259259 | 50.017 |
| 0.5121875 | 50.018 |
| 0.5121990740740741 | 50.018 |
| 0.5122106481481482 | 50.021 |
| 0.5122222222222222 | 50.023 |
| 0.5122337962962963 | 50.026 |
| 0.5122453703703703 | 50.028 |
| 0.5122569444444445 | 50.03 |
| 0.5122685185185185 | 50.031 |
| 0.5122800925925927 | 50.031 |
| 0.5122916666666667 | 50.033 |
| 0.5123032407407407 | 50.035 |
| 0.5123148148148148 | 50.035 |
| 0.5123263888888888 | 50.033 |
| 0.512337962962963 | 50.031 |
| 0.512349537037037 | 50.029 |
| 0.5123611111111112 | 50.025 |
| 0.5123726851851852 | 50.02 |
| 0.5123842592592592 | 50.017 |
| 0.5123958333333333 | 50.017 |
| 0.5124074074074074 | 50.018 |
| 0.5124189814814815 | 50.019 |
| 0.5124305555555556 | 50.018 |
| 0.5124421296296297 | 50.018 |
| 0.5124537037037037 | 50.02 |
| 0.5124652777777777 | 50.021 |
| 0.5124768518518519 | 50.021 |
| 0.5124884259259259 | 50.022 |
| 0.5125000000000001 | 50.026 |
| 0.5125115740740741 | 50.03 |
| 0.5125231481481481 | 50.032 |
| 0.5125347222222222 | 50.034 |
| 0.5125462962962963 | 50.037 |
| 0.5125578703703704 | 50.039 |
| 0.5125694444444444 | 50.041 |
| 0.5125810185185186 | 50.043 |
| 0.5125925925925926 | 50.045 |
| 0.5126041666666666 | 50.048 |
| 0.5126157407407407 | 50.05 |
| 0.5126273148148148 | 50.05 |
| 0.5126388888888889 | 50.049 |
| 0.512650462962963 | 50.049 |
| 0.512662037037037 | 50.048 |
| 0.5126736111111111 | 50.046 |
| 0.5126851851851851 | 50.044 |
| 0.5126967592592593 | 50.044 |
| 0.5127083333333333 | 50.044 |
| 0.5127199074074075 | 50.043 |
| 0.5127314814814815 | 50.042 |
| 0.5127430555555555 | 50.043 |
| 0.5127546296296296 | 50.044 |
| 0.5127662037037037 | 50.045 |
| 0.5127777777777778 | 50.046 |
| 0.5127893518518518 | 50.045 |
| 0.512800925925926 | 50.046 |
| 0.5128125 | 50.047 |
| 0.512824074074074 | 50.048 |
| 0.5128356481481481 | 50.049 |
| 0.5128472222222222 | 50.051 |
| 0.5128587962962963 | 50.051 |
| 0.5128703703703704 | 50.051 |
| 0.5128819444444445 | 50.05 |
| 0.5128935185185185 | 50.048 |
| 0.5129050925925925 | 50.047 |
| 0.5129166666666667 | 50.045 |
| 0.5129282407407407 | 50.043 |
| 0.5129398148148149 | 50.044 |
| 0.5129513888888889 | 50.045 |
| 0.512962962962963 | 50.047 |
| 0.512974537037037 | 50.046 |
| 0.5129861111111111 | 50.047 |
| 0.5129976851851852 | 50.047 |
| 0.5130092592592593 | 50.048 |
| 0.5130208333333334 | 50.047 |
| 0.5130324074074074 | 50.046 |
| 0.5130439814814814 | 50.046 |
| 0.5130555555555555 | 50.045 |
| 0.5130671296296296 | 50.044 |
| 0.5130787037037037 | 50.045 |
| 0.5130902777777778 | 50.046 |
| 0.5131018518518519 | 50.048 |
| 0.5131134259259259 | 50.05 |
| 0.5131249999999999 | 50.051 |
| 0.5131365740740741 | 50.052 |
| 0.5131481481481481 | 50.054 |
| 0.5131597222222223 | 50.054 |
| 0.5131712962962963 | 50.055 |
| 0.5131828703703704 | 50.057 |
| 0.5131944444444444 | 50.059 |
| 0.5132060185185185 | 50.061 |
| 0.5132175925925926 | 50.062 |
| 0.5132291666666667 | 50.062 |
| 0.5132407407407408 | 50.061 |
| 0.5132523148148148 | 50.061 |
| 0.5132638888888889 | 50.06 |
| 0.5132754629629629 | 50.059 |
| 0.513287037037037 | 50.059 |
| 0.5132986111111111 | 50.059 |
| 0.5133101851851852 | 50.059 |
| 0.5133217592592593 | 50.059 |
| 0.5133333333333333 | 50.058 |
| 0.5133449074074073 | 50.056 |
| 0.5133564814814815 | 50.057 |
| 0.5133680555555555 | 50.057 |
| 0.5133796296296297 | 50.055 |
| 0.5133912037037037 | 50.053 |
| 0.5134027777777778 | 50.051 |
| 0.5134143518518518 | 50.05 |
| 0.513425925925926 | 50.051 |
| 0.5134375 | 50.053 |
| 0.5134490740740741 | 50.057 |
| 0.5134606481481482 | 50.059 |
| 0.5134722222222222 | 50.063 |
| 0.5134837962962963 | 50.065 |
| 0.5134953703703703 | 50.066 |
| 0.5135069444444444 | 50.068 |
| 0.5135185185185185 | 50.07 |
| 0.5135300925925926 | 50.072 |
| 0.5135416666666667 | 50.073 |
| 0.5135532407407407 | 50.073 |
| 0.5135648148148148 | 50.075 |
| 0.5135763888888889 | 50.076 |
| 0.5135879629629629 | 50.076 |
| 0.5135995370370371 | 50.077 |
| 0.5136111111111111 | 50.077 |
| 0.5136226851851852 | 50.077 |
| 0.5136342592592592 | 50.076 |
| 0.5136458333333334 | 50.077 |
| 0.5136574074074074 | 50.078 |
| 0.5136689814814815 | 50.08 |
| 0.5136805555555556 | 50.079 |
| 0.5136921296296296 | 50.078 |
| 0.5137037037037037 | 50.076 |
| 0.5137152777777778 | 50.074 |
| 0.5137268518518519 | 50.073 |
| 0.513738425925926 | 50.071 |
| 0.51375 | 50.071 |
| 0.5137615740740741 | 50.073 |
| 0.5137731481481481 | 50.075 |
| 0.5137847222222222 | 50.075 |
| 0.5137962962962963 | 50.074 |
| 0.5138078703703703 | 50.076 |
| 0.5138194444444445 | 50.077 |
| 0.5138310185185185 | 50.077 |
| 0.5138425925925926 | 50.078 |
| 0.5138541666666666 | 50.081 |
| 0.5138657407407408 | 50.083 |
| 0.5138773148148148 | 50.084 |
| 0.513888888888889 | 50.085 |
| 0.513900462962963 | 50.083 |
| 0.513912037037037 | 50.081 |
| 0.5139236111111111 | 50.079 |
| 0.5139351851851852 | 50.077 |
| 0.5139467592592593 | 50.075 |
| 0.5139583333333334 | 50.076 |
| 0.5139699074074074 | 50.076 |
| 0.5139814814814815 | 50.077 |
| 0.5139930555555555 | 50.077 |
| 0.5140046296296296 | 50.078 |
| 0.5140162037037037 | 50.08 |
| 0.5140277777777778 | 50.08 |
| 0.5140393518518519 | 50.08 |
| 0.5140509259259259 | 50.081 |
| 0.5140625 | 50.083 |
| 0.514074074074074 | 50.085 |
| 0.5140856481481482 | 50.087 |
| 0.5140972222222222 | 50.088 |
| 0.5141087962962964 | 50.09 |
| 0.5141203703703704 | 50.09 |
| 0.5141319444444444 | 50.09 |
| 0.5141435185185185 | 50.088 |
| 0.5141550925925926 | 50.088 |
| 0.5141666666666667 | 50.09 |
| 0.5141782407407408 | 50.091 |
| 0.5141898148148148 | 50.092 |
| 0.5142013888888889 | 50.092 |
| 0.5142129629629629 | 50.093 |
| 0.514224537037037 | 50.092 |
| 0.5142361111111111 | 50.092 |
| 0.5142476851851852 | 50.093 |
| 0.5142592592592593 | 50.096 |
| 0.5142708333333333 | 50.097 |
| 0.5142824074074074 | 50.097 |
| 0.5142939814814814 | 50.098 |
| 0.5143055555555556 | 50.099 |
| 0.5143171296296296 | 50.099 |
| 0.5143287037037038 | 50.099 |
| 0.5143402777777778 | 50.099 |
| 0.5143518518518518 | 50.097 |
| 0.5143634259259259 | 50.096 |
| 0.514375 | 50.097 |
| 0.5143865740740741 | 50.094 |
| 0.5143981481481482 | 50.093 |
| 0.5144097222222223 | 50.092 |
| 0.5144212962962963 | 50.09 |
| 0.5144328703703703 | 50.088 |
| 0.5144444444444445 | 50.086 |
| 0.5144560185185185 | 50.085 |
| 0.5144675925925926 | 50.084 |
| 0.5144791666666667 | 50.081 |
| 0.5144907407407407 | 50.08 |
| 0.5145023148148148 | 50.079 |
| 0.5145138888888888 | 50.08 |
| 0.514525462962963 | 50.08 |
| 0.514537037037037 | 50.082 |
| 0.5145486111111112 | 50.081 |
| 0.5145601851851852 | 50.082 |
| 0.5145717592592592 | 50.083 |
| 0.5145833333333333 | 50.085 |
| 0.5145949074074074 | 50.084 |
| 0.5146064814814815 | 50.084 |
| 0.5146180555555556 | 50.084 |
| 0.5146296296296297 | 50.083 |
| 0.5146412037037037 | 50.083 |
| 0.5146527777777777 | 50.081 |
| 0.5146643518518519 | 50.078 |
| 0.5146759259259259 | 50.076 |
| 0.5146875 | 50.074 |
| 0.5146990740740741 | 50.071 |
| 0.5147106481481482 | 50.071 |
| 0.5147222222222222 | 50.071 |
| 0.5147337962962962 | 50.071 |
| 0.5147453703703704 | 50.071 |
| 0.5147569444444444 | 50.072 |
| 0.5147685185185186 | 50.074 |
| 0.5147800925925926 | 50.075 |
| 0.5147916666666666 | 50.075 |
| 0.5148032407407407 | 50.075 |
| 0.5148148148148148 | 50.075 |
| 0.5148263888888889 | 50.075 |
| 0.514837962962963 | 50.076 |
| 0.5148495370370371 | 50.076 |
| 0.5148611111111111 | 50.076 |
| 0.5148726851851851 | 50.077 |
| 0.5148842592592593 | 50.077 |
| 0.5148958333333333 | 50.076 |
| 0.5149074074074074 | 50.076 |
| 0.5149189814814815 | 50.077 |
| 0.5149305555555556 | 50.078 |
| 0.5149421296296296 | 50.079 |
| 0.5149537037037036 | 50.078 |
| 0.5149652777777778 | 50.079 |
| 0.5149768518518518 | 50.077 |
| 0.514988425925926 | 50.075 |
| 0.515 | 50.074 |
| 0.515011574074074 | 50.073 |
| 0.5150231481481481 | 50.074 |
| 0.5150347222222222 | 50.074 |
| 0.5150462962962963 | 50.071 |
| 0.5150578703703704 | 50.07 |
| 0.5150694444444445 | 50.067 |
| 0.5150810185185185 | 50.065 |
| 0.5150925925925925 | 50.064 |
| 0.5151041666666667 | 50.064 |
| 0.5151157407407407 | 50.064 |
| 0.5151273148148149 | 50.062 |
| 0.5151388888888889 | 50.061 |
| 0.515150462962963 | 50.06 |
| 0.515162037037037 | 50.062 |
| 0.515173611111111 | 50.064 |
| 0.5151851851851852 | 50.068 |
| 0.5151967592592592 | 50.071 |
| 0.5152083333333334 | 50.074 |
| 0.5152199074074074 | 50.077 |
| 0.5152314814814815 | 50.079 |
| 0.5152430555555555 | 50.081 |
| 0.5152546296296296 | 50.082 |
| 0.5152662037037037 | 50.082 |
| 0.5152777777777778 | 50.082 |
| 0.5152893518518519 | 50.081 |
| 0.5153009259259259 | 50.08 |
| 0.5153125 | 50.08 |
| 0.5153240740740741 | 50.079 |
| 0.5153356481481481 | 50.078 |
| 0.5153472222222223 | 50.076 |
| 0.5153587962962963 | 50.073 |
| 0.5153703703703704 | 50.07 |
| 0.5153819444444444 | 50.07 |
| 0.5153935185185184 | 50.068 |
| 0.5154050925925926 | 50.067 |
| 0.5154166666666666 | 50.067 |
| 0.5154282407407408 | 50.069 |
| 0.5154398148148148 | 50.07 |
| 0.5154513888888889 | 50.07 |
| 0.5154629629629629 | 50.07 |
| 0.515474537037037 | 50.068 |
| 0.5154861111111111 | 50.067 |
| 0.5154976851851852 | 50.066 |
| 0.5155092592592593 | 50.065 |
| 0.5155208333333333 | 50.066 |
| 0.5155324074074074 | 50.066 |
| 0.5155439814814815 | 50.067 |
| 0.5155555555555555 | 50.066 |
| 0.5155671296296297 | 50.066 |
| 0.5155787037037037 | 50.066 |
| 0.5155902777777778 | 50.066 |
| 0.5156018518518518 | 50.065 |
| 0.515613425925926 | 50.064 |
| 0.515625 | 50.063 |
| 0.515636574074074 | 50.064 |
| 0.5156481481481482 | 50.064 |
| 0.5156597222222222 | 50.064 |
| 0.5156712962962963 | 50.064 |
| 0.5156828703703703 | 50.064 |
| 0.5156944444444445 | 50.064 |
| 0.5157060185185185 | 50.065 |
| 0.5157175925925926 | 50.066 |
| 0.5157291666666667 | 50.068 |
| 0.5157407407407407 | 50.071 |
| 0.5157523148148148 | 50.074 |
| 0.5157638888888889 | 50.075 |
| 0.515775462962963 | 50.076 |
| 0.5157870370370371 | 50.077 |
| 0.5157986111111111 | 50.077 |
| 0.5158101851851852 | 50.077 |
| 0.5158217592592592 | 50.079 |
| 0.5158333333333334 | 50.08 |
| 0.5158449074074074 | 50.081 |
| 0.5158564814814816 | 50.08 |
| 0.5158680555555556 | 50.08 |
| 0.5158796296296296 | 50.082 |
| 0.5158912037037037 | 50.081 |
| 0.5159027777777777 | 50.082 |
| 0.5159143518518519 | 50.081 |
| 0.5159259259259259 | 50.081 |
| 0.5159375 | 50.08 |
| 0.5159490740740741 | 50.077 |
| 0.5159606481481481 | 50.075 |
| 0.5159722222222222 | 50.073 |
| 0.5159837962962963 | 50.073 |
| 0.5159953703703704 | 50.073 |
| 0.5160069444444445 | 50.072 |
| 0.5160185185185185 | 50.07 |
| 0.5160300925925926 | 50.069 |
| 0.5160416666666666 | 50.069 |
| 0.5160532407407408 | 50.069 |
| 0.5160648148148148 | 50.07 |
| 0.516076388888889 | 50.073 |
| 0.516087962962963 | 50.077 |
| 0.516099537037037 | 50.077 |
| 0.5161111111111111 | 50.079 |
| 0.5161226851851851 | 50.079 |
| 0.5161342592592593 | 50.082 |
| 0.5161458333333333 | 50.083 |
| 0.5161574074074075 | 50.085 |
| 0.5161689814814815 | 50.085 |
| 0.5161805555555555 | 50.085 |
| 0.5161921296296296 | 50.085 |
| 0.5162037037037037 | 50.085 |
| 0.5162152777777778 | 50.086 |
| 0.5162268518518519 | 50.088 |
| 0.516238425925926 | 50.092 |
| 0.51625 | 50.094 |
| 0.516261574074074 | 50.096 |
| 0.5162731481481482 | 50.098 |
| 0.5162847222222222 | 50.1 |
| 0.5162962962962964 | 50.099 |
| 0.5163078703703704 | 50.098 |
| 0.5163194444444444 | 50.097 |
| 0.5163310185185185 | 50.096 |
| 0.5163425925925926 | 50.095 |
| 0.5163541666666667 | 50.092 |
| 0.5163657407407407 | 50.09 |
| 0.5163773148148149 | 50.088 |
| 0.5163888888888889 | 50.086 |
| 0.5164004629629629 | 50.085 |
| 0.516412037037037 | 50.084 |
| 0.5164236111111111 | 50.085 |
| 0.5164351851851852 | 50.086 |
| 0.5164467592592593 | 50.086 |
| 0.5164583333333334 | 50.085 |
| 0.5164699074074074 | 50.086 |
| 0.5164814814814814 | 50.087 |
| 0.5164930555555556 | 50.086 |
| 0.5165046296296296 | 50.086 |
| 0.5165162037037038 | 50.085 |
| 0.5165277777777778 | 50.085 |
| 0.5165393518518518 | 50.086 |
| 0.5165509259259259 | 50.085 |
| 0.5165625 | 50.085 |
| 0.5165740740740741 | 50.085 |
| 0.5165856481481481 | 50.082 |
| 0.5165972222222223 | 50.079 |
| 0.5166087962962963 | 50.079 |
| 0.5166203703703703 | 50.079 |
| 0.5166319444444444 | 50.083 |
| 0.5166435185185185 | 50.085 |
| 0.5166550925925926 | 50.086 |
| 0.5166666666666667 | 50.084 |
| 0.5166782407407408 | 50.084 |
| 0.5166898148148148 | 50.084 |
| 0.5167013888888888 | 50.084 |
| 0.516712962962963 | 50.084 |
| 0.516724537037037 | 50.086 |
| 0.5167361111111112 | 50.088 |
| 0.5167476851851852 | 50.087 |
| 0.5167592592592593 | 50.087 |
| 0.5167708333333333 | 50.087 |
| 0.5167824074074074 | 50.086 |
| 0.5167939814814815 | 50.084 |
| 0.5168055555555555 | 50.081 |
| 0.5168171296296297 | 50.08 |
| 0.5168287037037037 | 50.079 |
| 0.5168402777777777 | 50.079 |
| 0.5168518518518518 | 50.08 |
| 0.5168634259259259 | 50.08 |
| 0.516875 | 50.081 |
| 0.5168865740740741 | 50.081 |
| 0.5168981481481482 | 50.078 |
| 0.5169097222222222 | 50.074 |
| 0.5169212962962962 | 50.071 |
| 0.5169328703703704 | 50.068 |
| 0.5169444444444444 | 50.067 |
| 0.5169560185185186 | 50.065 |
| 0.5169675925925926 | 50.063 |
| 0.5169791666666667 | 50.062 |
| 0.5169907407407407 | 50.062 |
| 0.5170023148148148 | 50.062 |
| 0.5170138888888889 | 50.064 |
| 0.517025462962963 | 50.068 |
| 0.5170370370370371 | 50.07 |
| 0.5170486111111111 | 50.073 |
| 0.5170601851851852 | 50.075 |
| 0.5170717592592592 | 50.076 |
| 0.5170833333333333 | 50.075 |
| 0.5170949074074074 | 50.076 |
| 0.5171064814814815 | 50.078 |
| 0.5171180555555556 | 50.079 |
| 0.5171296296296296 | 50.082 |
| 0.5171412037037036 | 50.083 |
| 0.5171527777777778 | 50.083 |
| 0.5171643518518518 | 50.083 |
| 0.517175925925926 | 50.083 |
| 0.5171875 | 50.084 |
| 0.5171990740740741 | 50.083 |
| 0.5172106481481481 | 50.084 |
| 0.5172222222222222 | 50.086 |
| 0.5172337962962963 | 50.086 |
| 0.5172453703703704 | 50.087 |
| 0.5172569444444445 | 50.086 |
| 0.5172685185185185 | 50.085 |
| 0.5172800925925926 | 50.084 |
| 0.5172916666666666 | 50.082 |
| 0.5173032407407407 | 50.079 |
| 0.5173148148148148 | 50.076 |
| 0.5173263888888889 | 50.074 |
| 0.517337962962963 | 50.073 |
| 0.517349537037037 | 50.073 |
| 0.517361111111111 | 50.073 |
| 0.5173726851851852 | 50.073 |
| 0.5173842592592592 | 50.073 |
| 0.5173958333333334 | 50.074 |
| 0.5174074074074074 | 50.074 |
| 0.5174189814814815 | 50.074 |
| 0.5174305555555555 | 50.074 |
| 0.5174421296296297 | 50.076 |
| 0.5174537037037037 | 50.078 |
| 0.5174652777777778 | 50.079 |
| 0.5174768518518519 | 50.082 |
| 0.5174884259259259 | 50.083 |
| 0.5175 | 50.084 |
| 0.517511574074074 | 50.085 |
| 0.5175231481481481 | 50.086 |
| 0.5175347222222222 | 50.086 |
| 0.5175462962962963 | 50.085 |
| 0.5175578703703704 | 50.085 |
| 0.5175694444444444 | 50.084 |
| 0.5175810185185185 | 50.084 |
| 0.5175925925925926 | 50.084 |
| 0.5176041666666666 | 50.084 |
| 0.5176157407407408 | 50.082 |
| 0.5176273148148148 | 50.084 |
| 0.5176388888888889 | 50.084 |
| 0.5176504629629629 | 50.083 |
| 0.5176620370370371 | 50.081 |
| 0.5176736111111111 | 50.08 |
| 0.5176851851851852 | 50.08 |
| 0.5176967592592593 | 50.079 |
| 0.5177083333333333 | 50.078 |
| 0.5177199074074074 | 50.077 |
| 0.5177314814814815 | 50.075 |
| 0.5177430555555556 | 50.075 |
| 0.5177546296296297 | 50.075 |
| 0.5177662037037037 | 50.075 |
| 0.5177777777777778 | 50.075 |
| 0.5177893518518518 | 50.073 |
| 0.5178009259259259 | 50.072 |
| 0.5178125 | 50.07 |
| 0.517824074074074 | 50.071 |
| 0.5178356481481482 | 50.069 |
| 0.5178472222222222 | 50.069 |
| 0.5178587962962963 | 50.071 |
| 0.5178703703703703 | 50.072 |
| 0.5178819444444445 | 50.072 |
| 0.5178935185185185 | 50.073 |
| 0.5179050925925927 | 50.073 |
| 0.5179166666666667 | 50.074 |
| 0.5179282407407407 | 50.074 |
| 0.5179398148148148 | 50.072 |
| 0.5179513888888889 | 50.071 |
| 0.517962962962963 | 50.069 |
| 0.5179745370370371 | 50.066 |
| 0.5179861111111111 | 50.064 |
| 0.5179976851851852 | 50.062 |
| 0.5180092592592592 | 50.061 |
| 0.5180208333333333 | 50.061 |
| 0.5180324074074074 | 50.06 |
| 0.5180439814814815 | 50.058 |
| 0.5180555555555556 | 50.055 |
| 0.5180671296296296 | 50.053 |
| 0.5180787037037037 | 50.049 |
| 0.5180902777777777 | 50.047 |
| 0.5181018518518519 | 50.046 |
| 0.5181134259259259 | 50.045 |
| 0.5181250000000001 | 50.045 |
| 0.5181365740740741 | 50.045 |
| 0.5181481481481481 | 50.043 |
| 0.5181597222222222 | 50.042 |
| 0.5181712962962963 | 50.041 |
| 0.5181828703703704 | 50.041 |
| 0.5181944444444445 | 50.04 |
| 0.5182060185185186 | 50.039 |
| 0.5182175925925926 | 50.039 |
| 0.5182291666666666 | 50.039 |
| 0.5182407407407407 | 50.038 |
| 0.5182523148148148 | 50.037 |
| 0.5182638888888889 | 50.036 |
| 0.518275462962963 | 50.036 |
| 0.518287037037037 | 50.033 |
| 0.5182986111111111 | 50.031 |
| 0.5183101851851851 | 50.029 |
| 0.5183217592592593 | 50.028 |
| 0.5183333333333333 | 50.025 |
| 0.5183449074074075 | 50.024 |
| 0.5183564814814815 | 50.025 |
| 0.5183680555555555 | 50.028 |
| 0.5183796296296296 | 50.03 |
| 0.5183912037037037 | 50.034 |
| 0.5184027777777778 | 50.037 |
| 0.5184143518518519 | 50.04 |
| 0.518425925925926 | 50.041 |
| 0.5184375 | 50.042 |
| 0.518449074074074 | 50.043 |
| 0.5184606481481482 | 50.044 |
| 0.5184722222222222 | 50.044 |
| 0.5184837962962963 | 50.044 |
| 0.5184953703703704 | 50.046 |
| 0.5185069444444445 | 50.049 |
| 0.5185185185185185 | 50.05 |
| 0.5185300925925925 | 50.051 |
| 0.5185416666666667 | 50.05 |
| 0.5185532407407407 | 50.051 |
| 0.5185648148148149 | 50.05 |
| 0.5185763888888889 | 50.05 |
| 0.518587962962963 | 50.048 |
| 0.518599537037037 | 50.046 |
| 0.5186111111111111 | 50.044 |
| 0.5186226851851852 | 50.043 |
| 0.5186342592592593 | 50.04 |
| 0.5186458333333334 | 50.039 |
| 0.5186574074074074 | 50.04 |
| 0.5186689814814814 | 50.042 |
| 0.5186805555555556 | 50.043 |
| 0.5186921296296296 | 50.043 |
| 0.5187037037037037 | 50.043 |
| 0.5187152777777778 | 50.042 |
| 0.5187268518518519 | 50.041 |
| 0.5187384259259259 | 50.041 |
| 0.5187499999999999 | 50.041 |
| 0.5187615740740741 | 50.04 |
| 0.5187731481481481 | 50.038 |
| 0.5187847222222223 | 50.037 |
| 0.5187962962962963 | 50.035 |
| 0.5188078703703703 | 50.036 |
| 0.5188194444444444 | 50.036 |
| 0.5188310185185185 | 50.036 |
| 0.5188425925925926 | 50.037 |
| 0.5188541666666667 | 50.039 |
| 0.5188657407407408 | 50.039 |
| 0.5188773148148148 | 50.039 |
| 0.5188888888888888 | 50.04 |
| 0.518900462962963 | 50.04 |
| 0.518912037037037 | 50.039 |
| 0.5189236111111112 | 50.037 |
| 0.5189351851851852 | 50.036 |
| 0.5189467592592593 | 50.034 |
| 0.5189583333333333 | 50.031 |
| 0.5189699074074073 | 50.029 |
| 0.5189814814814815 | 50.027 |
| 0.5189930555555555 | 50.026 |
| 0.5190046296296297 | 50.026 |
| 0.5190162037037037 | 50.025 |
| 0.5190277777777778 | 50.025 |
| 0.5190393518518518 | 50.026 |
| 0.5190509259259259 | 50.027 |
| 0.5190625 | 50.029 |
| 0.5190740740740741 | 50.031 |
| 0.5190856481481482 | 50.032 |
| 0.5190972222222222 | 50.032 |
| 0.5191087962962962 | 50.033 |
| 0.5191203703703704 | 50.034 |
| 0.5191319444444444 | 50.033 |
| 0.5191435185185186 | 50.032 |
| 0.5191550925925926 | 50.031 |
| 0.5191666666666667 | 50.031 |
| 0.5191782407407407 | 50.033 |
| 0.5191898148148147 | 50.033 |
| 0.5192013888888889 | 50.033 |
| 0.5192129629629629 | 50.034 |
| 0.5192245370370371 | 50.035 |
| 0.5192361111111111 | 50.034 |
| 0.5192476851851852 | 50.033 |
| 0.5192592592592592 | 50.031 |
| 0.5192708333333333 | 50.029 |
| 0.5192824074074074 | 50.027 |
| 0.5192939814814815 | 50.026 |
| 0.5193055555555556 | 50.024 |
| 0.5193171296296296 | 50.024 |
| 0.5193287037037037 | 50.023 |
| 0.5193402777777778 | 50.023 |
| 0.5193518518518518 | 50.023 |
| 0.519363425925926 | 50.023 |
| 0.519375 | 50.023 |
| 0.5193865740740741 | 50.022 |
| 0.5193981481481481 | 50.021 |
| 0.5194097222222221 | 50.021 |
| 0.5194212962962963 | 50.021 |
| 0.5194328703703703 | 50.02 |
| 0.5194444444444445 | 50.018 |
| 0.5194560185185185 | 50.019 |
| 0.5194675925925926 | 50.021 |
| 0.5194791666666666 | 50.021 |
| 0.5194907407407408 | 50.02 |
| 0.5195023148148148 | 50.019 |
| 0.5195138888888889 | 50.02 |
| 0.519525462962963 | 50.019 |
| 0.519537037037037 | 50.017 |
| 0.5195486111111111 | 50.014 |
| 0.5195601851851852 | 50.013 |
| 0.5195717592592592 | 50.013 |
| 0.5195833333333334 | 50.012 |
| 0.5195949074074074 | 50.012 |
| 0.5196064814814815 | 50.015 |
| 0.5196180555555555 | 50.015 |
| 0.5196296296296297 | 50.017 |
| 0.5196412037037037 | 50.017 |
| 0.5196527777777779 | 50.017 |
| 0.5196643518518519 | 50.02 |
| 0.5196759259259259 | 50.02 |
| 0.5196875 | 50.02 |
| 0.519699074074074 | 50.021 |
| 0.5197106481481482 | 50.021 |
| 0.5197222222222222 | 50.021 |
| 0.5197337962962963 | 50.019 |
| 0.5197453703703704 | 50.015 |
| 0.5197569444444444 | 50.01 |
| 0.5197685185185185 | 50.011 |
| 0.5197800925925926 | 50.011 |
| 0.5197916666666667 | 50.012 |
| 0.5198032407407408 | 50.011 |
| 0.5198148148148148 | 50.009 |
| 0.5198263888888889 | 50.011 |
| 0.5198379629629629 | 50.011 |
| 0.5198495370370371 | 50.013 |
| 0.5198611111111111 | 50.014 |
| 0.5198726851851853 | 50.014 |
| 0.5198842592592593 | 50.017 |
| 0.5198958333333333 | 50.018 |
| 0.5199074074074074 | 50.019 |
| 0.5199189814814814 | 50.02 |
| 0.5199305555555556 | 50.023 |
| 0.5199421296296296 | 50.026 |
| 0.5199537037037038 | 50.027 |
| 0.5199652777777778 | 50.028 |
| 0.5199768518518518 | 50.027 |
| 0.5199884259259259 | 50.026 |
| 0.52 | 50.026 |
| 0.5200115740740741 | 50.025 |
| 0.5200231481481482 | 50.026 |
| 0.5200347222222222 | 50.025 |
| 0.5200462962962963 | 50.024 |
| 0.5200578703703703 | 50.024 |
| 0.5200694444444445 | 50.026 |
| 0.5200810185185185 | 50.028 |
| 0.5200925925925927 | 50.03 |
| 0.5201041666666667 | 50.03 |
| 0.5201157407407407 | 50.03 |
| 0.5201273148148148 | 50.031 |
| 0.5201388888888888 | 50.03 |
| 0.520150462962963 | 50.028 |
| 0.520162037037037 | 50.027 |
| 0.5201736111111112 | 50.024 |
| 0.5201851851851852 | 50.023 |
| 0.5201967592592592 | 50.024 |
| 0.5202083333333333 | 50.023 |
| 0.5202199074074074 | 50.022 |
| 0.5202314814814815 | 50.022 |
| 0.5202430555555556 | 50.021 |
| 0.5202546296296297 | 50.022 |
| 0.5202662037037037 | 50.022 |
| 0.5202777777777777 | 50.021 |
| 0.5202893518518519 | 50.021 |
| 0.5203009259259259 | 50.022 |
| 0.5203125000000001 | 50.025 |
| 0.5203240740740741 | 50.03 |
| 0.5203356481481481 | 50.034 |
| 0.5203472222222222 | 50.038 |
| 0.5203587962962963 | 50.04 |
| 0.5203703703703704 | 50.041 |
| 0.5203819444444444 | 50.043 |
| 0.5203935185185186 | 50.046 |
| 0.5204050925925926 | 50.049 |
| 0.5204166666666666 | 50.053 |
| 0.5204282407407407 | 50.054 |
| 0.5204398148148148 | 50.055 |
| 0.5204513888888889 | 50.055 |
| 0.520462962962963 | 50.054 |
| 0.520474537037037 | 50.053 |
| 0.5204861111111111 | 50.052 |
| 0.5204976851851851 | 50.051 |
| 0.5205092592592593 | 50.05 |
| 0.5205208333333333 | 50.049 |
| 0.5205324074074075 | 50.048 |
| 0.5205439814814815 | 50.049 |
| 0.5205555555555555 | 50.05 |
| 0.5205671296296296 | 50.049 |
| 0.5205787037037037 | 50.049 |
| 0.5205902777777778 | 50.046 |
| 0.5206018518518518 | 50.046 |
| 0.520613425925926 | 50.046 |
| 0.520625 | 50.046 |
| 0.520636574074074 | 50.049 |
| 0.5206481481481481 | 50.051 |
| 0.5206597222222222 | 50.052 |
| 0.5206712962962963 | 50.05 |
| 0.5206828703703704 | 50.05 |
| 0.5206944444444445 | 50.051 |
| 0.5207060185185185 | 50.053 |
| 0.5207175925925925 | 50.053 |
| 0.5207291666666667 | 50.052 |
| 0.5207407407407407 | 50.051 |
| 0.5207523148148149 | 50.05 |
| 0.5207638888888889 | 50.048 |
| 0.520775462962963 | 50.046 |
| 0.520787037037037 | 50.044 |
| 0.5207986111111111 | 50.043 |
| 0.5208101851851852 | 50.042 |
| 0.5208217592592593 | 50.041 |